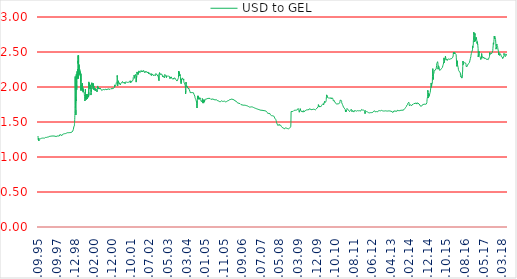
| Category | USD to GEL |
|---|---|
| 25.09.95 | 1.3 |
| 07.10.95 | 1.28 |
| 14.10.95 | 1.28 |
| 21.10.95 | 1.27 |
| 28.10.95 | 1.25 |
| 04.11.95 | 1.245 |
| 11.11.95 | 1.26 |
| 18.11.95 | 1.265 |
| 23.11.95 | 1.258 |
| 02.12.95 | 1.258 |
| 09.12.95 | 1.245 |
| 16.12.95 | 1.245 |
| 23.12.95 | 1.245 |
| 30.12.95 | 1.23 |
| 06.01.96 | 1.23 |
| 13.01.96 | 1.24 |
| 19.01.96 | 1.245 |
| 27.01.96 | 1.25 |
| 03.02.96 | 1.25 |
| 10.02.96 | 1.25 |
| 17.02.96 | 1.256 |
| 24.02.96 | 1.26 |
| 02.03.96 | 1.26 |
| 09.03.96 | 1.26 |
| 16.03.96 | 1.26 |
| 23.03.96 | 1.26 |
| 30.03.96 | 1.262 |
| 06.04.96 | 1.258 |
| 13.04.96 | 1.258 |
| 20.04.96 | 1.255 |
| 27.04.96 | 1.258 |
| 04.05.96 | 1.258 |
| 11.05.96 | 1.258 |
| 18.05.96 | 1.26 |
| 25.05.96 | 1.26 |
| 01.06.96 | 1.26 |
| 08.06.96 | 1.261 |
| 15.06.96 | 1.26 |
| 22.06.96 | 1.26 |
| 29.06.96 | 1.255 |
| 06.07.96 | 1.25 |
| 13.07.96 | 1.264 |
| 20.07.96 | 1.267 |
| 27.07.96 | 1.26 |
| 03.08.96 | 1.262 |
| 10.08.96 | 1.262 |
| 14.08.96 | 1.267 |
| 15.08.96 | 1.268 |
| 16.08.96 | 1.269 |
| 17.08.96 | 1.269 |
| 20.08.96 | 1.268 |
| 21.08.96 | 1.268 |
| 22.08.96 | 1.265 |
| 23.08.96 | 1.268 |
| 24.08.96 | 1.268 |
| 27.08.96 | 1.267 |
| 28.08.96 | 1.267 |
| 31.08.96 | 1.267 |
| 03.09.96 | 1.267 |
| 04.09.96 | 1.267 |
| 05.09.96 | 1.267 |
| 06.09.96 | 1.268 |
| 07.09.96 | 1.269 |
| 10.09.96 | 1.27 |
| 11.09.96 | 1.27 |
| 12.09.96 | 1.27 |
| 13.09.96 | 1.27 |
| 14.09.96 | 1.27 |
| 17.09.96 | 1.27 |
| 18.09.96 | 1.27 |
| 19.09.96 | 1.27 |
| 20.09.96 | 1.27 |
| 23.09.96 | 1.27 |
| 24.09.96 | 1.27 |
| 25.09.96 | 1.27 |
| 26.09.96 | 1.27 |
| 27.09.96 | 1.27 |
| 29.09.96 | 1.27 |
| 30.09.96 | 1.27 |
| 01.10.96 | 1.27 |
| 02.10.96 | 1.27 |
| 03.10.96 | 1.27 |
| 04.10.96 | 1.27 |
| 05.10.96 | 1.27 |
| 08.10.96 | 1.27 |
| 09.10.96 | 1.27 |
| 10.10.96 | 1.27 |
| 11.10.96 | 1.27 |
| 12.10.96 | 1.27 |
| 16.10.96 | 1.27 |
| 17.10.96 | 1.27 |
| 18.10.96 | 1.27 |
| 19.10.96 | 1.27 |
| 22.10.96 | 1.27 |
| 23.10.96 | 1.27 |
| 24.10.96 | 1.27 |
| 25.10.96 | 1.27 |
| 26.10.96 | 1.27 |
| 29.10.96 | 1.27 |
| 30.10.96 | 1.27 |
| 31.10.96 | 1.27 |
| 01.11.96 | 1.27 |
| 02.11.96 | 1.27 |
| 05.11.96 | 1.27 |
| 06.11.96 | 1.27 |
| 08.11.96 | 1.27 |
| 09.11.96 | 1.27 |
| 12.11.96 | 1.27 |
| 13.11.96 | 1.27 |
| 14.11.96 | 1.275 |
| 15.11.96 | 1.277 |
| 16.11.96 | 1.277 |
| 19.11.96 | 1.277 |
| 20.11.96 | 1.28 |
| 21.11.96 | 1.28 |
| 22.11.96 | 1.28 |
| 23.11.96 | 1.28 |
| 26.11.96 | 1.28 |
| 27.11.96 | 1.28 |
| 28.11.96 | 1.28 |
| 29.11.96 | 1.28 |
| 04.12.96 | 1.28 |
| 05.12.96 | 1.28 |
| 06.12.96 | 1.28 |
| 07.12.96 | 1.28 |
| 10.12.96 | 1.28 |
| 11.12.96 | 1.28 |
| 12.12.96 | 1.28 |
| 14.12.96 | 1.28 |
| 17.12.96 | 1.278 |
| 18.12.96 | 1.28 |
| 19.12.96 | 1.28 |
| 20.12.96 | 1.28 |
| 21.12.96 | 1.28 |
| 24.12.96 | 1.278 |
| 25.12.96 | 1.282 |
| 26.12.96 | 1.282 |
| 28.12.96 | 1.279 |
| 31.12.96 | 1.276 |
| 01.01.97 | 1.274 |
| 06.01.97 | 1.28 |
| 07.01.97 | 1.285 |
| 09.01.97 | 1.285 |
| 10.01.97 | 1.285 |
| 11.01.97 | 1.285 |
| 14.01.97 | 1.285 |
| 15.01.97 | 1.285 |
| 16.01.97 | 1.285 |
| 17.01.97 | 1.285 |
| 18.01.97 | 1.283 |
| 21.01.97 | 1.282 |
| 22.01.97 | 1.282 |
| 23.01.97 | 1.282 |
| 24.01.97 | 1.285 |
| 25.01.97 | 1.285 |
| 28.01.97 | 1.285 |
| 29.01.97 | 1.285 |
| 30.01.97 | 1.285 |
| 31.01.97 | 1.285 |
| 01.02.97 | 1.287 |
| 04.02.97 | 1.287 |
| 05.02.97 | 1.287 |
| 06.02.97 | 1.287 |
| 07.02.97 | 1.287 |
| 08.02.97 | 1.287 |
| 11.02.97 | 1.287 |
| 12.02.97 | 1.287 |
| 13.02.97 | 1.287 |
| 14.02.97 | 1.287 |
| 15.02.97 | 1.287 |
| 18.02.97 | 1.287 |
| 19.02.97 | 1.289 |
| 20.02.97 | 1.29 |
| 21.02.97 | 1.288 |
| 22.02.97 | 1.288 |
| 25.02.97 | 1.288 |
| 26.02.97 | 1.288 |
| 27.02.97 | 1.292 |
| 28.02.97 | 1.29 |
| 01.03.97 | 1.29 |
| 05.03.97 | 1.29 |
| 06.03.97 | 1.288 |
| 07.03.97 | 1.288 |
| 08.03.97 | 1.291 |
| 11.03.97 | 1.291 |
| 12.03.97 | 1.291 |
| 13.03.97 | 1.291 |
| 14.03.97 | 1.294 |
| 15.03.97 | 1.295 |
| 18.03.97 | 1.295 |
| 19.03.97 | 1.296 |
| 20.03.97 | 1.296 |
| 21.03.97 | 1.296 |
| 22.03.97 | 1.297 |
| 26.03.97 | 1.298 |
| 27.03.97 | 1.298 |
| 28.03.97 | 1.297 |
| 29.03.97 | 1.295 |
| 01.04.97 | 1.294 |
| 02.04.97 | 1.294 |
| 03.04.97 | 1.295 |
| 04.04.97 | 1.296 |
| 05.04.97 | 1.296 |
| 08.04.97 | 1.296 |
| 09.04.97 | 1.296 |
| 11.04.97 | 1.296 |
| 12.04.97 | 1.295 |
| 15.04.97 | 1.296 |
| 16.04.97 | 1.297 |
| 17.04.97 | 1.297 |
| 18.04.97 | 1.297 |
| 19.04.97 | 1.297 |
| 22.04.97 | 1.297 |
| 23.04.97 | 1.297 |
| 24.04.97 | 1.297 |
| 25.04.97 | 1.297 |
| 26.04.97 | 1.298 |
| 29.04.97 | 1.299 |
| 30.04.97 | 1.298 |
| 02.05.97 | 1.296 |
| 02.05.97 | 1.296 |
| 05.05.97 | 1.296 |
| 06.05.97 | 1.296 |
| 07.05.97 | 1.296 |
| 08.05.97 | 1.298 |
| 09.05.97 | 1.3 |
| 13.05.97 | 1.3 |
| 14.05.97 | 1.3 |
| 15.05.97 | 1.3 |
| 16.05.97 | 1.3 |
| 17.05.97 | 1.3 |
| 20.05.97 | 1.3 |
| 21.05.97 | 1.3 |
| 22.05.97 | 1.3 |
| 23.05.97 | 1.3 |
| 27.05.97 | 1.3 |
| 28.05.97 | 1.3 |
| 29.05.97 | 1.3 |
| 30.05.97 | 1.3 |
| 31.05.97 | 1.3 |
| 03.06.97 | 1.3 |
| 04.06.97 | 1.3 |
| 05.06.97 | 1.3 |
| 07.06.97 | 1.3 |
| 10.06.97 | 1.3 |
| 11.06.97 | 1.3 |
| 12.06.97 | 1.3 |
| 13.06.97 | 1.3 |
| 14.06.97 | 1.3 |
| 17.06.97 | 1.3 |
| 18.06.97 | 1.3 |
| 19.06.97 | 1.3 |
| 20.06.97 | 1.3 |
| 21.06.97 | 1.3 |
| 24.06.97 | 1.3 |
| 25.06.97 | 1.3 |
| 26.06.97 | 1.3 |
| 27.06.97 | 1.3 |
| 28.06.97 | 1.3 |
| 01.07.97 | 1.3 |
| 02.07.97 | 1.3 |
| 03.07.97 | 1.3 |
| 04.07.97 | 1.3 |
| 05.07.97 | 1.3 |
| 08.07.97 | 1.3 |
| 09.07.97 | 1.3 |
| 10.07.97 | 1.3 |
| 11.07.97 | 1.3 |
| 12.07.97 | 1.3 |
| 15.07.97 | 1.3 |
| 16.07.97 | 1.3 |
| 17.07.97 | 1.3 |
| 18.07.97 | 1.3 |
| 19.07.97 | 1.298 |
| 22.07.97 | 1.298 |
| 23.07.97 | 1.298 |
| 24.07.97 | 1.297 |
| 26.07.97 | 1.298 |
| 29.07.97 | 1.296 |
| 30.07.97 | 1.295 |
| 31.07.97 | 1.294 |
| 01.08.97 | 1.29 |
| 02.08.97 | 1.288 |
| 05.08.97 | 1.288 |
| 06.08.97 | 1.286 |
| 07.08.97 | 1.287 |
| 08.08.97 | 1.288 |
| 09.08.97 | 1.287 |
| 13.08.97 | 1.286 |
| 14.08.97 | 1.286 |
| 15.08.97 | 1.286 |
| 16.08.97 | 1.293 |
| 19.08.97 | 1.292 |
| 20.08.97 | 1.292 |
| 21.08.97 | 1.292 |
| 22.08.97 | 1.292 |
| 23.08.97 | 1.292 |
| 26.08.97 | 1.292 |
| 27.08.97 | 1.292 |
| 28.08.97 | 1.292 |
| 30.08.97 | 1.292 |
| 02.09.97 | 1.292 |
| 03.09.97 | 1.295 |
| 04.09.97 | 1.293 |
| 05.09.97 | 1.296 |
| 06.09.97 | 1.299 |
| 09.09.97 | 1.299 |
| 10.09.97 | 1.299 |
| 11.09.97 | 1.298 |
| 12.09.97 | 1.299 |
| 13.09.97 | 1.3 |
| 16.09.97 | 1.299 |
| 17.09.97 | 1.298 |
| 18.09.97 | 1.298 |
| 19.09.97 | 1.298 |
| 20.09.97 | 1.298 |
| 23.09.97 | 1.298 |
| 24.09.97 | 1.297 |
| 25.09.97 | 1.296 |
| 26.09.97 | 1.298 |
| 27.09.97 | 1.298 |
| 30.09.97 | 1.298 |
| 01.10.97 | 1.298 |
| 02.10.97 | 1.298 |
| 03.10.97 | 1.298 |
| 04.10.97 | 1.298 |
| 07.10.97 | 1.298 |
| 08.10.97 | 1.3 |
| 09.10.97 | 1.3 |
| 10.10.97 | 1.3 |
| 11.10.97 | 1.3 |
| 14.10.97 | 1.3 |
| 16.10.97 | 1.3 |
| 17.10.97 | 1.3 |
| 18.10.97 | 1.3 |
| 21.10.97 | 1.3 |
| 22.10.97 | 1.3 |
| 24.10.97 | 1.3 |
| 25.10.97 | 1.3 |
| 28.10.97 | 1.3 |
| 29.10.97 | 1.3 |
| 30.10.97 | 1.3 |
| 31.10.97 | 1.3 |
| 01.11.97 | 1.3 |
| 04.11.97 | 1.3 |
| 05.11.97 | 1.3 |
| 06.11.97 | 1.3 |
| 07.11.97 | 1.3 |
| 08.11.97 | 1.3 |
| 11.11.97 | 1.3 |
| 12.11.97 | 1.3 |
| 13.11.97 | 1.3 |
| 14.11.97 | 1.3 |
| 15.11.97 | 1.306 |
| 18.11.97 | 1.32 |
| 19.11.97 | 1.315 |
| 20.11.97 | 1.312 |
| 21.11.97 | 1.313 |
| 22.11.97 | 1.314 |
| 25.11.97 | 1.315 |
| 26.11.97 | 1.314 |
| 27.11.97 | 1.313 |
| 28.11.97 | 1.311 |
| 29.11.97 | 1.312 |
| 02.12.97 | 1.313 |
| 03.12.97 | 1.312 |
| 04.12.97 | 1.316 |
| 05.12.97 | 1.315 |
| 06.12.97 | 1.316 |
| 09.12.97 | 1.317 |
| 10.12.97 | 1.315 |
| 11.12.97 | 1.315 |
| 12.12.97 | 1.315 |
| 13.12.97 | 1.316 |
| 16.12.97 | 1.319 |
| 17.12.97 | 1.319 |
| 18.12.97 | 1.324 |
| 19.12.97 | 1.324 |
| 20.12.97 | 1.325 |
| 23.12.97 | 1.322 |
| 24.12.97 | 1.322 |
| 25.12.97 | 1.32 |
| 26.12.97 | 1.319 |
| 27.12.97 | 1.315 |
| 30.12.97 | 1.31 |
| 31.12.97 | 1.304 |
| 01.01.98 | 1.304 |
| 05.01.98 | 1.305 |
| 06.01.98 | 1.306 |
| 07.01.98 | 1.309 |
| 09.01.98 | 1.312 |
| 10.01.98 | 1.315 |
| 13.01.98 | 1.32 |
| 14.01.98 | 1.32 |
| 15.01.98 | 1.32 |
| 16.01.98 | 1.32 |
| 17.01.98 | 1.322 |
| 21.01.98 | 1.323 |
| 22.01.98 | 1.325 |
| 23.01.98 | 1.325 |
| 24.01.98 | 1.327 |
| 27.01.98 | 1.327 |
| 28.01.98 | 1.327 |
| 29.01.98 | 1.326 |
| 30.01.98 | 1.326 |
| 31.01.98 | 1.324 |
| 03.02.98 | 1.324 |
| 04.02.98 | 1.325 |
| 05.02.98 | 1.326 |
| 06.02.98 | 1.326 |
| 07.02.98 | 1.327 |
| 10.02.98 | 1.329 |
| 11.02.98 | 1.329 |
| 12.02.98 | 1.329 |
| 13.02.98 | 1.329 |
| 14.02.98 | 1.329 |
| 18.02.98 | 1.327 |
| 19.02.98 | 1.328 |
| 20.02.98 | 1.33 |
| 21.02.98 | 1.33 |
| 24.02.98 | 1.331 |
| 25.02.98 | 1.332 |
| 26.02.98 | 1.332 |
| 27.02.98 | 1.332 |
| 28.02.98 | 1.332 |
| 03.03.98 | 1.332 |
| 05.03.98 | 1.332 |
| 06.03.98 | 1.333 |
| 07.03.98 | 1.333 |
| 10.03.98 | 1.333 |
| 11.03.98 | 1.333 |
| 12.03.98 | 1.333 |
| 13.03.98 | 1.333 |
| 14.03.98 | 1.334 |
| 17.03.98 | 1.334 |
| 18.03.98 | 1.335 |
| 19.03.98 | 1.335 |
| 20.03.98 | 1.335 |
| 21.03.98 | 1.335 |
| 24.03.98 | 1.335 |
| 28.03.98 | 1.335 |
| 31.03.98 | 1.335 |
| 01.04.98 | 1.335 |
| 02.04.98 | 1.335 |
| 08.04.98 | 1.335 |
| 09.04.98 | 1.335 |
| 11.04.98 | 1.335 |
| 15.04.98 | 1.335 |
| 16.04.98 | 1.335 |
| 17.04.98 | 1.335 |
| 18.04.98 | 1.335 |
| 22.04.98 | 1.335 |
| 23.04.98 | 1.335 |
| 24.04.98 | 1.335 |
| 25.04.98 | 1.335 |
| 29.04.98 | 1.335 |
| 02.05.98 | 1.335 |
| 06.05.98 | 1.335 |
| 07.05.98 | 1.336 |
| 08.05.98 | 1.338 |
| 09.05.98 | 1.339 |
| 12.05.98 | 1.339 |
| 13.05.98 | 1.34 |
| 14.05.98 | 1.342 |
| 15.05.98 | 1.342 |
| 16.05.98 | 1.342 |
| 19.05.98 | 1.342 |
| 20.05.98 | 1.342 |
| 22.05.98 | 1.343 |
| 23.05.98 | 1.344 |
| 26.05.98 | 1.345 |
| 28.05.98 | 1.345 |
| 29.05.98 | 1.347 |
| 30.05.98 | 1.347 |
| 02.06.98 | 1.347 |
| 03.06.98 | 1.345 |
| 04.06.98 | 1.347 |
| 05.06.98 | 1.348 |
| 06.06.98 | 1.349 |
| 10.06.98 | 1.348 |
| 11.06.98 | 1.348 |
| 12.06.98 | 1.348 |
| 13.06.98 | 1.348 |
| 16.06.98 | 1.348 |
| 17.06.98 | 1.348 |
| 18.06.98 | 1.348 |
| 19.06.98 | 1.348 |
| 20.06.98 | 1.348 |
| 23.06.98 | 1.348 |
| 24.06.98 | 1.348 |
| 25.06.98 | 1.348 |
| 26.06.98 | 1.348 |
| 27.06.98 | 1.348 |
| 30.06.98 | 1.348 |
| 02.07.98 | 1.348 |
| 03.07.98 | 1.349 |
| 04.07.98 | 1.35 |
| 08.07.98 | 1.347 |
| 09.07.98 | 1.347 |
| 10.07.98 | 1.347 |
| 11.07.98 | 1.347 |
| 14.07.98 | 1.347 |
| 16.07.98 | 1.347 |
| 18.07.98 | 1.347 |
| 21.07.98 | 1.347 |
| 22.07.98 | 1.347 |
| 23.07.98 | 1.347 |
| 24.07.98 | 1.347 |
| 25.07.98 | 1.347 |
| 28.07.98 | 1.346 |
| 29.07.98 | 1.346 |
| 30.07.98 | 1.346 |
| 31.07.98 | 1.348 |
| 01.08.98 | 1.348 |
| 03.08.98 | 1.348 |
| 04.08.98 | 1.348 |
| 06.08.98 | 1.349 |
| 07.08.98 | 1.349 |
| 08.08.98 | 1.349 |
| 11.08.98 | 1.349 |
| 12.08.98 | 1.349 |
| 13.08.98 | 1.349 |
| 14.08.98 | 1.349 |
| 15.08.98 | 1.349 |
| 18.08.98 | 1.349 |
| 19.08.98 | 1.349 |
| 20.08.98 | 1.349 |
| 21.08.98 | 1.35 |
| 22.08.98 | 1.35 |
| 25.08.98 | 1.35 |
| 26.08.98 | 1.35 |
| 27.08.98 | 1.351 |
| 28.08.98 | 1.35 |
| 01.09.98 | 1.35 |
| 02.09.98 | 1.349 |
| 03.09.98 | 1.349 |
| 04.09.98 | 1.35 |
| 05.09.98 | 1.35 |
| 08.09.98 | 1.35 |
| 09.09.98 | 1.35 |
| 10.09.98 | 1.348 |
| 11.09.98 | 1.349 |
| 12.09.98 | 1.35 |
| 15.09.98 | 1.35 |
| 16.09.98 | 1.351 |
| 17.09.98 | 1.352 |
| 18.09.98 | 1.353 |
| 19.09.98 | 1.354 |
| 22.09.98 | 1.355 |
| 23.09.98 | 1.356 |
| 24.09.98 | 1.358 |
| 25.09.98 | 1.36 |
| 26.09.98 | 1.361 |
| 29.09.98 | 1.362 |
| 30.09.98 | 1.364 |
| 01.10.98 | 1.367 |
| 02.10.98 | 1.369 |
| 03.10.98 | 1.369 |
| 06.10.98 | 1.369 |
| 07.10.98 | 1.369 |
| 08.10.98 | 1.369 |
| 09.10.98 | 1.37 |
| 10.10.98 | 1.37 |
| 13.10.98 | 1.371 |
| 14.10.98 | 1.374 |
| 16.10.98 | 1.376 |
| 17.10.98 | 1.379 |
| 20.10.98 | 1.38 |
| 21.10.98 | 1.38 |
| 22.10.98 | 1.38 |
| 23.10.98 | 1.38 |
| 24.10.98 | 1.38 |
| 27.10.98 | 1.38 |
| 28.10.98 | 1.395 |
| 29.10.98 | 1.4 |
| 30.10.98 | 1.404 |
| 31.10.98 | 1.408 |
| 03.11.98 | 1.414 |
| 04.11.98 | 1.42 |
| 05.11.98 | 1.43 |
| 06.11.98 | 1.435 |
| 07.11.98 | 1.438 |
| 10.11.98 | 1.44 |
| 11.11.98 | 1.44 |
| 12.11.98 | 1.44 |
| 13.11.98 | 1.44 |
| 14.11.98 | 1.44 |
| 17.11.98 | 1.44 |
| 18.11.98 | 1.44 |
| 19.11.98 | 1.445 |
| 20.11.98 | 1.46 |
| 21.11.98 | 1.47 |
| 25.11.98 | 1.48 |
| 26.11.98 | 1.495 |
| 27.11.98 | 1.515 |
| 28.11.98 | 1.535 |
| 01.12.98 | 1.56 |
| 02.12.98 | 1.59 |
| 03.12.98 | 1.62 |
| 04.12.98 | 1.67 |
| 05.12.98 | 1.73 |
| 08.12.98 | 2.1 |
| 09.12.98 | 2.105 |
| 10.12.98 | 2.15 |
| 12.12.98 | 2.14 |
| 15.12.98 | 1.95 |
| 16.12.98 | 1.755 |
| 17.12.98 | 1.7 |
| 18.12.98 | 1.69 |
| 19.12.98 | 1.86 |
| 22.12.98 | 1.77 |
| 23.12.98 | 1.72 |
| 24.12.98 | 1.69 |
| 25.12.98 | 1.65 |
| 26.12.98 | 1.6 |
| 29.12.98 | 1.67 |
| 30.12.98 | 1.82 |
| 31.12.98 | 1.8 |
| 01.01.99 | 1.79 |
| 06.01.99 | 1.97 |
| 07.01.99 | 2.18 |
| 09.01.99 | 2.18 |
| 12.01.99 | 1.961 |
| 13.01.99 | 1.96 |
| 14.01.99 | 2.065 |
| 15.01.99 | 2.08 |
| 16.01.99 | 1.995 |
| 19.01.99 | 1.96 |
| 21.01.99 | 2.025 |
| 22.01.99 | 2.05 |
| 23.01.99 | 2.065 |
| 26.01.99 | 2.09 |
| 27.01.99 | 2.086 |
| 28.01.99 | 2.112 |
| 29.01.99 | 2.225 |
| 30.01.99 | 2.12 |
| 02.02.99 | 2.12 |
| 03.02.99 | 2.195 |
| 04.02.99 | 2.21 |
| 05.02.99 | 2.205 |
| 06.02.99 | 2.155 |
| 09.02.99 | 2.195 |
| 10.02.99 | 2.255 |
| 11.02.99 | 2.15 |
| 12.02.99 | 2.235 |
| 13.02.99 | 2.26 |
| 16.02.99 | 2.285 |
| 17.02.99 | 2.285 |
| 18.02.99 | 2.375 |
| 19.02.99 | 2.37 |
| 20.02.99 | 2.335 |
| 23.02.99 | 2.451 |
| 24.02.99 | 2.39 |
| 27.02.99 | 2.35 |
| 02.03.99 | 2.232 |
| 03.03.99 | 2.12 |
| 05.03.99 | 2.226 |
| 06.03.99 | 2.45 |
| 09.03.99 | 2.35 |
| 10.03.99 | 2.26 |
| 11.03.99 | 2.3 |
| 12.03.99 | 2.295 |
| 13.03.99 | 2.25 |
| 16.03.99 | 2.32 |
| 17.03.99 | 2.32 |
| 18.03.99 | 2.32 |
| 19.03.99 | 2.32 |
| 20.03.99 | 2.294 |
| 23.03.99 | 2.3 |
| 24.03.99 | 2.24 |
| 25.03.99 | 2.22 |
| 26.03.99 | 2.18 |
| 27.03.99 | 2.18 |
| 30.03.99 | 2.18 |
| 31.03.99 | 2.205 |
| 01.04.99 | 2.215 |
| 03.04.99 | 2.25 |
| 06.04.99 | 2.24 |
| 07.04.99 | 2.24 |
| 08.04.99 | 2.21 |
| 09.04.99 | 2.18 |
| 14.04.99 | 2.22 |
| 15.04.99 | 2.22 |
| 16.04.99 | 2.19 |
| 17.04.99 | 2.19 |
| 20.04.99 | 2.16 |
| 21.04.99 | 2.17 |
| 22.04.99 | 2.18 |
| 23.04.99 | 2.18 |
| 24.04.99 | 2.19 |
| 27.04.99 | 2.18 |
| 28.04.99 | 2.171 |
| 29.04.99 | 2.06 |
| 30.04.99 | 1.95 |
| 01.05.99 | 1.94 |
| 04.05.99 | 2.03 |
| 05.05.99 | 2.19 |
| 06.05.99 | 2.08 |
| 07.05.99 | 2.093 |
| 08.05.99 | 2.06 |
| 11.05.99 | 2.05 |
| 12.05.99 | 2.03 |
| 13.05.99 | 2.025 |
| 14.05.99 | 2.025 |
| 15.05.99 | 2.04 |
| 18.05.99 | 2.042 |
| 19.05.99 | 2.03 |
| 20.05.99 | 2.03 |
| 21.05.99 | 1.97 |
| 22.05.99 | 2.03 |
| 25.05.99 | 1.98 |
| 26.05.99 | 1.95 |
| 28.05.99 | 1.95 |
| 29.05.99 | 1.97 |
| 01.06.99 | 1.99 |
| 02.06.99 | 1.98 |
| 03.06.99 | 1.98 |
| 04.06.99 | 1.98 |
| 05.06.99 | 2.038 |
| 08.06.99 | 2.055 |
| 09.06.99 | 2.055 |
| 10.06.99 | 2.05 |
| 11.06.99 | 1.99 |
| 12.06.99 | 2.005 |
| 15.06.99 | 2.005 |
| 16.06.99 | 1.995 |
| 17.06.99 | 1.94 |
| 18.06.99 | 1.98 |
| 19.06.99 | 1.98 |
| 22.06.99 | 1.971 |
| 23.06.99 | 1.97 |
| 24.06.99 | 1.95 |
| 25.06.99 | 1.925 |
| 26.06.99 | 1.96 |
| 29.06.99 | 1.94 |
| 30.06.99 | 1.94 |
| 01.07.99 | 1.94 |
| 02.07.99 | 1.94 |
| 03.07.99 | 1.93 |
| 06.07.99 | 1.935 |
| 07.07.99 | 1.94 |
| 08.07.99 | 1.94 |
| 09.07.99 | 1.94 |
| 10.07.99 | 1.93 |
| 13.07.99 | 1.93 |
| 14.07.99 | 1.935 |
| 15.07.99 | 1.935 |
| 16.07.99 | 1.935 |
| 17.07.99 | 1.925 |
| 20.07.99 | 1.92 |
| 21.07.99 | 1.92 |
| 22.07.99 | 1.89 |
| 23.07.99 | 1.89 |
| 24.07.99 | 1.88 |
| 27.07.99 | 1.88 |
| 28.07.99 | 1.86 |
| 29.07.99 | 1.84 |
| 30.07.99 | 1.84 |
| 31.07.99 | 1.82 |
| 03.08.99 | 1.81 |
| 04.08.99 | 1.8 |
| 05.08.99 | 1.8 |
| 06.08.99 | 1.8 |
| 07.08.99 | 1.8 |
| 10.08.99 | 1.84 |
| 11.08.99 | 1.86 |
| 12.08.99 | 1.885 |
| 13.08.99 | 1.91 |
| 14.08.99 | 1.97 |
| 17.08.99 | 1.91 |
| 18.08.99 | 1.86 |
| 19.08.99 | 1.83 |
| 20.08.99 | 1.875 |
| 21.08.99 | 1.87 |
| 24.08.99 | 1.84 |
| 25.08.99 | 1.83 |
| 26.08.99 | 1.831 |
| 27.08.99 | 1.842 |
| 28.08.99 | 1.86 |
| 31.08.99 | 1.86 |
| 01.09.99 | 1.85 |
| 02.09.99 | 1.82 |
| 03.09.99 | 1.85 |
| 04.09.99 | 1.85 |
| 07.09.99 | 1.88 |
| 08.09.99 | 1.88 |
| 09.09.99 | 1.88 |
| 10.09.99 | 1.86 |
| 11.09.99 | 1.87 |
| 14.09.99 | 1.871 |
| 15.09.99 | 1.89 |
| 16.09.99 | 1.87 |
| 17.09.99 | 1.872 |
| 18.09.99 | 1.875 |
| 21.09.99 | 1.9 |
| 22.09.99 | 1.875 |
| 23.09.99 | 1.86 |
| 24.09.99 | 1.867 |
| 25.09.99 | 1.867 |
| 28.09.99 | 1.86 |
| 29.09.99 | 1.83 |
| 30.09.99 | 1.852 |
| 01.10.99 | 1.85 |
| 02.10.99 | 1.85 |
| 05.10.99 | 1.875 |
| 06.10.99 | 1.855 |
| 07.10.99 | 1.86 |
| 08.10.99 | 1.865 |
| 09.10.99 | 1.865 |
| 12.10.99 | 1.85 |
| 13.10.99 | 1.855 |
| 14.10.99 | 1.855 |
| 16.10.99 | 1.87 |
| 19.10.99 | 1.873 |
| 20.10.99 | 1.865 |
| 21.10.99 | 1.875 |
| 22.10.99 | 1.89 |
| 23.10.99 | 1.912 |
| 26.10.99 | 1.93 |
| 27.10.99 | 1.855 |
| 28.10.99 | 1.885 |
| 29.10.99 | 1.925 |
| 30.10.99 | 1.88 |
| 02.11.99 | 1.975 |
| 03.11.99 | 2.073 |
| 04.11.99 | 2.073 |
| 05.11.99 | 2 |
| 06.11.99 | 1.97 |
| 09.11.99 | 2 |
| 10.11.99 | 2 |
| 11.11.99 | 2.045 |
| 12.11.99 | 2.05 |
| 15.11.99 | 2 |
| 16.11.99 | 2.01 |
| 17.11.99 | 2.05 |
| 18.11.99 | 2.05 |
| 19.11.99 | 2.045 |
| 20.11.99 | 2.06 |
| 23.11.99 | 2.059 |
| 25.11.99 | 2.01 |
| 26.11.99 | 2.01 |
| 27.11.99 | 2 |
| 30.11.99 | 2 |
| 01.12.99 | 2 |
| 02.12.99 | 2 |
| 03.12.99 | 1.98 |
| 04.12.99 | 1.98 |
| 07.12.99 | 2.03 |
| 08.12.99 | 1.98 |
| 09.12.99 | 1.99 |
| 10.12.99 | 1.97 |
| 11.12.99 | 1.97 |
| 14.12.99 | 2.001 |
| 15.12.99 | 1.99 |
| 16.12.99 | 1.97 |
| 17.12.99 | 1.98 |
| 18.12.99 | 1.94 |
| 21.12.99 | 1.945 |
| 22.12.99 | 1.885 |
| 23.12.99 | 1.885 |
| 24.12.99 | 1.885 |
| 25.12.99 | 1.885 |
| 28.12.99 | 1.915 |
| 29.12.99 | 1.915 |
| 30.12.99 | 1.96 |
| 31.12.99 | 1.93 |
| 01.01.00 | 1.96 |
| 02.01.00 | 1.96 |
| 03.01.00 | 1.96 |
| 04.01.00 | 1.99 |
| 05.01.00 | 2.05 |
| 06.01.00 | 2.03 |
| 07.01.00 | 2.06 |
| 08.01.00 | 2.06 |
| 09.01.00 | 2.06 |
| 10.01.00 | 2.06 |
| 11.01.00 | 2.06 |
| 12.01.00 | 2.062 |
| 13.01.00 | 2.04 |
| 14.01.00 | 2.05 |
| 15.01.00 | 2.05 |
| 16.01.00 | 2.05 |
| 17.01.00 | 2.05 |
| 18.01.00 | 2.04 |
| 19.01.00 | 2.01 |
| 20.01.00 | 2.01 |
| 21.01.00 | 2.015 |
| 22.01.00 | 2.037 |
| 23.01.00 | 2.037 |
| 24.01.00 | 2.037 |
| 25.01.00 | 2.037 |
| 26.01.00 | 2.018 |
| 27.01.00 | 2 |
| 28.01.00 | 1.97 |
| 29.01.00 | 1.97 |
| 30.01.00 | 1.97 |
| 31.01.00 | 1.97 |
| 01.02.00 | 2.05 |
| 02.02.00 | 2.03 |
| 03.02.00 | 2.009 |
| 04.02.00 | 2 |
| 05.02.00 | 1.98 |
| 06.02.00 | 1.98 |
| 07.02.00 | 1.98 |
| 08.02.00 | 2.015 |
| 09.02.00 | 1.98 |
| 10.02.00 | 1.96 |
| 11.02.00 | 1.98 |
| 12.02.00 | 1.99 |
| 13.02.00 | 1.99 |
| 14.02.00 | 1.99 |
| 15.02.00 | 1.98 |
| 16.02.00 | 1.969 |
| 17.02.00 | 1.98 |
| 18.02.00 | 1.98 |
| 19.02.00 | 1.959 |
| 20.02.00 | 1.959 |
| 21.02.00 | 1.959 |
| 22.02.00 | 1.975 |
| 23.02.00 | 1.975 |
| 24.02.00 | 1.96 |
| 25.02.00 | 1.97 |
| 26.02.00 | 1.97 |
| 27.02.00 | 1.97 |
| 28.02.00 | 1.97 |
| 29.02.00 | 1.98 |
| 01.03.00 | 1.95 |
| 02.03.00 | 1.96 |
| 03.03.00 | 1.97 |
| 04.03.00 | 1.97 |
| 05.03.00 | 1.97 |
| 06.03.00 | 1.97 |
| 07.03.00 | 1.95 |
| 08.03.00 | 1.96 |
| 09.03.00 | 1.96 |
| 10.03.00 | 1.96 |
| 11.03.00 | 1.97 |
| 12.03.00 | 1.97 |
| 13.03.00 | 1.97 |
| 14.03.00 | 1.97 |
| 15.03.00 | 1.98 |
| 16.03.00 | 1.972 |
| 17.03.00 | 1.972 |
| 18.03.00 | 1.975 |
| 19.03.00 | 1.975 |
| 20.03.00 | 1.975 |
| 21.03.00 | 1.975 |
| 22.03.00 | 1.969 |
| 23.03.00 | 1.96 |
| 24.03.00 | 1.96 |
| 25.03.00 | 1.97 |
| 26.03.00 | 1.97 |
| 27.03.00 | 1.97 |
| 28.03.00 | 1.96 |
| 29.03.00 | 1.964 |
| 30.03.00 | 1.96 |
| 31.03.00 | 1.93 |
| 01.04.00 | 1.93 |
| 02.04.00 | 1.93 |
| 03.04.00 | 1.93 |
| 04.04.00 | 1.964 |
| 05.04.00 | 1.985 |
| 06.04.00 | 1.979 |
| 07.04.00 | 1.985 |
| 08.04.00 | 1.995 |
| 09.04.00 | 1.995 |
| 10.04.00 | 1.995 |
| 11.04.00 | 2.015 |
| 12.04.00 | 2.015 |
| 13.04.00 | 1.995 |
| 14.04.00 | 1.975 |
| 15.04.00 | 2 |
| 16.04.00 | 2 |
| 17.04.00 | 2 |
| 18.04.00 | 1.985 |
| 19.04.00 | 1.987 |
| 20.04.00 | 1.99 |
| 21.04.00 | 1.995 |
| 22.04.00 | 1.985 |
| 23.04.00 | 1.985 |
| 24.04.00 | 1.985 |
| 25.04.00 | 1.98 |
| 26.04.00 | 1.98 |
| 27.04.00 | 1.98 |
| 28.04.00 | 1.98 |
| 29.04.00 | 1.97 |
| 30.04.00 | 1.97 |
| 01.05.00 | 1.97 |
| 02.05.00 | 1.97 |
| 03.05.00 | 1.98 |
| 04.05.00 | 1.975 |
| 05.05.00 | 1.975 |
| 06.05.00 | 1.985 |
| 07.05.00 | 1.985 |
| 08.05.00 | 1.985 |
| 09.05.00 | 1.98 |
| 10.05.00 | 1.98 |
| 11.05.00 | 1.98 |
| 12.05.00 | 1.99 |
| 13.05.00 | 1.99 |
| 14.05.00 | 1.99 |
| 15.05.00 | 1.99 |
| 16.05.00 | 1.985 |
| 17.05.00 | 1.97 |
| 18.05.00 | 1.97 |
| 19.05.00 | 1.98 |
| 20.05.00 | 1.985 |
| 21.05.00 | 1.985 |
| 22.05.00 | 1.985 |
| 23.05.00 | 1.975 |
| 24.05.00 | 1.982 |
| 25.05.00 | 1.982 |
| 26.05.00 | 1.98 |
| 27.05.00 | 1.98 |
| 28.05.00 | 1.98 |
| 29.05.00 | 1.98 |
| 30.05.00 | 1.98 |
| 31.05.00 | 1.973 |
| 01.06.00 | 1.973 |
| 02.06.00 | 1.975 |
| 03.06.00 | 1.97 |
| 04.06.00 | 1.97 |
| 05.06.00 | 1.97 |
| 06.06.00 | 1.97 |
| 07.06.00 | 1.97 |
| 08.06.00 | 1.97 |
| 09.06.00 | 1.97 |
| 10.06.00 | 1.97 |
| 11.06.00 | 1.97 |
| 12.06.00 | 1.97 |
| 13.06.00 | 1.97 |
| 14.06.00 | 1.96 |
| 15.06.00 | 1.95 |
| 16.06.00 | 1.95 |
| 17.06.00 | 1.96 |
| 18.06.00 | 1.96 |
| 19.06.00 | 1.96 |
| 20.06.00 | 1.96 |
| 21.06.00 | 1.96 |
| 22.06.00 | 1.96 |
| 23.06.00 | 1.96 |
| 24.06.00 | 1.96 |
| 25.06.00 | 1.96 |
| 26.06.00 | 1.96 |
| 27.06.00 | 1.96 |
| 28.06.00 | 1.96 |
| 29.06.00 | 1.96 |
| 30.06.00 | 1.96 |
| 01.07.00 | 1.96 |
| 02.07.00 | 1.96 |
| 03.07.00 | 1.96 |
| 04.07.00 | 1.96 |
| 05.07.00 | 1.96 |
| 06.07.00 | 1.96 |
| 07.07.00 | 1.963 |
| 08.07.00 | 1.965 |
| 09.07.00 | 1.965 |
| 10.07.00 | 1.965 |
| 11.07.00 | 1.965 |
| 12.07.00 | 1.965 |
| 13.07.00 | 1.965 |
| 14.07.00 | 1.965 |
| 15.07.00 | 1.965 |
| 16.07.00 | 1.965 |
| 17.07.00 | 1.965 |
| 18.07.00 | 1.965 |
| 19.07.00 | 1.965 |
| 20.07.00 | 1.965 |
| 21.07.00 | 1.965 |
| 22.07.00 | 1.965 |
| 23.07.00 | 1.965 |
| 24.07.00 | 1.965 |
| 25.07.00 | 1.965 |
| 26.07.00 | 1.965 |
| 27.07.00 | 1.965 |
| 28.07.00 | 1.965 |
| 29.07.00 | 1.965 |
| 30.07.00 | 1.965 |
| 31.07.00 | 1.965 |
| 01.08.00 | 1.965 |
| 02.08.00 | 1.96 |
| 03.08.00 | 1.96 |
| 04.08.00 | 1.96 |
| 05.08.00 | 1.96 |
| 06.08.00 | 1.96 |
| 07.08.00 | 1.96 |
| 08.08.00 | 1.965 |
| 09.08.00 | 1.965 |
| 10.08.00 | 1.97 |
| 11.08.00 | 1.97 |
| 12.08.00 | 1.97 |
| 13.08.00 | 1.97 |
| 14.08.00 | 1.97 |
| 15.08.00 | 1.97 |
| 16.08.00 | 1.97 |
| 17.08.00 | 1.97 |
| 18.08.00 | 1.97 |
| 19.08.00 | 1.97 |
| 20.08.00 | 1.97 |
| 21.08.00 | 1.97 |
| 22.08.00 | 1.97 |
| 23.08.00 | 1.97 |
| 24.08.00 | 1.97 |
| 25.08.00 | 1.97 |
| 26.08.00 | 1.96 |
| 27.08.00 | 1.96 |
| 28.08.00 | 1.96 |
| 29.08.00 | 1.96 |
| 30.08.00 | 1.96 |
| 31.08.00 | 1.96 |
| 01.09.00 | 1.97 |
| 02.09.00 | 1.97 |
| 03.09.00 | 1.97 |
| 04.09.00 | 1.97 |
| 05.09.00 | 1.97 |
| 06.09.00 | 1.96 |
| 07.09.00 | 1.96 |
| 08.09.00 | 1.96 |
| 09.09.00 | 1.96 |
| 10.09.00 | 1.96 |
| 11.09.00 | 1.96 |
| 12.09.00 | 1.96 |
| 13.09.00 | 1.96 |
| 14.09.00 | 1.96 |
| 15.09.00 | 1.96 |
| 16.09.00 | 1.96 |
| 17.09.00 | 1.96 |
| 18.09.00 | 1.96 |
| 19.09.00 | 1.96 |
| 20.09.00 | 1.961 |
| 21.09.00 | 1.965 |
| 22.09.00 | 1.973 |
| 23.09.00 | 1.973 |
| 24.09.00 | 1.973 |
| 25.09.00 | 1.973 |
| 26.09.00 | 1.97 |
| 27.09.00 | 1.97 |
| 28.09.00 | 1.97 |
| 29.09.00 | 1.96 |
| 30.09.00 | 1.96 |
| 01.10.00 | 1.96 |
| 02.10.00 | 1.96 |
| 03.10.00 | 1.96 |
| 04.10.00 | 1.975 |
| 05.10.00 | 1.975 |
| 06.10.00 | 1.97 |
| 07.10.00 | 1.97 |
| 08.10.00 | 1.97 |
| 09.10.00 | 1.97 |
| 10.10.00 | 1.975 |
| 11.10.00 | 1.977 |
| 12.10.00 | 1.97 |
| 13.10.00 | 1.97 |
| 14.10.00 | 1.97 |
| 15.10.00 | 1.97 |
| 16.10.00 | 1.97 |
| 17.10.00 | 1.965 |
| 18.10.00 | 1.965 |
| 19.10.00 | 1.965 |
| 20.10.00 | 1.965 |
| 21.10.00 | 1.974 |
| 22.10.00 | 1.974 |
| 23.10.00 | 1.974 |
| 24.10.00 | 1.97 |
| 25.10.00 | 1.971 |
| 26.10.00 | 1.965 |
| 27.10.00 | 1.965 |
| 28.10.00 | 1.965 |
| 29.10.00 | 1.965 |
| 30.10.00 | 1.965 |
| 31.10.00 | 1.967 |
| 01.11.00 | 1.96 |
| 02.11.00 | 1.96 |
| 03.11.00 | 1.975 |
| 04.11.00 | 1.965 |
| 05.11.00 | 1.965 |
| 06.11.00 | 1.965 |
| 07.11.00 | 1.971 |
| 08.11.00 | 1.971 |
| 09.11.00 | 1.975 |
| 10.11.00 | 1.975 |
| 11.11.00 | 1.975 |
| 12.11.00 | 1.975 |
| 13.11.00 | 1.975 |
| 14.11.00 | 1.98 |
| 15.11.00 | 1.975 |
| 16.11.00 | 1.98 |
| 17.11.00 | 1.984 |
| 18.11.00 | 1.98 |
| 19.11.00 | 1.98 |
| 20.11.00 | 1.98 |
| 21.11.00 | 1.975 |
| 22.11.00 | 1.975 |
| 23.11.00 | 1.984 |
| 24.11.00 | 1.984 |
| 25.11.00 | 1.98 |
| 26.11.00 | 1.98 |
| 27.11.00 | 1.98 |
| 28.11.00 | 1.975 |
| 29.11.00 | 1.97 |
| 30.11.00 | 1.97 |
| 01.12.00 | 1.97 |
| 02.12.00 | 1.98 |
| 03.12.00 | 1.98 |
| 04.12.00 | 1.98 |
| 05.12.00 | 1.98 |
| 06.12.00 | 1.98 |
| 07.12.00 | 1.98 |
| 08.12.00 | 1.985 |
| 09.12.00 | 1.985 |
| 10.12.00 | 1.985 |
| 11.12.00 | 1.985 |
| 12.12.00 | 1.985 |
| 13.12.00 | 1.985 |
| 14.12.00 | 1.98 |
| 15.12.00 | 1.985 |
| 16.12.00 | 1.984 |
| 17.12.00 | 1.984 |
| 18.12.00 | 1.984 |
| 19.12.00 | 1.98 |
| 20.12.00 | 1.98 |
| 21.12.00 | 1.98 |
| 22.12.00 | 1.981 |
| 23.12.00 | 1.98 |
| 24.12.00 | 1.98 |
| 25.12.00 | 1.98 |
| 26.12.00 | 1.975 |
| 27.12.00 | 1.975 |
| 28.12.00 | 1.975 |
| 29.12.00 | 1.975 |
| 30.12.00 | 1.975 |
| 31.12.00 | 1.975 |
| 01.01.01 | 1.975 |
| 02.01.01 | 1.975 |
| 03.01.01 | 1.975 |
| 04.01.01 | 1.975 |
| 05.01.01 | 1.99 |
| 06.01.01 | 1.98 |
| 07.01.01 | 1.98 |
| 08.01.01 | 1.98 |
| 09.01.01 | 2 |
| 10.01.01 | 2.03 |
| 11.01.01 | 2.03 |
| 12.01.01 | 2.035 |
| 13.01.01 | 2.042 |
| 14.01.01 | 2.042 |
| 15.01.01 | 2.042 |
| 16.01.01 | 2.04 |
| 17.01.01 | 2.03 |
| 18.01.01 | 2.02 |
| 19.01.01 | 2.01 |
| 20.01.01 | 2.01 |
| 21.01.01 | 2.01 |
| 22.01.01 | 2.01 |
| 23.01.01 | 2 |
| 24.01.01 | 2.02 |
| 25.01.01 | 2.02 |
| 26.01.01 | 2.02 |
| 27.01.01 | 2.015 |
| 28.01.01 | 2.015 |
| 29.01.01 | 2.015 |
| 30.01.01 | 2.02 |
| 31.01.01 | 2.025 |
| 01.02.01 | 2.015 |
| 02.02.01 | 2.025 |
| 03.02.01 | 2.04 |
| 04.02.01 | 2.04 |
| 05.02.01 | 2.04 |
| 06.02.01 | 2.04 |
| 07.02.01 | 2.03 |
| 08.02.01 | 2.03 |
| 09.02.01 | 2.065 |
| 10.02.01 | 2.065 |
| 11.02.01 | 2.065 |
| 12.02.01 | 2.065 |
| 13.02.01 | 2.065 |
| 14.02.01 | 2.065 |
| 15.02.01 | 2.064 |
| 16.02.01 | 2.065 |
| 17.02.01 | 2.07 |
| 18.02.01 | 2.07 |
| 19.02.01 | 2.07 |
| 20.02.01 | 2.075 |
| 21.02.01 | 2.082 |
| 22.02.01 | 2.165 |
| 23.02.01 | 2.14 |
| 24.02.01 | 2.08 |
| 25.02.01 | 2.08 |
| 26.02.01 | 2.08 |
| 27.02.01 | 2.055 |
| 28.02.01 | 2.035 |
| 01.03.01 | 2.015 |
| 02.03.01 | 2.04 |
| 03.03.01 | 2.06 |
| 04.03.01 | 2.06 |
| 05.03.01 | 2.06 |
| 06.03.01 | 2.075 |
| 07.03.01 | 2.075 |
| 08.03.01 | 2.075 |
| 09.03.01 | 2.09 |
| 10.03.01 | 2.09 |
| 11.03.01 | 2.09 |
| 12.03.01 | 2.09 |
| 13.03.01 | 2.09 |
| 14.03.01 | 2.09 |
| 15.03.01 | 2.08 |
| 16.03.01 | 2.08 |
| 17.03.01 | 2.08 |
| 18.03.01 | 2.06 |
| 19.03.01 | 2.06 |
| 20.03.01 | 2.06 |
| 21.03.01 | 2.06 |
| 22.03.01 | 2.065 |
| 23.03.01 | 2.065 |
| 24.03.01 | 2.04 |
| 25.03.01 | 2.053 |
| 26.03.01 | 2.053 |
| 27.03.01 | 2.053 |
| 28.03.01 | 2.05 |
| 29.03.01 | 2.05 |
| 30.03.01 | 2.05 |
| 31.03.01 | 2.06 |
| 01.04.01 | 2.06 |
| 02.04.01 | 2.06 |
| 03.04.01 | 2.07 |
| 04.04.01 | 2.07 |
| 05.04.01 | 2.06 |
| 06.04.01 | 2.05 |
| 07.04.01 | 2.05 |
| 08.04.01 | 2.05 |
| 09.04.01 | 2.05 |
| 10.04.01 | 2.05 |
| 11.04.01 | 2.062 |
| 12.04.01 | 2.063 |
| 13.04.01 | 2.05 |
| 14.04.01 | 2.03 |
| 15.04.01 | 2.03 |
| 16.04.01 | 2.03 |
| 17.04.01 | 2.03 |
| 18.04.01 | 2.04 |
| 19.04.01 | 2.02 |
| 20.04.01 | 2.05 |
| 21.04.01 | 2.05 |
| 22.04.01 | 2.05 |
| 23.04.01 | 2.05 |
| 24.04.01 | 2.06 |
| 25.04.01 | 2.06 |
| 26.04.01 | 2.052 |
| 27.04.01 | 2.055 |
| 28.04.01 | 2.06 |
| 29.04.01 | 2.06 |
| 30.04.01 | 2.06 |
| 01.05.01 | 2.05 |
| 02.05.01 | 2.061 |
| 03.05.01 | 2.061 |
| 04.05.01 | 2.055 |
| 05.05.01 | 2.064 |
| 06.05.01 | 2.064 |
| 07.05.01 | 2.064 |
| 08.05.01 | 2.055 |
| 09.05.01 | 2.055 |
| 10.05.01 | 2.055 |
| 11.05.01 | 2.056 |
| 12.05.01 | 2.06 |
| 13.05.01 | 2.06 |
| 14.05.01 | 2.06 |
| 15.05.01 | 2.06 |
| 16.05.01 | 2.067 |
| 17.05.01 | 2.071 |
| 18.05.01 | 2.078 |
| 19.05.01 | 2.078 |
| 20.05.01 | 2.078 |
| 21.05.01 | 2.078 |
| 22.05.01 | 2.08 |
| 23.05.01 | 2.08 |
| 24.05.01 | 2.08 |
| 25.05.01 | 2.074 |
| 26.05.01 | 2.07 |
| 27.05.01 | 2.07 |
| 28.05.01 | 2.07 |
| 29.05.01 | 2.07 |
| 30.05.01 | 2.055 |
| 31.05.01 | 2.049 |
| 01.06.01 | 2.047 |
| 02.06.01 | 2.047 |
| 03.06.01 | 2.047 |
| 04.06.01 | 2.047 |
| 05.06.01 | 2.047 |
| 06.06.01 | 2.051 |
| 07.06.01 | 2.06 |
| 08.06.01 | 2.064 |
| 09.06.01 | 2.064 |
| 10.06.01 | 2.064 |
| 11.06.01 | 2.064 |
| 12.06.01 | 2.064 |
| 13.06.01 | 2.057 |
| 14.06.01 | 2.058 |
| 15.06.01 | 2.07 |
| 16.06.01 | 2.065 |
| 17.06.01 | 2.065 |
| 18.06.01 | 2.065 |
| 19.06.01 | 2.06 |
| 20.06.01 | 2.069 |
| 21.06.01 | 2.069 |
| 22.06.01 | 2.069 |
| 23.06.01 | 2.065 |
| 24.06.01 | 2.065 |
| 25.06.01 | 2.065 |
| 26.06.01 | 2.06 |
| 27.06.01 | 2.06 |
| 28.06.01 | 2.063 |
| 29.06.01 | 2.061 |
| 30.06.01 | 2.045 |
| 01.07.01 | 2.045 |
| 02.07.01 | 2.045 |
| 03.07.01 | 2.07 |
| 04.07.01 | 2.061 |
| 05.07.01 | 2.062 |
| 06.07.01 | 2.06 |
| 07.07.01 | 2.06 |
| 08.07.01 | 2.06 |
| 09.07.01 | 2.06 |
| 10.07.01 | 2.07 |
| 11.07.01 | 2.07 |
| 12.07.01 | 2.075 |
| 13.07.01 | 2.075 |
| 14.07.01 | 2.07 |
| 15.07.01 | 2.07 |
| 16.07.01 | 2.07 |
| 17.07.01 | 2.06 |
| 18.07.01 | 2.07 |
| 19.07.01 | 2.07 |
| 20.07.01 | 2.07 |
| 21.07.01 | 2.07 |
| 22.07.01 | 2.07 |
| 23.07.01 | 2.07 |
| 24.07.01 | 2.07 |
| 25.07.01 | 2.07 |
| 26.07.01 | 2.07 |
| 27.07.01 | 2.07 |
| 28.07.01 | 2.062 |
| 29.07.01 | 2.062 |
| 30.07.01 | 2.062 |
| 31.07.01 | 2.06 |
| 01.08.01 | 2.06 |
| 02.08.01 | 2.07 |
| 03.08.01 | 2.065 |
| 04.08.01 | 2.066 |
| 05.08.01 | 2.066 |
| 06.08.01 | 2.066 |
| 07.08.01 | 2.056 |
| 08.08.01 | 2.06 |
| 09.08.01 | 2.06 |
| 10.08.01 | 2.064 |
| 11.08.01 | 2.065 |
| 12.08.01 | 2.065 |
| 13.08.01 | 2.065 |
| 14.08.01 | 2.065 |
| 15.08.01 | 2.065 |
| 16.08.01 | 2.065 |
| 17.08.01 | 2.065 |
| 18.08.01 | 2.065 |
| 19.08.01 | 2.065 |
| 20.08.01 | 2.065 |
| 21.08.01 | 2.065 |
| 22.08.01 | 2.065 |
| 23.08.01 | 2.068 |
| 24.08.01 | 2.07 |
| 25.08.01 | 2.065 |
| 26.08.01 | 2.065 |
| 27.08.01 | 2.065 |
| 28.08.01 | 2.065 |
| 29.08.01 | 2.065 |
| 30.08.01 | 2.065 |
| 31.08.01 | 2.065 |
| 01.09.01 | 2.065 |
| 02.09.01 | 2.065 |
| 03.09.01 | 2.065 |
| 04.09.01 | 2.065 |
| 05.09.01 | 2.075 |
| 06.09.01 | 2.075 |
| 07.09.01 | 2.074 |
| 08.09.01 | 2.07 |
| 09.09.01 | 2.07 |
| 10.09.01 | 2.07 |
| 11.09.01 | 2.08 |
| 12.09.01 | 2.075 |
| 13.09.01 | 2.07 |
| 14.09.01 | 2.08 |
| 15.09.01 | 2.08 |
| 16.09.01 | 2.08 |
| 17.09.01 | 2.08 |
| 18.09.01 | 2.08 |
| 19.09.01 | 2.081 |
| 20.09.01 | 2.09 |
| 21.09.01 | 2.08 |
| 22.09.01 | 2.08 |
| 23.09.01 | 2.08 |
| 24.09.01 | 2.08 |
| 25.09.01 | 2.08 |
| 26.09.01 | 2.076 |
| 27.09.01 | 2.066 |
| 28.09.01 | 2.065 |
| 29.09.01 | 2.061 |
| 30.09.01 | 2.061 |
| 01.10.01 | 2.061 |
| 02.10.01 | 2.078 |
| 03.10.01 | 2.072 |
| 04.10.01 | 2.065 |
| 05.10.01 | 2.07 |
| 06.10.01 | 2.071 |
| 07.10.01 | 2.071 |
| 08.10.01 | 2.071 |
| 09.10.01 | 2.071 |
| 10.10.01 | 2.085 |
| 11.10.01 | 2.085 |
| 12.10.01 | 2.085 |
| 13.10.01 | 2.085 |
| 14.10.01 | 2.085 |
| 15.10.01 | 2.085 |
| 16.10.01 | 2.08 |
| 17.10.01 | 2.08 |
| 18.10.01 | 2.08 |
| 19.10.01 | 2.082 |
| 20.10.01 | 2.085 |
| 21.10.01 | 2.085 |
| 22.10.01 | 2.085 |
| 23.10.01 | 2.087 |
| 24.10.01 | 2.087 |
| 25.10.01 | 2.09 |
| 26.10.01 | 2.09 |
| 27.10.01 | 2.085 |
| 28.10.01 | 2.085 |
| 29.10.01 | 2.085 |
| 30.10.01 | 2.085 |
| 31.10.01 | 2.085 |
| 01.11.01 | 2.085 |
| 02.11.01 | 2.085 |
| 03.11.01 | 2.095 |
| 04.11.01 | 2.095 |
| 05.11.01 | 2.095 |
| 06.11.01 | 2.092 |
| 07.11.01 | 2.1 |
| 08.11.01 | 2.108 |
| 09.11.01 | 2.135 |
| 10.11.01 | 2.145 |
| 11.11.01 | 2.145 |
| 12.11.01 | 2.145 |
| 13.11.01 | 2.135 |
| 14.11.01 | 2.136 |
| 15.11.01 | 2.131 |
| 16.11.01 | 2.14 |
| 17.11.01 | 2.131 |
| 18.11.01 | 2.131 |
| 19.11.01 | 2.131 |
| 20.11.01 | 2.151 |
| 21.11.01 | 2.151 |
| 22.11.01 | 2.167 |
| 23.11.01 | 2.165 |
| 24.11.01 | 2.165 |
| 25.11.01 | 2.165 |
| 26.11.01 | 2.165 |
| 27.11.01 | 2.15 |
| 28.11.01 | 2.125 |
| 29.11.01 | 2.125 |
| 30.11.01 | 2.125 |
| 01.12.01 | 2.14 |
| 02.12.01 | 2.14 |
| 03.12.01 | 2.14 |
| 04.12.01 | 2.14 |
| 05.12.01 | 2.165 |
| 06.12.01 | 2.162 |
| 07.12.01 | 2.17 |
| 08.12.01 | 2.17 |
| 09.12.01 | 2.17 |
| 10.12.01 | 2.17 |
| 11.12.01 | 2.17 |
| 12.12.01 | 2.17 |
| 13.12.01 | 2.175 |
| 14.12.01 | 2.18 |
| 15.12.01 | 2.18 |
| 16.12.01 | 2.18 |
| 17.12.01 | 2.18 |
| 18.12.01 | 2.18 |
| 19.12.01 | 2.167 |
| 20.12.01 | 2.155 |
| 21.12.01 | 2.13 |
| 22.12.01 | 2.11 |
| 23.12.01 | 2.11 |
| 24.12.01 | 2.11 |
| 25.12.01 | 2.085 |
| 26.12.01 | 2.07 |
| 27.12.01 | 2.07 |
| 28.12.01 | 2.07 |
| 29.12.01 | 2.06 |
| 30.12.01 | 2.06 |
| 31.12.01 | 2.06 |
| 01.01.02 | 2.06 |
| 02.01.02 | 2.06 |
| 03.01.02 | 2.06 |
| 04.01.02 | 2.06 |
| 05.01.02 | 2.165 |
| 06.01.02 | 2.165 |
| 07.01.02 | 2.165 |
| 08.01.02 | 2.165 |
| 09.01.02 | 2.215 |
| 10.01.02 | 2.225 |
| 11.01.02 | 2.205 |
| 12.01.02 | 2.195 |
| 13.01.02 | 2.195 |
| 14.01.02 | 2.195 |
| 15.01.02 | 2.19 |
| 16.01.02 | 2.18 |
| 17.01.02 | 2.179 |
| 18.01.02 | 2.176 |
| 19.01.02 | 2.18 |
| 20.01.02 | 2.18 |
| 21.01.02 | 2.18 |
| 22.01.02 | 2.18 |
| 23.01.02 | 2.18 |
| 24.01.02 | 2.19 |
| 25.01.02 | 2.2 |
| 26.01.02 | 2.2 |
| 27.01.02 | 2.2 |
| 28.01.02 | 2.2 |
| 29.01.02 | 2.19 |
| 30.01.02 | 2.18 |
| 31.01.02 | 2.197 |
| 01.02.02 | 2.197 |
| 02.02.02 | 2.197 |
| 03.02.02 | 2.197 |
| 04.02.02 | 2.197 |
| 05.02.02 | 2.2 |
| 06.02.02 | 2.2 |
| 07.02.02 | 2.21 |
| 08.02.02 | 2.23 |
| 09.02.02 | 2.23 |
| 10.02.02 | 2.23 |
| 11.02.02 | 2.23 |
| 12.02.02 | 2.215 |
| 13.02.02 | 2.215 |
| 14.02.02 | 2.215 |
| 15.02.02 | 2.22 |
| 16.02.02 | 2.22 |
| 17.02.02 | 2.22 |
| 18.02.02 | 2.22 |
| 19.02.02 | 2.22 |
| 20.02.02 | 2.22 |
| 21.02.02 | 2.22 |
| 22.02.02 | 2.224 |
| 23.02.02 | 2.224 |
| 24.02.02 | 2.224 |
| 25.02.02 | 2.224 |
| 26.02.02 | 2.224 |
| 27.02.02 | 2.205 |
| 28.02.02 | 2.21 |
| 01.03.02 | 2.206 |
| 02.03.02 | 2.225 |
| 03.03.02 | 2.225 |
| 04.03.02 | 2.225 |
| 05.03.02 | 2.23 |
| 06.03.02 | 2.229 |
| 07.03.02 | 2.229 |
| 08.03.02 | 2.235 |
| 09.03.02 | 2.235 |
| 10.03.02 | 2.235 |
| 11.03.02 | 2.235 |
| 12.03.02 | 2.235 |
| 13.03.02 | 2.235 |
| 14.03.02 | 2.235 |
| 15.03.02 | 2.235 |
| 16.03.02 | 2.235 |
| 17.03.02 | 2.235 |
| 18.03.02 | 2.235 |
| 19.03.02 | 2.235 |
| 20.03.02 | 2.235 |
| 21.03.02 | 2.235 |
| 22.03.02 | 2.235 |
| 23.03.02 | 2.235 |
| 24.03.02 | 2.235 |
| 25.03.02 | 2.235 |
| 26.03.02 | 2.233 |
| 27.03.02 | 2.215 |
| 28.03.02 | 2.215 |
| 29.03.02 | 2.215 |
| 30.03.02 | 2.215 |
| 31.03.02 | 2.215 |
| 01.04.02 | 2.215 |
| 02.04.02 | 2.23 |
| 03.04.02 | 2.22 |
| 04.04.02 | 2.22 |
| 05.04.02 | 2.225 |
| 06.04.02 | 2.225 |
| 07.04.02 | 2.225 |
| 08.04.02 | 2.225 |
| 09.04.02 | 2.215 |
| 10.04.02 | 2.215 |
| 11.04.02 | 2.215 |
| 12.04.02 | 2.23 |
| 13.04.02 | 2.23 |
| 14.04.02 | 2.23 |
| 15.04.02 | 2.23 |
| 16.04.02 | 2.235 |
| 17.04.02 | 2.235 |
| 18.04.02 | 2.24 |
| 19.04.02 | 2.24 |
| 20.04.02 | 2.24 |
| 21.04.02 | 2.24 |
| 22.04.02 | 2.24 |
| 23.04.02 | 2.24 |
| 24.04.02 | 2.24 |
| 25.04.02 | 2.24 |
| 26.04.02 | 2.235 |
| 27.04.02 | 2.235 |
| 28.04.02 | 2.235 |
| 29.04.02 | 2.235 |
| 30.04.02 | 2.235 |
| 01.05.02 | 2.215 |
| 02.05.02 | 2.215 |
| 03.05.02 | 2.215 |
| 04.05.02 | 2.205 |
| 05.05.02 | 2.205 |
| 06.05.02 | 2.205 |
| 07.05.02 | 2.205 |
| 08.05.02 | 2.205 |
| 09.05.02 | 2.22 |
| 10.05.02 | 2.22 |
| 11.05.02 | 2.22 |
| 12.05.02 | 2.22 |
| 13.05.02 | 2.22 |
| 14.05.02 | 2.22 |
| 15.05.02 | 2.22 |
| 16.05.02 | 2.205 |
| 17.05.02 | 2.205 |
| 18.05.02 | 2.207 |
| 19.05.02 | 2.207 |
| 20.05.02 | 2.207 |
| 21.05.02 | 2.215 |
| 22.05.02 | 2.225 |
| 23.05.02 | 2.22 |
| 24.05.02 | 2.215 |
| 25.05.02 | 2.215 |
| 26.05.02 | 2.215 |
| 27.05.02 | 2.215 |
| 28.05.02 | 2.215 |
| 29.05.02 | 2.21 |
| 30.05.02 | 2.21 |
| 31.05.02 | 2.215 |
| 01.06.02 | 2.216 |
| 02.06.02 | 2.216 |
| 03.06.02 | 2.216 |
| 04.06.02 | 2.22 |
| 05.06.02 | 2.22 |
| 06.06.02 | 2.22 |
| 07.06.02 | 2.22 |
| 08.06.02 | 2.22 |
| 09.06.02 | 2.22 |
| 10.06.02 | 2.22 |
| 11.06.02 | 2.22 |
| 12.06.02 | 2.22 |
| 13.06.02 | 2.22 |
| 14.06.02 | 2.22 |
| 15.06.02 | 2.22 |
| 16.06.02 | 2.22 |
| 17.06.02 | 2.22 |
| 18.06.02 | 2.22 |
| 19.06.02 | 2.22 |
| 20.06.02 | 2.22 |
| 21.06.02 | 2.215 |
| 22.06.02 | 2.218 |
| 23.06.02 | 2.218 |
| 24.06.02 | 2.218 |
| 25.06.02 | 2.218 |
| 26.06.02 | 2.218 |
| 27.06.02 | 2.215 |
| 28.06.02 | 2.2 |
| 29.06.02 | 2.19 |
| 30.06.02 | 2.19 |
| 01.07.02 | 2.19 |
| 02.07.02 | 2.205 |
| 03.07.02 | 2.2 |
| 04.07.02 | 2.2 |
| 05.07.02 | 2.2 |
| 06.07.02 | 2.215 |
| 07.07.02 | 2.215 |
| 08.07.02 | 2.215 |
| 09.07.02 | 2.215 |
| 10.07.02 | 2.215 |
| 11.07.02 | 2.215 |
| 12.07.02 | 2.215 |
| 13.07.02 | 2.215 |
| 14.07.02 | 2.215 |
| 15.07.02 | 2.215 |
| 16.07.02 | 2.21 |
| 17.07.02 | 2.19 |
| 18.07.02 | 2.195 |
| 19.07.02 | 2.205 |
| 20.07.02 | 2.2 |
| 21.07.02 | 2.2 |
| 22.07.02 | 2.2 |
| 23.07.02 | 2.195 |
| 24.07.02 | 2.195 |
| 25.07.02 | 2.195 |
| 26.07.02 | 2.2 |
| 27.07.02 | 2.2 |
| 28.07.02 | 2.2 |
| 29.07.02 | 2.2 |
| 30.07.02 | 2.195 |
| 31.07.02 | 2.185 |
| 01.08.02 | 2.185 |
| 02.08.02 | 2.19 |
| 03.08.02 | 2.19 |
| 04.08.02 | 2.19 |
| 05.08.02 | 2.19 |
| 06.08.02 | 2.19 |
| 07.08.02 | 2.18 |
| 08.08.02 | 2.18 |
| 09.08.02 | 2.18 |
| 10.08.02 | 2.18 |
| 11.08.02 | 2.18 |
| 12.08.02 | 2.18 |
| 13.08.02 | 2.18 |
| 14.08.02 | 2.175 |
| 15.08.02 | 2.175 |
| 16.08.02 | 2.176 |
| 17.08.02 | 2.176 |
| 18.08.02 | 2.176 |
| 19.08.02 | 2.176 |
| 20.08.02 | 2.177 |
| 21.08.02 | 2.175 |
| 22.08.02 | 2.18 |
| 23.08.02 | 2.185 |
| 24.08.02 | 2.195 |
| 25.08.02 | 2.195 |
| 26.08.02 | 2.195 |
| 27.08.02 | 2.195 |
| 28.08.02 | 2.19 |
| 29.08.02 | 2.19 |
| 30.08.02 | 2.18 |
| 31.08.02 | 2.165 |
| 01.09.02 | 2.165 |
| 02.09.02 | 2.165 |
| 03.09.02 | 2.175 |
| 04.09.02 | 2.175 |
| 05.09.02 | 2.175 |
| 06.09.02 | 2.18 |
| 07.09.02 | 2.18 |
| 08.09.02 | 2.18 |
| 09.09.02 | 2.18 |
| 10.09.02 | 2.18 |
| 11.09.02 | 2.185 |
| 12.09.02 | 2.19 |
| 13.09.02 | 2.183 |
| 14.09.02 | 2.185 |
| 15.09.02 | 2.185 |
| 16.09.02 | 2.185 |
| 17.09.02 | 2.185 |
| 18.09.02 | 2.18 |
| 19.09.02 | 2.175 |
| 20.09.02 | 2.18 |
| 21.09.02 | 2.18 |
| 22.09.02 | 2.18 |
| 23.09.02 | 2.18 |
| 24.09.02 | 2.18 |
| 25.09.02 | 2.18 |
| 26.09.02 | 2.18 |
| 27.09.02 | 2.177 |
| 28.09.02 | 2.175 |
| 29.09.02 | 2.175 |
| 30.09.02 | 2.175 |
| 01.10.02 | 2.17 |
| 02.10.02 | 2.16 |
| 03.10.02 | 2.16 |
| 04.10.02 | 2.16 |
| 05.10.02 | 2.155 |
| 06.10.02 | 2.155 |
| 07.10.02 | 2.155 |
| 08.10.02 | 2.15 |
| 09.10.02 | 2.15 |
| 10.10.02 | 2.155 |
| 11.10.02 | 2.16 |
| 12.10.02 | 2.167 |
| 13.10.02 | 2.167 |
| 14.10.02 | 2.167 |
| 15.10.02 | 2.167 |
| 16.10.02 | 2.167 |
| 17.10.02 | 2.167 |
| 18.10.02 | 2.175 |
| 19.10.02 | 2.175 |
| 20.10.02 | 2.175 |
| 21.10.02 | 2.175 |
| 22.10.02 | 2.175 |
| 23.10.02 | 2.175 |
| 24.10.02 | 2.175 |
| 25.10.02 | 2.173 |
| 26.10.02 | 2.165 |
| 27.10.02 | 2.165 |
| 28.10.02 | 2.165 |
| 29.10.02 | 2.165 |
| 30.10.02 | 2.16 |
| 31.10.02 | 2.165 |
| 01.11.02 | 2.167 |
| 02.11.02 | 2.165 |
| 03.11.02 | 2.165 |
| 04.11.02 | 2.165 |
| 05.11.02 | 2.171 |
| 06.11.02 | 2.175 |
| 07.11.02 | 2.19 |
| 08.11.02 | 2.195 |
| 09.11.02 | 2.195 |
| 10.11.02 | 2.195 |
| 11.11.02 | 2.195 |
| 12.11.02 | 2.18 |
| 13.11.02 | 2.185 |
| 14.11.02 | 2.19 |
| 15.11.02 | 2.19 |
| 16.11.02 | 2.19 |
| 17.11.02 | 2.19 |
| 18.11.02 | 2.19 |
| 19.11.02 | 2.18 |
| 20.11.02 | 2.185 |
| 21.11.02 | 2.185 |
| 22.11.02 | 2.185 |
| 23.11.02 | 2.185 |
| 24.11.02 | 2.185 |
| 25.11.02 | 2.185 |
| 26.11.02 | 2.175 |
| 27.11.02 | 2.175 |
| 28.11.02 | 2.17 |
| 29.11.02 | 2.173 |
| 30.11.02 | 2.165 |
| 01.12.02 | 2.165 |
| 02.12.02 | 2.165 |
| 03.12.02 | 2.16 |
| 04.12.02 | 2.17 |
| 05.12.02 | 2.165 |
| 06.12.02 | 2.165 |
| 07.12.02 | 2.165 |
| 08.12.02 | 2.165 |
| 09.12.02 | 2.165 |
| 10.12.02 | 2.16 |
| 11.12.02 | 2.17 |
| 12.12.02 | 2.165 |
| 13.12.02 | 2.16 |
| 14.12.02 | 2.16 |
| 15.12.02 | 2.16 |
| 16.12.02 | 2.16 |
| 17.12.02 | 2.155 |
| 18.12.02 | 2.15 |
| 19.12.02 | 2.151 |
| 20.12.02 | 2.151 |
| 21.12.02 | 2.14 |
| 22.12.02 | 2.14 |
| 23.12.02 | 2.14 |
| 24.12.02 | 2.125 |
| 25.12.02 | 2.11 |
| 26.12.02 | 2.1 |
| 27.12.02 | 2.1 |
| 28.12.02 | 2.112 |
| 29.12.02 | 2.112 |
| 30.12.02 | 2.112 |
| 31.12.02 | 2.09 |
| 01.01.03 | 2.18 |
| 02.01.03 | 2.18 |
| 03.01.03 | 2.18 |
| 04.01.03 | 2.18 |
| 05.01.03 | 2.18 |
| 06.01.03 | 2.18 |
| 07.01.03 | 2.185 |
| 08.01.03 | 2.185 |
| 09.01.03 | 2.205 |
| 10.01.03 | 2.21 |
| 11.01.03 | 2.209 |
| 12.01.03 | 2.209 |
| 13.01.03 | 2.209 |
| 14.01.03 | 2.2 |
| 15.01.03 | 2.18 |
| 16.01.03 | 2.18 |
| 17.01.03 | 2.185 |
| 18.01.03 | 2.19 |
| 19.01.03 | 2.19 |
| 20.01.03 | 2.19 |
| 21.01.03 | 2.19 |
| 22.01.03 | 2.185 |
| 23.01.03 | 2.186 |
| 24.01.03 | 2.187 |
| 25.01.03 | 2.187 |
| 26.01.03 | 2.187 |
| 27.01.03 | 2.187 |
| 28.01.03 | 2.187 |
| 29.01.03 | 2.176 |
| 30.01.03 | 2.18 |
| 31.01.03 | 2.185 |
| 01.02.03 | 2.185 |
| 02.02.03 | 2.185 |
| 03.02.03 | 2.185 |
| 04.02.03 | 2.187 |
| 05.02.03 | 2.185 |
| 06.02.03 | 2.187 |
| 07.02.03 | 2.19 |
| 08.02.03 | 2.195 |
| 09.02.03 | 2.195 |
| 10.02.03 | 2.195 |
| 11.02.03 | 2.19 |
| 12.02.03 | 2.185 |
| 13.02.03 | 2.185 |
| 14.02.03 | 2.19 |
| 15.02.03 | 2.187 |
| 16.02.03 | 2.187 |
| 17.02.03 | 2.187 |
| 18.02.03 | 2.181 |
| 19.02.03 | 2.18 |
| 20.02.03 | 2.18 |
| 21.02.03 | 2.185 |
| 22.02.03 | 2.19 |
| 23.02.03 | 2.19 |
| 24.02.03 | 2.19 |
| 25.02.03 | 2.183 |
| 26.02.03 | 2.183 |
| 27.02.03 | 2.17 |
| 28.02.03 | 2.175 |
| 01.03.03 | 2.145 |
| 02.03.03 | 2.145 |
| 03.03.03 | 2.145 |
| 04.03.03 | 2.145 |
| 05.03.03 | 2.144 |
| 06.03.03 | 2.15 |
| 07.03.03 | 2.16 |
| 08.03.03 | 2.169 |
| 09.03.03 | 2.169 |
| 10.03.03 | 2.169 |
| 11.03.03 | 2.165 |
| 12.03.03 | 2.165 |
| 13.03.03 | 2.17 |
| 14.03.03 | 2.165 |
| 15.03.03 | 2.16 |
| 16.03.03 | 2.16 |
| 17.03.03 | 2.16 |
| 18.03.03 | 2.15 |
| 19.03.03 | 2.145 |
| 20.03.03 | 2.14 |
| 21.03.03 | 2.14 |
| 22.03.03 | 2.14 |
| 23.03.03 | 2.14 |
| 24.03.03 | 2.14 |
| 25.03.03 | 2.14 |
| 26.03.03 | 2.135 |
| 27.03.03 | 2.135 |
| 28.03.03 | 2.13 |
| 29.03.03 | 2.125 |
| 30.03.03 | 2.125 |
| 31.03.03 | 2.125 |
| 01.04.03 | 2.12 |
| 02.04.03 | 2.135 |
| 03.04.03 | 2.155 |
| 04.04.03 | 2.18 |
| 05.04.03 | 2.18 |
| 06.04.03 | 2.18 |
| 07.04.03 | 2.18 |
| 08.04.03 | 2.17 |
| 09.04.03 | 2.17 |
| 10.04.03 | 2.17 |
| 11.04.03 | 2.169 |
| 12.04.03 | 2.166 |
| 13.04.03 | 2.166 |
| 14.04.03 | 2.166 |
| 15.04.03 | 2.165 |
| 16.04.03 | 2.165 |
| 17.04.03 | 2.171 |
| 18.04.03 | 2.166 |
| 19.04.03 | 2.166 |
| 20.04.03 | 2.166 |
| 21.04.03 | 2.166 |
| 22.04.03 | 2.166 |
| 23.04.03 | 2.155 |
| 24.04.03 | 2.15 |
| 25.04.03 | 2.145 |
| 26.04.03 | 2.145 |
| 27.04.03 | 2.145 |
| 28.04.03 | 2.145 |
| 29.04.03 | 2.145 |
| 30.04.03 | 2.145 |
| 01.05.03 | 2.135 |
| 02.05.03 | 2.16 |
| 03.05.03 | 2.165 |
| 04.05.03 | 2.165 |
| 05.05.03 | 2.165 |
| 06.05.03 | 2.165 |
| 07.05.03 | 2.16 |
| 08.05.03 | 2.155 |
| 09.05.03 | 2.155 |
| 10.05.03 | 2.155 |
| 11.05.03 | 2.155 |
| 12.05.03 | 2.155 |
| 13.05.03 | 2.155 |
| 14.05.03 | 2.16 |
| 15.05.03 | 2.155 |
| 16.05.03 | 2.155 |
| 17.05.03 | 2.155 |
| 18.05.03 | 2.155 |
| 19.05.03 | 2.155 |
| 20.05.03 | 2.155 |
| 21.05.03 | 2.155 |
| 22.05.03 | 2.152 |
| 23.05.03 | 2.152 |
| 24.05.03 | 2.148 |
| 25.05.03 | 2.148 |
| 26.05.03 | 2.148 |
| 27.05.03 | 2.148 |
| 28.05.03 | 2.145 |
| 29.05.03 | 2.145 |
| 30.05.03 | 2.15 |
| 31.05.03 | 2.148 |
| 01.06.03 | 2.148 |
| 02.06.03 | 2.148 |
| 03.06.03 | 2.152 |
| 04.06.03 | 2.152 |
| 05.06.03 | 2.155 |
| 06.06.03 | 2.155 |
| 07.06.03 | 2.155 |
| 08.06.03 | 2.155 |
| 09.06.03 | 2.155 |
| 10.06.03 | 2.155 |
| 11.06.03 | 2.155 |
| 12.06.03 | 2.155 |
| 13.06.03 | 2.155 |
| 14.06.03 | 2.155 |
| 15.06.03 | 2.155 |
| 16.06.03 | 2.155 |
| 17.06.03 | 2.15 |
| 18.06.03 | 2.148 |
| 19.06.03 | 2.148 |
| 20.06.03 | 2.15 |
| 21.06.03 | 2.15 |
| 22.06.03 | 2.15 |
| 23.06.03 | 2.15 |
| 24.06.03 | 2.15 |
| 25.06.03 | 2.15 |
| 26.06.03 | 2.14 |
| 27.06.03 | 2.12 |
| 28.06.03 | 2.11 |
| 29.06.03 | 2.11 |
| 30.06.03 | 2.11 |
| 01.07.03 | 2.11 |
| 02.07.03 | 2.122 |
| 03.07.03 | 2.142 |
| 04.07.03 | 2.138 |
| 05.07.03 | 2.138 |
| 06.07.03 | 2.138 |
| 07.07.03 | 2.138 |
| 08.07.03 | 2.132 |
| 09.07.03 | 2.128 |
| 10.07.03 | 2.13 |
| 11.07.03 | 2.137 |
| 12.07.03 | 2.14 |
| 13.07.03 | 2.14 |
| 14.07.03 | 2.14 |
| 15.07.03 | 2.14 |
| 16.07.03 | 2.14 |
| 17.07.03 | 2.14 |
| 18.07.03 | 2.145 |
| 19.07.03 | 2.145 |
| 20.07.03 | 2.145 |
| 21.07.03 | 2.145 |
| 22.07.03 | 2.14 |
| 23.07.03 | 2.14 |
| 24.07.03 | 2.14 |
| 25.07.03 | 2.14 |
| 26.07.03 | 2.125 |
| 27.07.03 | 2.125 |
| 28.07.03 | 2.125 |
| 29.07.03 | 2.12 |
| 30.07.03 | 2.12 |
| 31.07.03 | 2.121 |
| 01.08.03 | 2.13 |
| 02.08.03 | 2.138 |
| 03.08.03 | 2.138 |
| 04.08.03 | 2.138 |
| 05.08.03 | 2.138 |
| 06.08.03 | 2.135 |
| 07.08.03 | 2.125 |
| 08.08.03 | 2.125 |
| 09.08.03 | 2.12 |
| 10.08.03 | 2.12 |
| 11.08.03 | 2.12 |
| 12.08.03 | 2.11 |
| 13.08.03 | 2.11 |
| 14.08.03 | 2.102 |
| 15.08.03 | 2.11 |
| 16.08.03 | 2.11 |
| 17.08.03 | 2.11 |
| 18.08.03 | 2.11 |
| 19.08.03 | 2.115 |
| 20.08.03 | 2.128 |
| 21.08.03 | 2.135 |
| 22.08.03 | 2.135 |
| 23.08.03 | 2.132 |
| 24.08.03 | 2.132 |
| 25.08.03 | 2.132 |
| 26.08.03 | 2.122 |
| 27.08.03 | 2.12 |
| 28.08.03 | 2.118 |
| 29.08.03 | 2.118 |
| 30.08.03 | 2.112 |
| 31.08.03 | 2.112 |
| 01.09.03 | 2.112 |
| 02.09.03 | 2.115 |
| 03.09.03 | 2.13 |
| 04.09.03 | 2.134 |
| 05.09.03 | 2.134 |
| 06.09.03 | 2.13 |
| 07.09.03 | 2.13 |
| 08.09.03 | 2.13 |
| 09.09.03 | 2.128 |
| 10.09.03 | 2.135 |
| 11.09.03 | 2.135 |
| 12.09.03 | 2.142 |
| 13.09.03 | 2.143 |
| 14.09.03 | 2.143 |
| 15.09.03 | 2.143 |
| 16.09.03 | 2.138 |
| 17.09.03 | 2.138 |
| 18.09.03 | 2.138 |
| 19.09.03 | 2.13 |
| 20.09.03 | 2.125 |
| 21.09.03 | 2.125 |
| 22.09.03 | 2.125 |
| 23.09.03 | 2.12 |
| 24.09.03 | 2.11 |
| 25.09.03 | 2.114 |
| 26.09.03 | 2.114 |
| 27.09.03 | 2.114 |
| 28.09.03 | 2.114 |
| 29.09.03 | 2.114 |
| 30.09.03 | 2.113 |
| 01.10.03 | 2.113 |
| 02.10.03 | 2.113 |
| 03.10.03 | 2.113 |
| 04.10.03 | 2.113 |
| 05.10.03 | 2.113 |
| 06.10.03 | 2.113 |
| 07.10.03 | 2.11 |
| 08.10.03 | 2.11 |
| 09.10.03 | 2.102 |
| 10.10.03 | 2.1 |
| 11.10.03 | 2.1 |
| 12.10.03 | 2.1 |
| 13.10.03 | 2.1 |
| 14.10.03 | 2.092 |
| 15.10.03 | 2.092 |
| 16.10.03 | 2.092 |
| 17.10.03 | 2.09 |
| 18.10.03 | 2.085 |
| 19.10.03 | 2.085 |
| 20.10.03 | 2.085 |
| 21.10.03 | 2.086 |
| 22.10.03 | 2.086 |
| 23.10.03 | 2.089 |
| 24.10.03 | 2.089 |
| 25.10.03 | 2.092 |
| 26.10.03 | 2.092 |
| 27.10.03 | 2.092 |
| 28.10.03 | 2.095 |
| 29.10.03 | 2.102 |
| 30.10.03 | 2.102 |
| 31.10.03 | 2.107 |
| 01.11.03 | 2.104 |
| 02.11.03 | 2.104 |
| 03.11.03 | 2.104 |
| 04.11.03 | 2.104 |
| 05.11.03 | 2.112 |
| 06.11.03 | 2.112 |
| 07.11.03 | 2.12 |
| 08.11.03 | 2.12 |
| 09.11.03 | 2.12 |
| 10.11.03 | 2.12 |
| 11.11.03 | 2.125 |
| 12.11.03 | 2.135 |
| 13.11.03 | 2.175 |
| 14.11.03 | 2.228 |
| 15.11.03 | 2.21 |
| 16.11.03 | 2.21 |
| 17.11.03 | 2.21 |
| 18.11.03 | 2.19 |
| 19.11.03 | 2.19 |
| 20.11.03 | 2.205 |
| 21.11.03 | 2.205 |
| 22.11.03 | 2.22 |
| 23.11.03 | 2.22 |
| 24.11.03 | 2.22 |
| 25.11.03 | 2.21 |
| 26.11.03 | 2.17 |
| 27.11.03 | 2.158 |
| 28.11.03 | 2.165 |
| 29.11.03 | 2.19 |
| 30.11.03 | 2.19 |
| 01.12.03 | 2.19 |
| 02.12.03 | 2.16 |
| 03.12.03 | 2.17 |
| 04.12.03 | 2.18 |
| 05.12.03 | 2.18 |
| 06.12.03 | 2.177 |
| 07.12.03 | 2.177 |
| 08.12.03 | 2.177 |
| 09.12.03 | 2.16 |
| 10.12.03 | 2.16 |
| 11.12.03 | 2.16 |
| 12.12.03 | 2.158 |
| 13.12.03 | 2.145 |
| 14.12.03 | 2.145 |
| 15.12.03 | 2.145 |
| 16.12.03 | 2.09 |
| 17.12.03 | 2.09 |
| 18.12.03 | 2.09 |
| 19.12.03 | 2.09 |
| 20.12.03 | 2.09 |
| 21.12.03 | 2.09 |
| 22.12.03 | 2.09 |
| 23.12.03 | 2.082 |
| 24.12.03 | 2.082 |
| 25.12.03 | 2.047 |
| 26.12.03 | 2.045 |
| 27.12.03 | 2.05 |
| 28.12.03 | 2.05 |
| 29.12.03 | 2.05 |
| 30.12.03 | 2.105 |
| 31.12.03 | 2.075 |
| 01.01.04 | 2.11 |
| 02.01.04 | 2.11 |
| 03.01.04 | 2.11 |
| 04.01.04 | 2.11 |
| 05.01.04 | 2.11 |
| 06.01.04 | 2.11 |
| 07.01.04 | 2.11 |
| 08.01.04 | 2.1 |
| 09.01.04 | 2.1 |
| 10.01.04 | 2.12 |
| 11.01.04 | 2.12 |
| 12.01.04 | 2.12 |
| 13.01.04 | 2.12 |
| 14.01.04 | 2.13 |
| 15.01.04 | 2.13 |
| 16.01.04 | 2.14 |
| 17.01.04 | 2.14 |
| 18.01.04 | 2.135 |
| 19.01.04 | 2.135 |
| 20.01.04 | 2.135 |
| 21.01.04 | 2.135 |
| 22.01.04 | 2.13 |
| 23.01.04 | 2.13 |
| 24.01.04 | 2.125 |
| 25.01.04 | 2.13 |
| 26.01.04 | 2.13 |
| 27.01.04 | 2.13 |
| 28.01.04 | 2.13 |
| 29.01.04 | 2.1 |
| 30.01.04 | 2.105 |
| 31.01.04 | 2.105 |
| 01.02.04 | 2.11 |
| 02.02.04 | 2.11 |
| 03.02.04 | 2.11 |
| 04.02.04 | 2.115 |
| 05.02.04 | 2.1 |
| 06.02.04 | 2.098 |
| 07.02.04 | 2.078 |
| 08.02.04 | 2.078 |
| 09.02.04 | 2.078 |
| 10.02.04 | 2.078 |
| 11.02.04 | 2.07 |
| 12.02.04 | 2.06 |
| 13.02.04 | 2.062 |
| 14.02.04 | 2.06 |
| 15.02.04 | 2.06 |
| 16.02.04 | 2.06 |
| 17.02.04 | 2.06 |
| 18.02.04 | 2.06 |
| 19.02.04 | 2.06 |
| 20.02.04 | 2.045 |
| 21.02.04 | 2.045 |
| 22.02.04 | 2.045 |
| 23.02.04 | 2.045 |
| 24.02.04 | 2.045 |
| 25.02.04 | 2.046 |
| 26.02.04 | 2.045 |
| 27.02.04 | 2.045 |
| 28.02.04 | 2.035 |
| 29.02.04 | 2.027 |
| 01.03.04 | 2.027 |
| 02.03.04 | 2.027 |
| 03.03.04 | 2.02 |
| 04.03.04 | 1.98 |
| 05.03.04 | 1.95 |
| 06.03.04 | 1.9 |
| 07.03.04 | 1.9 |
| 08.03.04 | 1.9 |
| 09.03.04 | 1.9 |
| 10.03.04 | 1.9 |
| 11.03.04 | 1.95 |
| 12.03.04 | 2.03 |
| 13.03.04 | 2.07 |
| 14.03.04 | 2.07 |
| 15.03.04 | 2.07 |
| 16.03.04 | 2.04 |
| 17.03.04 | 2.04 |
| 18.03.04 | 2.03 |
| 19.03.04 | 2 |
| 20.03.04 | 2 |
| 21.03.04 | 2 |
| 22.03.04 | 2 |
| 23.03.04 | 2 |
| 24.03.04 | 2 |
| 25.03.04 | 2 |
| 26.03.04 | 2 |
| 27.03.04 | 2 |
| 28.03.04 | 2 |
| 29.03.04 | 2 |
| 30.03.04 | 2.005 |
| 31.03.04 | 2.005 |
| 01.04.04 | 2.015 |
| 02.04.04 | 2.018 |
| 03.04.04 | 2 |
| 04.04.04 | 2 |
| 05.04.04 | 2 |
| 06.04.04 | 2 |
| 07.04.04 | 2 |
| 08.04.04 | 2 |
| 09.04.04 | 2 |
| 10.04.04 | 2 |
| 11.04.04 | 2 |
| 12.04.04 | 2 |
| 13.04.04 | 2 |
| 14.04.04 | 1.98 |
| 15.04.04 | 1.985 |
| 16.04.04 | 1.985 |
| 17.04.04 | 1.985 |
| 18.04.04 | 1.985 |
| 19.04.04 | 1.985 |
| 20.04.04 | 1.975 |
| 21.04.04 | 1.975 |
| 22.04.04 | 1.975 |
| 23.04.04 | 1.985 |
| 24.04.04 | 1.985 |
| 25.04.04 | 1.985 |
| 26.04.04 | 1.985 |
| 27.04.04 | 1.975 |
| 28.04.04 | 1.975 |
| 29.04.04 | 1.975 |
| 30.04.04 | 1.99 |
| 01.05.04 | 1.98 |
| 02.05.04 | 1.98 |
| 03.05.04 | 1.98 |
| 04.05.04 | 1.97 |
| 05.05.04 | 1.96 |
| 06.05.04 | 1.96 |
| 07.05.04 | 1.96 |
| 08.05.04 | 1.96 |
| 09.05.04 | 1.96 |
| 10.05.04 | 1.96 |
| 11.05.04 | 1.95 |
| 12.05.04 | 1.95 |
| 13.05.04 | 1.95 |
| 14.05.04 | 1.95 |
| 15.05.04 | 1.94 |
| 16.05.04 | 1.94 |
| 17.05.04 | 1.94 |
| 18.05.04 | 1.93 |
| 19.05.04 | 1.92 |
| 20.05.04 | 1.92 |
| 21.05.04 | 1.92 |
| 22.05.04 | 1.92 |
| 23.05.04 | 1.92 |
| 24.05.04 | 1.92 |
| 25.05.04 | 1.92 |
| 26.05.04 | 1.92 |
| 27.05.04 | 1.92 |
| 28.05.04 | 1.92 |
| 29.05.04 | 1.92 |
| 30.05.04 | 1.92 |
| 31.05.04 | 1.92 |
| 01.06.04 | 1.92 |
| 02.06.04 | 1.92 |
| 03.06.04 | 1.92 |
| 04.06.04 | 1.92 |
| 05.06.04 | 1.92 |
| 06.06.04 | 1.92 |
| 07.06.04 | 1.92 |
| 08.06.04 | 1.92 |
| 09.06.04 | 1.92 |
| 10.06.04 | 1.92 |
| 11.06.04 | 1.92 |
| 12.06.04 | 1.92 |
| 13.06.04 | 1.92 |
| 14.06.04 | 1.92 |
| 15.06.04 | 1.92 |
| 16.06.04 | 1.92 |
| 17.06.04 | 1.92 |
| 18.06.04 | 1.92 |
| 19.06.04 | 1.92 |
| 20.06.04 | 1.92 |
| 21.06.04 | 1.92 |
| 22.06.04 | 1.92 |
| 23.06.04 | 1.92 |
| 24.06.04 | 1.92 |
| 25.06.04 | 1.92 |
| 26.06.04 | 1.92 |
| 27.06.04 | 1.92 |
| 28.06.04 | 1.92 |
| 29.06.04 | 1.92 |
| 30.06.04 | 1.92 |
| 01.07.04 | 1.92 |
| 02.07.04 | 1.92 |
| 03.07.04 | 1.92 |
| 04.07.04 | 1.92 |
| 05.07.04 | 1.92 |
| 06.07.04 | 1.92 |
| 07.07.04 | 1.92 |
| 08.07.04 | 1.92 |
| 09.07.04 | 1.92 |
| 10.07.04 | 1.925 |
| 11.07.04 | 1.925 |
| 12.07.04 | 1.925 |
| 13.07.04 | 1.92 |
| 14.07.04 | 1.91 |
| 15.07.04 | 1.91 |
| 16.07.04 | 1.91 |
| 17.07.04 | 1.91 |
| 18.07.04 | 1.91 |
| 19.07.04 | 1.91 |
| 20.07.04 | 1.91 |
| 21.07.04 | 1.895 |
| 22.07.04 | 1.895 |
| 23.07.04 | 1.895 |
| 24.07.04 | 1.895 |
| 25.07.04 | 1.895 |
| 26.07.04 | 1.895 |
| 27.07.04 | 1.895 |
| 28.07.04 | 1.895 |
| 29.07.04 | 1.891 |
| 30.07.04 | 1.891 |
| 31.07.04 | 1.89 |
| 01.08.04 | 1.89 |
| 02.08.04 | 1.89 |
| 03.08.04 | 1.87 |
| 04.08.04 | 1.87 |
| 05.08.04 | 1.87 |
| 06.08.04 | 1.85 |
| 07.08.04 | 1.85 |
| 08.08.04 | 1.85 |
| 09.08.04 | 1.85 |
| 10.08.04 | 1.85 |
| 11.08.04 | 1.85 |
| 12.08.04 | 1.835 |
| 13.08.04 | 1.835 |
| 14.08.04 | 1.832 |
| 15.08.04 | 1.832 |
| 16.08.04 | 1.832 |
| 17.08.04 | 1.83 |
| 18.08.04 | 1.828 |
| 19.08.04 | 1.82 |
| 20.08.04 | 1.82 |
| 21.08.04 | 1.815 |
| 22.08.04 | 1.815 |
| 23.08.04 | 1.815 |
| 24.08.04 | 1.805 |
| 25.08.04 | 1.805 |
| 26.08.04 | 1.8 |
| 27.08.04 | 1.8 |
| 28.08.04 | 1.8 |
| 29.08.04 | 1.8 |
| 30.08.04 | 1.8 |
| 31.08.04 | 1.785 |
| 01.09.04 | 1.775 |
| 02.09.04 | 1.765 |
| 03.09.04 | 1.735 |
| 04.09.04 | 1.72 |
| 05.09.04 | 1.72 |
| 06.09.04 | 1.72 |
| 07.09.04 | 1.71 |
| 08.09.04 | 1.7 |
| 09.09.04 | 1.705 |
| 10.09.04 | 1.705 |
| 11.09.04 | 1.81 |
| 12.09.04 | 1.81 |
| 13.09.04 | 1.81 |
| 14.09.04 | 1.81 |
| 15.09.04 | 1.85 |
| 16.09.04 | 1.87 |
| 17.09.04 | 1.865 |
| 18.09.04 | 1.845 |
| 19.09.04 | 1.845 |
| 20.09.04 | 1.845 |
| 21.09.04 | 1.83 |
| 22.09.04 | 1.858 |
| 23.09.04 | 1.875 |
| 24.09.04 | 1.872 |
| 25.09.04 | 1.84 |
| 26.09.04 | 1.84 |
| 27.09.04 | 1.84 |
| 28.09.04 | 1.865 |
| 29.09.04 | 1.845 |
| 30.09.04 | 1.84 |
| 01.10.04 | 1.825 |
| 02.10.04 | 1.82 |
| 03.10.04 | 1.82 |
| 04.10.04 | 1.82 |
| 05.10.04 | 1.82 |
| 06.10.04 | 1.82 |
| 07.10.04 | 1.845 |
| 08.10.04 | 1.835 |
| 09.10.04 | 1.835 |
| 10.10.04 | 1.835 |
| 11.10.04 | 1.835 |
| 12.10.04 | 1.83 |
| 13.10.04 | 1.83 |
| 14.10.04 | 1.835 |
| 15.10.04 | 1.835 |
| 16.10.04 | 1.835 |
| 17.10.04 | 1.835 |
| 18.10.04 | 1.835 |
| 19.10.04 | 1.825 |
| 20.10.04 | 1.832 |
| 21.10.04 | 1.845 |
| 22.10.04 | 1.83 |
| 23.10.04 | 1.845 |
| 24.10.04 | 1.845 |
| 25.10.04 | 1.845 |
| 26.10.04 | 1.832 |
| 27.10.04 | 1.82 |
| 28.10.04 | 1.83 |
| 29.10.04 | 1.83 |
| 30.10.04 | 1.828 |
| 31.10.04 | 1.828 |
| 01.11.04 | 1.828 |
| 02.11.04 | 1.818 |
| 03.11.04 | 1.827 |
| 04.11.04 | 1.825 |
| 05.11.04 | 1.822 |
| 06.11.04 | 1.81 |
| 07.11.04 | 1.81 |
| 08.11.04 | 1.81 |
| 09.11.04 | 1.805 |
| 10.11.04 | 1.81 |
| 11.11.04 | 1.8 |
| 12.11.04 | 1.8 |
| 13.11.04 | 1.8 |
| 14.11.04 | 1.8 |
| 15.11.04 | 1.8 |
| 16.11.04 | 1.8 |
| 17.11.04 | 1.8 |
| 18.11.04 | 1.79 |
| 19.11.04 | 1.785 |
| 20.11.04 | 1.78 |
| 21.11.04 | 1.78 |
| 22.11.04 | 1.78 |
| 23.11.04 | 1.78 |
| 24.11.04 | 1.78 |
| 25.11.04 | 1.78 |
| 26.11.04 | 1.78 |
| 27.11.04 | 1.78 |
| 28.11.04 | 1.78 |
| 29.11.04 | 1.78 |
| 30.11.04 | 1.78 |
| 01.12.04 | 1.785 |
| 02.12.04 | 1.82 |
| 03.12.04 | 1.835 |
| 04.12.04 | 1.835 |
| 05.12.04 | 1.835 |
| 06.12.04 | 1.835 |
| 07.12.04 | 1.82 |
| 08.12.04 | 1.8 |
| 09.12.04 | 1.795 |
| 10.12.04 | 1.77 |
| 11.12.04 | 1.77 |
| 12.12.04 | 1.77 |
| 13.12.04 | 1.77 |
| 14.12.04 | 1.815 |
| 15.12.04 | 1.8 |
| 16.12.04 | 1.8 |
| 17.12.04 | 1.79 |
| 18.12.04 | 1.791 |
| 19.12.04 | 1.791 |
| 20.12.04 | 1.791 |
| 21.12.04 | 1.791 |
| 22.12.04 | 1.791 |
| 23.12.04 | 1.805 |
| 24.12.04 | 1.805 |
| 25.12.04 | 1.77 |
| 26.12.04 | 1.77 |
| 27.12.04 | 1.77 |
| 28.12.04 | 1.77 |
| 29.12.04 | 1.805 |
| 30.12.04 | 1.82 |
| 31.12.04 | 1.825 |
| 01.01.05 | 1.826 |
| 02.01.05 | 1.826 |
| 03.01.05 | 1.826 |
| 04.01.05 | 1.826 |
| 05.01.05 | 1.826 |
| 06.01.05 | 1.826 |
| 07.01.05 | 1.79 |
| 08.01.05 | 1.79 |
| 09.01.05 | 1.79 |
| 10.01.05 | 1.79 |
| 11.01.05 | 1.815 |
| 12.01.05 | 1.816 |
| 13.01.05 | 1.81 |
| 14.01.05 | 1.815 |
| 15.01.05 | 1.82 |
| 16.01.05 | 1.82 |
| 17.01.05 | 1.82 |
| 18.01.05 | 1.815 |
| 19.01.05 | 1.82 |
| 20.01.05 | 1.82 |
| 21.01.05 | 1.82 |
| 22.01.05 | 1.825 |
| 23.01.05 | 1.825 |
| 24.01.05 | 1.825 |
| 25.01.05 | 1.827 |
| 26.01.05 | 1.82 |
| 27.01.05 | 1.82 |
| 28.01.05 | 1.828 |
| 29.01.05 | 1.82 |
| 30.01.05 | 1.82 |
| 31.01.05 | 1.82 |
| 01.02.05 | 1.815 |
| 02.02.05 | 1.817 |
| 03.02.05 | 1.825 |
| 04.02.05 | 1.82 |
| 05.02.05 | 1.815 |
| 06.02.05 | 1.815 |
| 07.02.05 | 1.815 |
| 08.02.05 | 1.823 |
| 09.02.05 | 1.825 |
| 10.02.05 | 1.825 |
| 11.02.05 | 1.83 |
| 12.02.05 | 1.83 |
| 13.02.05 | 1.83 |
| 14.02.05 | 1.83 |
| 15.02.05 | 1.835 |
| 16.02.05 | 1.84 |
| 17.02.05 | 1.84 |
| 18.02.05 | 1.83 |
| 19.02.05 | 1.83 |
| 20.02.05 | 1.83 |
| 21.02.05 | 1.83 |
| 22.02.05 | 1.835 |
| 23.02.05 | 1.836 |
| 24.02.05 | 1.836 |
| 25.02.05 | 1.836 |
| 26.02.05 | 1.829 |
| 27.02.05 | 1.829 |
| 28.02.05 | 1.829 |
| 01.03.05 | 1.835 |
| 02.03.05 | 1.838 |
| 03.03.05 | 1.838 |
| 04.03.05 | 1.838 |
| 05.03.05 | 1.838 |
| 06.03.05 | 1.838 |
| 07.03.05 | 1.838 |
| 08.03.05 | 1.832 |
| 09.03.05 | 1.832 |
| 10.03.05 | 1.825 |
| 11.03.05 | 1.84 |
| 12.03.05 | 1.84 |
| 13.03.05 | 1.84 |
| 14.03.05 | 1.84 |
| 15.03.05 | 1.83 |
| 16.03.05 | 1.84 |
| 17.03.05 | 1.84 |
| 18.03.05 | 1.835 |
| 19.03.05 | 1.838 |
| 20.03.05 | 1.838 |
| 21.03.05 | 1.838 |
| 22.03.05 | 1.838 |
| 23.03.05 | 1.838 |
| 24.03.05 | 1.84 |
| 25.03.05 | 1.84 |
| 26.03.05 | 1.835 |
| 27.03.05 | 1.835 |
| 28.03.05 | 1.835 |
| 29.03.05 | 1.835 |
| 30.03.05 | 1.84 |
| 31.03.05 | 1.834 |
| 01.04.05 | 1.84 |
| 02.04.05 | 1.84 |
| 03.04.05 | 1.84 |
| 04.04.05 | 1.84 |
| 05.04.05 | 1.84 |
| 06.04.05 | 1.838 |
| 07.04.05 | 1.832 |
| 08.04.05 | 1.832 |
| 09.04.05 | 1.835 |
| 10.04.05 | 1.835 |
| 11.04.05 | 1.835 |
| 12.04.05 | 1.83 |
| 13.04.05 | 1.835 |
| 14.04.05 | 1.83 |
| 15.04.05 | 1.835 |
| 16.04.05 | 1.83 |
| 17.04.05 | 1.83 |
| 18.04.05 | 1.83 |
| 19.04.05 | 1.828 |
| 20.04.05 | 1.825 |
| 21.04.05 | 1.822 |
| 22.04.05 | 1.825 |
| 23.04.05 | 1.828 |
| 24.04.05 | 1.828 |
| 25.04.05 | 1.828 |
| 26.04.05 | 1.825 |
| 27.04.05 | 1.82 |
| 28.04.05 | 1.82 |
| 29.04.05 | 1.825 |
| 30.04.05 | 1.825 |
| 01.05.05 | 1.825 |
| 02.05.05 | 1.825 |
| 03.05.05 | 1.825 |
| 04.05.05 | 1.828 |
| 05.05.05 | 1.82 |
| 06.05.05 | 1.828 |
| 07.05.05 | 1.828 |
| 08.05.05 | 1.828 |
| 09.05.05 | 1.828 |
| 10.05.05 | 1.828 |
| 11.05.05 | 1.822 |
| 12.05.05 | 1.822 |
| 13.05.05 | 1.825 |
| 14.05.05 | 1.825 |
| 15.05.05 | 1.825 |
| 16.05.05 | 1.825 |
| 17.05.05 | 1.82 |
| 18.05.05 | 1.82 |
| 19.05.05 | 1.821 |
| 20.05.05 | 1.825 |
| 21.05.05 | 1.825 |
| 22.05.05 | 1.825 |
| 23.05.05 | 1.825 |
| 24.05.05 | 1.825 |
| 25.05.05 | 1.828 |
| 26.05.05 | 1.827 |
| 27.05.05 | 1.827 |
| 28.05.05 | 1.83 |
| 29.05.05 | 1.83 |
| 30.05.05 | 1.83 |
| 31.05.05 | 1.827 |
| 01.06.05 | 1.83 |
| 02.06.05 | 1.83 |
| 03.06.05 | 1.827 |
| 04.06.05 | 1.822 |
| 05.06.05 | 1.822 |
| 06.06.05 | 1.822 |
| 07.06.05 | 1.82 |
| 08.06.05 | 1.825 |
| 09.06.05 | 1.82 |
| 10.06.05 | 1.82 |
| 11.06.05 | 1.82 |
| 12.06.05 | 1.82 |
| 13.06.05 | 1.82 |
| 14.06.05 | 1.815 |
| 15.06.05 | 1.818 |
| 16.06.05 | 1.817 |
| 17.06.05 | 1.817 |
| 18.06.05 | 1.817 |
| 19.06.05 | 1.817 |
| 20.06.05 | 1.817 |
| 21.06.05 | 1.813 |
| 22.06.05 | 1.815 |
| 23.06.05 | 1.812 |
| 24.06.05 | 1.813 |
| 25.06.05 | 1.815 |
| 26.06.05 | 1.815 |
| 27.06.05 | 1.815 |
| 28.06.05 | 1.815 |
| 29.06.05 | 1.812 |
| 30.06.05 | 1.812 |
| 01.07.05 | 1.812 |
| 02.07.05 | 1.816 |
| 03.07.05 | 1.816 |
| 04.07.05 | 1.816 |
| 05.07.05 | 1.82 |
| 06.07.05 | 1.822 |
| 07.07.05 | 1.818 |
| 08.07.05 | 1.813 |
| 09.07.05 | 1.82 |
| 10.07.05 | 1.82 |
| 11.07.05 | 1.82 |
| 12.07.05 | 1.825 |
| 13.07.05 | 1.822 |
| 14.07.05 | 1.82 |
| 15.07.05 | 1.82 |
| 16.07.05 | 1.82 |
| 17.07.05 | 1.82 |
| 18.07.05 | 1.82 |
| 19.07.05 | 1.82 |
| 20.07.05 | 1.814 |
| 21.07.05 | 1.814 |
| 22.07.05 | 1.814 |
| 23.07.05 | 1.812 |
| 24.07.05 | 1.812 |
| 25.07.05 | 1.812 |
| 26.07.05 | 1.81 |
| 27.07.05 | 1.808 |
| 28.07.05 | 1.808 |
| 29.07.05 | 1.81 |
| 30.07.05 | 1.808 |
| 31.07.05 | 1.808 |
| 01.08.05 | 1.808 |
| 02.08.05 | 1.812 |
| 03.08.05 | 1.818 |
| 04.08.05 | 1.812 |
| 05.08.05 | 1.808 |
| 06.08.05 | 1.802 |
| 07.08.05 | 1.802 |
| 08.08.05 | 1.802 |
| 09.08.05 | 1.803 |
| 10.08.05 | 1.803 |
| 11.08.05 | 1.805 |
| 12.08.05 | 1.805 |
| 13.08.05 | 1.805 |
| 14.08.05 | 1.805 |
| 15.08.05 | 1.805 |
| 16.08.05 | 1.802 |
| 17.08.05 | 1.802 |
| 18.08.05 | 1.802 |
| 19.08.05 | 1.805 |
| 20.08.05 | 1.8 |
| 21.08.05 | 1.8 |
| 22.08.05 | 1.8 |
| 23.08.05 | 1.8 |
| 24.08.05 | 1.8 |
| 25.08.05 | 1.8 |
| 26.08.05 | 1.8 |
| 27.08.05 | 1.792 |
| 28.08.05 | 1.792 |
| 29.08.05 | 1.792 |
| 30.08.05 | 1.79 |
| 31.08.05 | 1.79 |
| 01.09.05 | 1.792 |
| 02.09.05 | 1.792 |
| 03.09.05 | 1.792 |
| 04.09.05 | 1.792 |
| 05.09.05 | 1.792 |
| 06.09.05 | 1.795 |
| 07.09.05 | 1.798 |
| 08.09.05 | 1.8 |
| 09.09.05 | 1.805 |
| 10.09.05 | 1.804 |
| 11.09.05 | 1.804 |
| 12.09.05 | 1.804 |
| 13.09.05 | 1.804 |
| 14.09.05 | 1.8 |
| 15.09.05 | 1.792 |
| 16.09.05 | 1.79 |
| 17.09.05 | 1.788 |
| 18.09.05 | 1.788 |
| 19.09.05 | 1.788 |
| 20.09.05 | 1.785 |
| 21.09.05 | 1.79 |
| 22.09.05 | 1.795 |
| 23.09.05 | 1.8 |
| 24.09.05 | 1.8 |
| 25.09.05 | 1.8 |
| 26.09.05 | 1.8 |
| 27.09.05 | 1.798 |
| 28.09.05 | 1.798 |
| 29.09.05 | 1.798 |
| 30.09.05 | 1.792 |
| 01.10.05 | 1.79 |
| 02.10.05 | 1.79 |
| 03.10.05 | 1.79 |
| 04.10.05 | 1.795 |
| 05.10.05 | 1.795 |
| 06.10.05 | 1.796 |
| 07.10.05 | 1.798 |
| 08.10.05 | 1.802 |
| 09.10.05 | 1.802 |
| 10.10.05 | 1.802 |
| 11.10.05 | 1.8 |
| 12.10.05 | 1.8 |
| 13.10.05 | 1.805 |
| 14.10.05 | 1.806 |
| 15.10.05 | 1.806 |
| 16.10.05 | 1.806 |
| 17.10.05 | 1.806 |
| 18.10.05 | 1.798 |
| 19.10.05 | 1.795 |
| 20.10.05 | 1.797 |
| 21.10.05 | 1.798 |
| 22.10.05 | 1.792 |
| 23.10.05 | 1.792 |
| 24.10.05 | 1.792 |
| 25.10.05 | 1.795 |
| 26.10.05 | 1.795 |
| 27.10.05 | 1.795 |
| 28.10.05 | 1.798 |
| 29.10.05 | 1.798 |
| 30.10.05 | 1.798 |
| 31.10.05 | 1.798 |
| 01.11.05 | 1.802 |
| 02.11.05 | 1.803 |
| 03.11.05 | 1.8 |
| 04.11.05 | 1.8 |
| 05.11.05 | 1.795 |
| 06.11.05 | 1.795 |
| 07.11.05 | 1.795 |
| 08.11.05 | 1.798 |
| 09.11.05 | 1.795 |
| 10.11.05 | 1.792 |
| 11.11.05 | 1.795 |
| 12.11.05 | 1.795 |
| 13.11.05 | 1.795 |
| 14.11.05 | 1.795 |
| 15.11.05 | 1.798 |
| 16.11.05 | 1.798 |
| 17.11.05 | 1.798 |
| 18.11.05 | 1.797 |
| 19.11.05 | 1.795 |
| 20.11.05 | 1.795 |
| 21.11.05 | 1.795 |
| 22.11.05 | 1.795 |
| 23.11.05 | 1.8 |
| 24.11.05 | 1.8 |
| 25.11.05 | 1.8 |
| 26.11.05 | 1.797 |
| 27.11.05 | 1.797 |
| 28.11.05 | 1.797 |
| 29.11.05 | 1.79 |
| 30.11.05 | 1.79 |
| 01.12.05 | 1.792 |
| 02.12.05 | 1.792 |
| 03.12.05 | 1.792 |
| 04.12.05 | 1.792 |
| 05.12.05 | 1.792 |
| 06.12.05 | 1.795 |
| 07.12.05 | 1.795 |
| 08.12.05 | 1.792 |
| 09.12.05 | 1.79 |
| 10.12.05 | 1.785 |
| 11.12.05 | 1.785 |
| 12.12.05 | 1.785 |
| 13.12.05 | 1.786 |
| 14.12.05 | 1.79 |
| 15.12.05 | 1.788 |
| 16.12.05 | 1.78 |
| 17.12.05 | 1.78 |
| 18.12.05 | 1.78 |
| 19.12.05 | 1.78 |
| 20.12.05 | 1.782 |
| 21.12.05 | 1.782 |
| 22.12.05 | 1.782 |
| 23.12.05 | 1.78 |
| 24.12.05 | 1.78 |
| 25.12.05 | 1.78 |
| 26.12.05 | 1.78 |
| 27.12.05 | 1.78 |
| 28.12.05 | 1.785 |
| 29.12.05 | 1.792 |
| 30.12.05 | 1.792 |
| 31.12.05 | 1.792 |
| 01.01.06 | 1.792 |
| 02.01.06 | 1.792 |
| 03.01.06 | 1.792 |
| 04.01.06 | 1.792 |
| 05.01.06 | 1.798 |
| 06.01.06 | 1.792 |
| 07.01.06 | 1.792 |
| 08.01.06 | 1.792 |
| 09.01.06 | 1.792 |
| 10.01.06 | 1.798 |
| 11.01.06 | 1.802 |
| 12.01.06 | 1.802 |
| 13.01.06 | 1.798 |
| 14.01.06 | 1.802 |
| 15.01.06 | 1.802 |
| 16.01.06 | 1.802 |
| 17.01.06 | 1.8 |
| 18.01.06 | 1.803 |
| 19.01.06 | 1.808 |
| 20.01.06 | 1.808 |
| 21.01.06 | 1.808 |
| 22.01.06 | 1.808 |
| 23.01.06 | 1.808 |
| 24.01.06 | 1.805 |
| 25.01.06 | 1.805 |
| 26.01.06 | 1.806 |
| 27.01.06 | 1.81 |
| 28.01.06 | 1.81 |
| 29.01.06 | 1.81 |
| 30.01.06 | 1.81 |
| 31.01.06 | 1.812 |
| 01.02.06 | 1.812 |
| 02.02.06 | 1.808 |
| 03.02.06 | 1.808 |
| 04.02.06 | 1.808 |
| 05.02.06 | 1.808 |
| 06.02.06 | 1.808 |
| 07.02.06 | 1.806 |
| 08.02.06 | 1.81 |
| 09.02.06 | 1.811 |
| 10.02.06 | 1.811 |
| 11.02.06 | 1.81 |
| 12.02.06 | 1.81 |
| 13.02.06 | 1.81 |
| 14.02.06 | 1.812 |
| 15.02.06 | 1.812 |
| 16.02.06 | 1.812 |
| 17.02.06 | 1.816 |
| 18.02.06 | 1.82 |
| 19.02.06 | 1.82 |
| 20.02.06 | 1.82 |
| 21.02.06 | 1.82 |
| 22.02.06 | 1.822 |
| 23.02.06 | 1.82 |
| 24.02.06 | 1.82 |
| 25.02.06 | 1.822 |
| 26.02.06 | 1.822 |
| 27.02.06 | 1.822 |
| 28.02.06 | 1.826 |
| 01.03.06 | 1.83 |
| 02.03.06 | 1.83 |
| 03.03.06 | 1.83 |
| 04.03.06 | 1.83 |
| 05.03.06 | 1.83 |
| 06.03.06 | 1.83 |
| 07.03.06 | 1.83 |
| 08.03.06 | 1.83 |
| 09.03.06 | 1.83 |
| 10.03.06 | 1.822 |
| 11.03.06 | 1.826 |
| 12.03.06 | 1.826 |
| 13.03.06 | 1.826 |
| 14.03.06 | 1.825 |
| 15.03.06 | 1.828 |
| 16.03.06 | 1.828 |
| 17.03.06 | 1.828 |
| 18.03.06 | 1.828 |
| 19.03.06 | 1.828 |
| 20.03.06 | 1.828 |
| 21.03.06 | 1.828 |
| 22.03.06 | 1.828 |
| 23.03.06 | 1.828 |
| 24.03.06 | 1.827 |
| 25.03.06 | 1.828 |
| 26.03.06 | 1.828 |
| 27.03.06 | 1.828 |
| 28.03.06 | 1.828 |
| 29.03.06 | 1.826 |
| 30.03.06 | 1.828 |
| 31.03.06 | 1.827 |
| 01.04.06 | 1.826 |
| 02.04.06 | 1.826 |
| 03.04.06 | 1.826 |
| 04.04.06 | 1.827 |
| 05.04.06 | 1.826 |
| 06.04.06 | 1.825 |
| 07.04.06 | 1.825 |
| 08.04.06 | 1.823 |
| 09.04.06 | 1.823 |
| 10.04.06 | 1.823 |
| 11.04.06 | 1.822 |
| 12.04.06 | 1.821 |
| 13.04.06 | 1.821 |
| 14.04.06 | 1.821 |
| 15.04.06 | 1.82 |
| 16.04.06 | 1.82 |
| 17.04.06 | 1.82 |
| 18.04.06 | 1.819 |
| 19.04.06 | 1.819 |
| 20.04.06 | 1.819 |
| 21.04.06 | 1.817 |
| 22.04.06 | 1.817 |
| 23.04.06 | 1.817 |
| 24.04.06 | 1.817 |
| 25.04.06 | 1.817 |
| 26.04.06 | 1.816 |
| 27.04.06 | 1.816 |
| 28.04.06 | 1.816 |
| 29.04.06 | 1.817 |
| 30.04.06 | 1.817 |
| 01.05.06 | 1.817 |
| 02.05.06 | 1.816 |
| 03.05.06 | 1.815 |
| 04.05.06 | 1.815 |
| 05.05.06 | 1.815 |
| 06.05.06 | 1.815 |
| 07.05.06 | 1.815 |
| 08.05.06 | 1.815 |
| 09.05.06 | 1.814 |
| 10.05.06 | 1.814 |
| 11.05.06 | 1.812 |
| 12.05.06 | 1.808 |
| 13.05.06 | 1.808 |
| 14.05.06 | 1.808 |
| 15.05.06 | 1.808 |
| 16.05.06 | 1.806 |
| 17.05.06 | 1.802 |
| 18.05.06 | 1.8 |
| 19.05.06 | 1.8 |
| 20.05.06 | 1.801 |
| 21.05.06 | 1.801 |
| 22.05.06 | 1.801 |
| 23.05.06 | 1.801 |
| 24.05.06 | 1.8 |
| 25.05.06 | 1.8 |
| 26.05.06 | 1.798 |
| 27.05.06 | 1.798 |
| 28.05.06 | 1.798 |
| 29.05.06 | 1.798 |
| 30.05.06 | 1.798 |
| 31.05.06 | 1.8 |
| 01.06.06 | 1.798 |
| 02.06.06 | 1.798 |
| 03.06.06 | 1.798 |
| 04.06.06 | 1.798 |
| 05.06.06 | 1.798 |
| 06.06.06 | 1.796 |
| 07.06.06 | 1.792 |
| 08.06.06 | 1.79 |
| 09.06.06 | 1.788 |
| 10.06.06 | 1.785 |
| 11.06.06 | 1.785 |
| 12.06.06 | 1.785 |
| 13.06.06 | 1.786 |
| 14.06.06 | 1.784 |
| 15.06.06 | 1.782 |
| 16.06.06 | 1.778 |
| 17.06.06 | 1.776 |
| 18.06.06 | 1.776 |
| 19.06.06 | 1.776 |
| 20.06.06 | 1.776 |
| 21.06.06 | 1.777 |
| 22.06.06 | 1.777 |
| 23.06.06 | 1.775 |
| 24.06.06 | 1.775 |
| 25.06.06 | 1.775 |
| 26.06.06 | 1.775 |
| 27.06.06 | 1.775 |
| 28.06.06 | 1.773 |
| 29.06.06 | 1.773 |
| 30.06.06 | 1.773 |
| 01.07.06 | 1.772 |
| 02.07.06 | 1.772 |
| 03.07.06 | 1.772 |
| 04.07.06 | 1.772 |
| 05.07.06 | 1.772 |
| 06.07.06 | 1.772 |
| 07.07.06 | 1.772 |
| 08.07.06 | 1.772 |
| 09.07.06 | 1.772 |
| 10.07.06 | 1.772 |
| 11.07.06 | 1.771 |
| 12.07.06 | 1.77 |
| 13.07.06 | 1.77 |
| 14.07.06 | 1.768 |
| 15.07.06 | 1.766 |
| 16.07.06 | 1.766 |
| 17.07.06 | 1.766 |
| 18.07.06 | 1.765 |
| 19.07.06 | 1.767 |
| 20.07.06 | 1.77 |
| 21.07.06 | 1.771 |
| 22.07.06 | 1.77 |
| 23.07.06 | 1.77 |
| 24.07.06 | 1.77 |
| 25.07.06 | 1.768 |
| 26.07.06 | 1.765 |
| 27.07.06 | 1.765 |
| 28.07.06 | 1.765 |
| 29.07.06 | 1.765 |
| 30.07.06 | 1.765 |
| 31.07.06 | 1.765 |
| 01.08.06 | 1.765 |
| 02.08.06 | 1.765 |
| 03.08.06 | 1.765 |
| 04.08.06 | 1.765 |
| 05.08.06 | 1.763 |
| 06.08.06 | 1.763 |
| 07.08.06 | 1.763 |
| 08.08.06 | 1.761 |
| 09.08.06 | 1.76 |
| 10.08.06 | 1.76 |
| 11.08.06 | 1.76 |
| 12.08.06 | 1.76 |
| 13.08.06 | 1.76 |
| 14.08.06 | 1.76 |
| 15.08.06 | 1.758 |
| 16.08.06 | 1.758 |
| 17.08.06 | 1.754 |
| 18.08.06 | 1.754 |
| 19.08.06 | 1.752 |
| 20.08.06 | 1.752 |
| 21.08.06 | 1.752 |
| 22.08.06 | 1.748 |
| 23.08.06 | 1.743 |
| 24.08.06 | 1.741 |
| 25.08.06 | 1.741 |
| 26.08.06 | 1.741 |
| 27.08.06 | 1.741 |
| 28.08.06 | 1.741 |
| 29.08.06 | 1.741 |
| 30.08.06 | 1.742 |
| 31.08.06 | 1.744 |
| 01.09.06 | 1.744 |
| 02.09.06 | 1.746 |
| 03.09.06 | 1.746 |
| 04.09.06 | 1.746 |
| 05.09.06 | 1.746 |
| 06.09.06 | 1.747 |
| 07.09.06 | 1.747 |
| 08.09.06 | 1.745 |
| 09.09.06 | 1.744 |
| 10.09.06 | 1.744 |
| 11.09.06 | 1.744 |
| 12.09.06 | 1.745 |
| 13.09.06 | 1.745 |
| 14.09.06 | 1.745 |
| 15.09.06 | 1.745 |
| 16.09.06 | 1.745 |
| 17.09.06 | 1.745 |
| 18.09.06 | 1.745 |
| 19.09.06 | 1.742 |
| 20.09.06 | 1.74 |
| 21.09.06 | 1.74 |
| 22.09.06 | 1.74 |
| 23.09.06 | 1.74 |
| 24.09.06 | 1.74 |
| 25.09.06 | 1.74 |
| 26.09.06 | 1.738 |
| 27.09.06 | 1.738 |
| 28.09.06 | 1.738 |
| 29.09.06 | 1.736 |
| 30.09.06 | 1.736 |
| 01.10.06 | 1.736 |
| 02.10.06 | 1.736 |
| 03.10.06 | 1.736 |
| 04.10.06 | 1.736 |
| 05.10.06 | 1.738 |
| 06.10.06 | 1.738 |
| 07.10.06 | 1.739 |
| 08.10.06 | 1.739 |
| 09.10.06 | 1.739 |
| 10.10.06 | 1.738 |
| 11.10.06 | 1.74 |
| 12.10.06 | 1.74 |
| 13.10.06 | 1.742 |
| 14.10.06 | 1.744 |
| 15.10.06 | 1.744 |
| 16.10.06 | 1.744 |
| 17.10.06 | 1.746 |
| 18.10.06 | 1.746 |
| 19.10.06 | 1.746 |
| 20.10.06 | 1.745 |
| 21.10.06 | 1.744 |
| 22.10.06 | 1.744 |
| 23.10.06 | 1.744 |
| 24.10.06 | 1.74 |
| 25.10.06 | 1.74 |
| 26.10.06 | 1.74 |
| 27.10.06 | 1.739 |
| 28.10.06 | 1.739 |
| 29.10.06 | 1.739 |
| 30.10.06 | 1.739 |
| 31.10.06 | 1.739 |
| 01.11.06 | 1.738 |
| 02.11.06 | 1.738 |
| 03.11.06 | 1.736 |
| 04.11.06 | 1.736 |
| 05.11.06 | 1.736 |
| 06.11.06 | 1.736 |
| 07.11.06 | 1.736 |
| 08.11.06 | 1.735 |
| 09.11.06 | 1.736 |
| 10.11.06 | 1.735 |
| 11.11.06 | 1.732 |
| 12.11.06 | 1.732 |
| 13.11.06 | 1.732 |
| 14.11.06 | 1.732 |
| 15.11.06 | 1.735 |
| 16.11.06 | 1.735 |
| 17.11.06 | 1.736 |
| 18.11.06 | 1.734 |
| 19.11.06 | 1.734 |
| 20.11.06 | 1.734 |
| 21.11.06 | 1.735 |
| 22.11.06 | 1.734 |
| 23.11.06 | 1.734 |
| 24.11.06 | 1.734 |
| 25.11.06 | 1.735 |
| 26.11.06 | 1.735 |
| 27.11.06 | 1.735 |
| 28.11.06 | 1.734 |
| 29.11.06 | 1.732 |
| 30.11.06 | 1.732 |
| 01.12.06 | 1.732 |
| 02.12.06 | 1.73 |
| 03.12.06 | 1.73 |
| 04.12.06 | 1.73 |
| 05.12.06 | 1.73 |
| 06.12.06 | 1.73 |
| 07.12.06 | 1.728 |
| 08.12.06 | 1.728 |
| 09.12.06 | 1.728 |
| 10.12.06 | 1.728 |
| 11.12.06 | 1.728 |
| 12.12.06 | 1.727 |
| 13.12.06 | 1.726 |
| 14.12.06 | 1.726 |
| 15.12.06 | 1.725 |
| 16.12.06 | 1.724 |
| 17.12.06 | 1.724 |
| 18.12.06 | 1.724 |
| 19.12.06 | 1.722 |
| 20.12.06 | 1.722 |
| 21.12.06 | 1.722 |
| 22.12.06 | 1.722 |
| 23.12.06 | 1.722 |
| 24.12.06 | 1.722 |
| 25.12.06 | 1.722 |
| 26.12.06 | 1.72 |
| 27.12.06 | 1.715 |
| 28.12.06 | 1.715 |
| 29.12.06 | 1.715 |
| 30.12.06 | 1.714 |
| 31.12.06 | 1.714 |
| 01.01.07 | 1.714 |
| 02.01.07 | 1.714 |
| 03.01.07 | 1.714 |
| 04.01.07 | 1.714 |
| 05.01.07 | 1.714 |
| 06.01.07 | 1.714 |
| 07.01.07 | 1.714 |
| 08.01.07 | 1.714 |
| 09.01.07 | 1.714 |
| 10.01.07 | 1.714 |
| 11.01.07 | 1.714 |
| 12.01.07 | 1.714 |
| 13.01.07 | 1.714 |
| 14.01.07 | 1.714 |
| 15.01.07 | 1.714 |
| 16.01.07 | 1.714 |
| 17.01.07 | 1.714 |
| 18.01.07 | 1.714 |
| 19.01.07 | 1.714 |
| 20.01.07 | 1.714 |
| 21.01.07 | 1.714 |
| 22.01.07 | 1.714 |
| 23.01.07 | 1.714 |
| 24.01.07 | 1.714 |
| 25.01.07 | 1.714 |
| 26.01.07 | 1.714 |
| 27.01.07 | 1.718 |
| 28.01.07 | 1.718 |
| 29.01.07 | 1.718 |
| 30.01.07 | 1.718 |
| 31.01.07 | 1.72 |
| 01.02.07 | 1.72 |
| 02.02.07 | 1.72 |
| 03.02.07 | 1.719 |
| 04.02.07 | 1.719 |
| 05.02.07 | 1.719 |
| 06.02.07 | 1.72 |
| 07.02.07 | 1.718 |
| 08.02.07 | 1.716 |
| 09.02.07 | 1.716 |
| 10.02.07 | 1.714 |
| 11.02.07 | 1.714 |
| 12.02.07 | 1.714 |
| 13.02.07 | 1.714 |
| 14.02.07 | 1.713 |
| 15.02.07 | 1.71 |
| 16.02.07 | 1.71 |
| 17.02.07 | 1.71 |
| 18.02.07 | 1.71 |
| 19.02.07 | 1.71 |
| 20.02.07 | 1.71 |
| 21.02.07 | 1.71 |
| 22.02.07 | 1.71 |
| 23.02.07 | 1.71 |
| 24.02.07 | 1.714 |
| 25.02.07 | 1.714 |
| 26.02.07 | 1.714 |
| 27.02.07 | 1.714 |
| 28.02.07 | 1.713 |
| 01.03.07 | 1.712 |
| 02.03.07 | 1.712 |
| 03.03.07 | 1.71 |
| 04.03.07 | 1.71 |
| 05.03.07 | 1.71 |
| 06.03.07 | 1.71 |
| 07.03.07 | 1.71 |
| 08.03.07 | 1.709 |
| 09.03.07 | 1.708 |
| 10.03.07 | 1.708 |
| 11.03.07 | 1.708 |
| 12.03.07 | 1.708 |
| 13.03.07 | 1.708 |
| 14.03.07 | 1.707 |
| 15.03.07 | 1.706 |
| 16.03.07 | 1.706 |
| 17.03.07 | 1.706 |
| 18.03.07 | 1.706 |
| 19.03.07 | 1.706 |
| 20.03.07 | 1.704 |
| 21.03.07 | 1.704 |
| 22.03.07 | 1.703 |
| 23.03.07 | 1.703 |
| 24.03.07 | 1.702 |
| 25.03.07 | 1.702 |
| 26.03.07 | 1.702 |
| 27.03.07 | 1.701 |
| 28.03.07 | 1.7 |
| 29.03.07 | 1.7 |
| 30.03.07 | 1.7 |
| 31.03.07 | 1.7 |
| 01.04.07 | 1.7 |
| 02.04.07 | 1.7 |
| 03.04.07 | 1.699 |
| 04.04.07 | 1.699 |
| 05.04.07 | 1.699 |
| 06.04.07 | 1.699 |
| 07.04.07 | 1.699 |
| 08.04.07 | 1.699 |
| 09.04.07 | 1.699 |
| 10.04.07 | 1.699 |
| 11.04.07 | 1.698 |
| 12.04.07 | 1.697 |
| 13.04.07 | 1.697 |
| 14.04.07 | 1.697 |
| 15.04.07 | 1.697 |
| 16.04.07 | 1.697 |
| 17.04.07 | 1.694 |
| 18.04.07 | 1.692 |
| 19.04.07 | 1.692 |
| 20.04.07 | 1.691 |
| 21.04.07 | 1.69 |
| 22.04.07 | 1.69 |
| 23.04.07 | 1.69 |
| 24.04.07 | 1.69 |
| 25.04.07 | 1.691 |
| 26.04.07 | 1.691 |
| 27.04.07 | 1.691 |
| 28.04.07 | 1.69 |
| 29.04.07 | 1.69 |
| 30.04.07 | 1.69 |
| 01.05.07 | 1.69 |
| 02.05.07 | 1.689 |
| 03.05.07 | 1.688 |
| 04.05.07 | 1.688 |
| 05.05.07 | 1.687 |
| 06.05.07 | 1.687 |
| 07.05.07 | 1.687 |
| 08.05.07 | 1.687 |
| 09.05.07 | 1.687 |
| 10.05.07 | 1.687 |
| 11.05.07 | 1.686 |
| 12.05.07 | 1.686 |
| 13.05.07 | 1.686 |
| 14.05.07 | 1.686 |
| 15.05.07 | 1.685 |
| 16.05.07 | 1.684 |
| 17.05.07 | 1.684 |
| 18.05.07 | 1.684 |
| 19.05.07 | 1.683 |
| 20.05.07 | 1.683 |
| 21.05.07 | 1.683 |
| 22.05.07 | 1.682 |
| 23.05.07 | 1.682 |
| 24.05.07 | 1.681 |
| 25.05.07 | 1.681 |
| 26.05.07 | 1.68 |
| 27.05.07 | 1.68 |
| 28.05.07 | 1.68 |
| 29.05.07 | 1.679 |
| 30.05.07 | 1.678 |
| 31.05.07 | 1.678 |
| 01.06.07 | 1.678 |
| 02.06.07 | 1.678 |
| 03.06.07 | 1.678 |
| 04.06.07 | 1.678 |
| 05.06.07 | 1.678 |
| 06.06.07 | 1.678 |
| 07.06.07 | 1.678 |
| 08.06.07 | 1.677 |
| 09.06.07 | 1.677 |
| 10.06.07 | 1.677 |
| 11.06.07 | 1.677 |
| 12.06.07 | 1.676 |
| 13.06.07 | 1.676 |
| 14.06.07 | 1.675 |
| 15.06.07 | 1.675 |
| 16.06.07 | 1.674 |
| 17.06.07 | 1.674 |
| 18.06.07 | 1.674 |
| 19.06.07 | 1.674 |
| 20.06.07 | 1.674 |
| 21.06.07 | 1.674 |
| 22.06.07 | 1.673 |
| 23.06.07 | 1.672 |
| 24.06.07 | 1.672 |
| 25.06.07 | 1.672 |
| 26.06.07 | 1.672 |
| 27.06.07 | 1.671 |
| 28.06.07 | 1.67 |
| 29.06.07 | 1.67 |
| 30.06.07 | 1.67 |
| 01.07.07 | 1.67 |
| 02.07.07 | 1.67 |
| 03.07.07 | 1.67 |
| 04.07.07 | 1.669 |
| 05.07.07 | 1.668 |
| 06.07.07 | 1.668 |
| 07.07.07 | 1.668 |
| 08.07.07 | 1.668 |
| 09.07.07 | 1.668 |
| 10.07.07 | 1.668 |
| 11.07.07 | 1.668 |
| 12.07.07 | 1.668 |
| 13.07.07 | 1.668 |
| 14.07.07 | 1.668 |
| 15.07.07 | 1.668 |
| 16.07.07 | 1.668 |
| 17.07.07 | 1.666 |
| 18.07.07 | 1.666 |
| 19.07.07 | 1.666 |
| 20.07.07 | 1.666 |
| 21.07.07 | 1.666 |
| 22.07.07 | 1.666 |
| 23.07.07 | 1.666 |
| 24.07.07 | 1.666 |
| 25.07.07 | 1.666 |
| 26.07.07 | 1.668 |
| 27.07.07 | 1.668 |
| 28.07.07 | 1.668 |
| 29.07.07 | 1.668 |
| 30.07.07 | 1.668 |
| 31.07.07 | 1.668 |
| 01.08.07 | 1.668 |
| 02.08.07 | 1.668 |
| 03.08.07 | 1.668 |
| 04.08.07 | 1.666 |
| 05.08.07 | 1.666 |
| 06.08.07 | 1.666 |
| 07.08.07 | 1.666 |
| 08.08.07 | 1.665 |
| 09.08.07 | 1.665 |
| 10.08.07 | 1.665 |
| 11.08.07 | 1.664 |
| 12.08.07 | 1.664 |
| 13.08.07 | 1.664 |
| 14.08.07 | 1.664 |
| 15.08.07 | 1.664 |
| 16.08.07 | 1.664 |
| 17.08.07 | 1.664 |
| 18.08.07 | 1.664 |
| 19.08.07 | 1.664 |
| 20.08.07 | 1.664 |
| 21.08.07 | 1.664 |
| 22.08.07 | 1.664 |
| 23.08.07 | 1.663 |
| 24.08.07 | 1.663 |
| 25.08.07 | 1.663 |
| 26.08.07 | 1.663 |
| 27.08.07 | 1.663 |
| 28.08.07 | 1.663 |
| 29.08.07 | 1.663 |
| 30.08.07 | 1.662 |
| 31.08.07 | 1.662 |
| 01.09.07 | 1.662 |
| 02.09.07 | 1.662 |
| 03.09.07 | 1.662 |
| 04.09.07 | 1.662 |
| 05.09.07 | 1.662 |
| 06.09.07 | 1.662 |
| 07.09.07 | 1.662 |
| 08.09.07 | 1.662 |
| 09.09.07 | 1.662 |
| 10.09.07 | 1.662 |
| 11.09.07 | 1.66 |
| 12.09.07 | 1.66 |
| 13.09.07 | 1.66 |
| 14.09.07 | 1.66 |
| 15.09.07 | 1.66 |
| 16.09.07 | 1.66 |
| 17.09.07 | 1.66 |
| 18.09.07 | 1.66 |
| 19.09.07 | 1.659 |
| 20.09.07 | 1.659 |
| 21.09.07 | 1.662 |
| 22.09.07 | 1.662 |
| 23.09.07 | 1.662 |
| 24.09.07 | 1.662 |
| 25.09.07 | 1.661 |
| 26.09.07 | 1.66 |
| 27.09.07 | 1.66 |
| 28.09.07 | 1.659 |
| 29.09.07 | 1.658 |
| 30.09.07 | 1.658 |
| 01.10.07 | 1.658 |
| 02.10.07 | 1.656 |
| 03.10.07 | 1.656 |
| 04.10.07 | 1.654 |
| 05.10.07 | 1.652 |
| 06.10.07 | 1.652 |
| 07.10.07 | 1.652 |
| 08.10.07 | 1.652 |
| 09.10.07 | 1.65 |
| 10.10.07 | 1.65 |
| 11.10.07 | 1.65 |
| 12.10.07 | 1.648 |
| 13.10.07 | 1.646 |
| 14.10.07 | 1.646 |
| 15.10.07 | 1.646 |
| 16.10.07 | 1.644 |
| 17.10.07 | 1.642 |
| 18.10.07 | 1.641 |
| 19.10.07 | 1.641 |
| 20.10.07 | 1.638 |
| 21.10.07 | 1.638 |
| 22.10.07 | 1.638 |
| 23.10.07 | 1.636 |
| 24.10.07 | 1.634 |
| 25.10.07 | 1.63 |
| 26.10.07 | 1.628 |
| 27.10.07 | 1.625 |
| 28.10.07 | 1.625 |
| 29.10.07 | 1.625 |
| 30.10.07 | 1.622 |
| 31.10.07 | 1.622 |
| 01.11.07 | 1.622 |
| 02.11.07 | 1.622 |
| 03.11.07 | 1.622 |
| 04.11.07 | 1.622 |
| 05.11.07 | 1.622 |
| 06.11.07 | 1.622 |
| 07.11.07 | 1.622 |
| 08.11.07 | 1.622 |
| 09.11.07 | 1.622 |
| 10.11.07 | 1.622 |
| 11.11.07 | 1.622 |
| 12.11.07 | 1.622 |
| 13.11.07 | 1.622 |
| 14.11.07 | 1.622 |
| 15.11.07 | 1.622 |
| 16.11.07 | 1.623 |
| 17.11.07 | 1.624 |
| 18.11.07 | 1.624 |
| 19.11.07 | 1.624 |
| 20.11.07 | 1.624 |
| 21.11.07 | 1.624 |
| 22.11.07 | 1.624 |
| 23.11.07 | 1.622 |
| 24.11.07 | 1.622 |
| 25.11.07 | 1.622 |
| 26.11.07 | 1.622 |
| 27.11.07 | 1.622 |
| 28.11.07 | 1.622 |
| 29.11.07 | 1.622 |
| 30.11.07 | 1.621 |
| 01.12.07 | 1.621 |
| 02.12.07 | 1.621 |
| 03.12.07 | 1.621 |
| 04.12.07 | 1.618 |
| 05.12.07 | 1.616 |
| 06.12.07 | 1.613 |
| 07.12.07 | 1.611 |
| 08.12.07 | 1.608 |
| 09.12.07 | 1.608 |
| 10.12.07 | 1.608 |
| 11.12.07 | 1.604 |
| 12.12.07 | 1.6 |
| 13.12.07 | 1.598 |
| 14.12.07 | 1.596 |
| 15.12.07 | 1.596 |
| 16.12.07 | 1.596 |
| 17.12.07 | 1.596 |
| 18.12.07 | 1.594 |
| 19.12.07 | 1.594 |
| 20.12.07 | 1.596 |
| 21.12.07 | 1.596 |
| 22.12.07 | 1.596 |
| 23.12.07 | 1.596 |
| 24.12.07 | 1.596 |
| 25.12.07 | 1.594 |
| 26.12.07 | 1.592 |
| 27.12.07 | 1.592 |
| 28.12.07 | 1.592 |
| 29.12.07 | 1.592 |
| 30.12.07 | 1.592 |
| 31.12.07 | 1.592 |
| 01.01.08 | 1.592 |
| 02.01.08 | 1.592 |
| 03.01.08 | 1.592 |
| 04.01.08 | 1.592 |
| 05.01.08 | 1.592 |
| 06.01.08 | 1.592 |
| 07.01.08 | 1.592 |
| 08.01.08 | 1.592 |
| 09.01.08 | 1.593 |
| 10.01.08 | 1.594 |
| 11.01.08 | 1.594 |
| 12.01.08 | 1.59 |
| 13.01.08 | 1.59 |
| 14.01.08 | 1.59 |
| 15.01.08 | 1.59 |
| 16.01.08 | 1.592 |
| 17.01.08 | 1.594 |
| 18.01.08 | 1.594 |
| 19.01.08 | 1.594 |
| 20.01.08 | 1.594 |
| 21.01.08 | 1.594 |
| 22.01.08 | 1.594 |
| 23.01.08 | 1.594 |
| 24.01.08 | 1.595 |
| 25.01.08 | 1.595 |
| 26.01.08 | 1.591 |
| 27.01.08 | 1.591 |
| 28.01.08 | 1.591 |
| 29.01.08 | 1.59 |
| 30.01.08 | 1.591 |
| 31.01.08 | 1.587 |
| 01.02.08 | 1.587 |
| 02.02.08 | 1.582 |
| 03.02.08 | 1.582 |
| 04.02.08 | 1.582 |
| 05.02.08 | 1.585 |
| 06.02.08 | 1.586 |
| 07.02.08 | 1.586 |
| 08.02.08 | 1.586 |
| 09.02.08 | 1.582 |
| 10.02.08 | 1.582 |
| 11.02.08 | 1.582 |
| 12.02.08 | 1.577 |
| 13.02.08 | 1.574 |
| 14.02.08 | 1.57 |
| 15.02.08 | 1.565 |
| 16.02.08 | 1.56 |
| 17.02.08 | 1.56 |
| 18.02.08 | 1.56 |
| 19.02.08 | 1.555 |
| 20.02.08 | 1.551 |
| 21.02.08 | 1.541 |
| 22.02.08 | 1.544 |
| 23.02.08 | 1.547 |
| 24.02.08 | 1.547 |
| 25.02.08 | 1.547 |
| 26.02.08 | 1.549 |
| 27.02.08 | 1.55 |
| 28.02.08 | 1.552 |
| 29.02.08 | 1.554 |
| 01.03.08 | 1.547 |
| 02.03.08 | 1.547 |
| 03.03.08 | 1.547 |
| 04.03.08 | 1.547 |
| 05.03.08 | 1.542 |
| 06.03.08 | 1.538 |
| 07.03.08 | 1.534 |
| 08.03.08 | 1.53 |
| 09.03.08 | 1.53 |
| 10.03.08 | 1.53 |
| 11.03.08 | 1.528 |
| 12.03.08 | 1.526 |
| 13.03.08 | 1.522 |
| 14.03.08 | 1.519 |
| 15.03.08 | 1.513 |
| 16.03.08 | 1.513 |
| 17.03.08 | 1.513 |
| 18.03.08 | 1.505 |
| 19.03.08 | 1.499 |
| 20.03.08 | 1.494 |
| 21.03.08 | 1.489 |
| 22.03.08 | 1.483 |
| 23.03.08 | 1.483 |
| 24.03.08 | 1.483 |
| 25.03.08 | 1.477 |
| 26.03.08 | 1.477 |
| 27.03.08 | 1.48 |
| 28.03.08 | 1.481 |
| 29.03.08 | 1.476 |
| 30.03.08 | 1.476 |
| 31.03.08 | 1.476 |
| 01.04.08 | 1.468 |
| 02.04.08 | 1.464 |
| 03.04.08 | 1.456 |
| 04.04.08 | 1.455 |
| 05.04.08 | 1.454 |
| 06.04.08 | 1.454 |
| 07.04.08 | 1.454 |
| 08.04.08 | 1.452 |
| 09.04.08 | 1.452 |
| 10.04.08 | 1.452 |
| 11.04.08 | 1.451 |
| 12.04.08 | 1.45 |
| 13.04.08 | 1.45 |
| 14.04.08 | 1.45 |
| 15.04.08 | 1.45 |
| 16.04.08 | 1.45 |
| 17.04.08 | 1.45 |
| 18.04.08 | 1.45 |
| 19.04.08 | 1.452 |
| 20.04.08 | 1.452 |
| 21.04.08 | 1.452 |
| 22.04.08 | 1.454 |
| 23.04.08 | 1.454 |
| 24.04.08 | 1.458 |
| 25.04.08 | 1.46 |
| 26.04.08 | 1.46 |
| 27.04.08 | 1.46 |
| 28.04.08 | 1.46 |
| 29.04.08 | 1.46 |
| 30.04.08 | 1.462 |
| 01.05.08 | 1.466 |
| 02.05.08 | 1.468 |
| 03.05.08 | 1.468 |
| 04.05.08 | 1.468 |
| 05.05.08 | 1.468 |
| 06.05.08 | 1.463 |
| 07.05.08 | 1.46 |
| 08.05.08 | 1.457 |
| 09.05.08 | 1.452 |
| 10.05.08 | 1.452 |
| 11.05.08 | 1.452 |
| 12.05.08 | 1.452 |
| 13.05.08 | 1.452 |
| 14.05.08 | 1.452 |
| 15.05.08 | 1.455 |
| 16.05.08 | 1.457 |
| 17.05.08 | 1.453 |
| 18.05.08 | 1.453 |
| 19.05.08 | 1.453 |
| 20.05.08 | 1.451 |
| 21.05.08 | 1.449 |
| 22.05.08 | 1.449 |
| 23.05.08 | 1.449 |
| 24.05.08 | 1.454 |
| 25.05.08 | 1.454 |
| 26.05.08 | 1.454 |
| 27.05.08 | 1.454 |
| 28.05.08 | 1.449 |
| 29.05.08 | 1.449 |
| 30.05.08 | 1.444 |
| 31.05.08 | 1.444 |
| 01.06.08 | 1.444 |
| 02.06.08 | 1.444 |
| 03.06.08 | 1.444 |
| 04.06.08 | 1.44 |
| 05.06.08 | 1.438 |
| 06.06.08 | 1.437 |
| 07.06.08 | 1.437 |
| 08.06.08 | 1.437 |
| 09.06.08 | 1.437 |
| 10.06.08 | 1.432 |
| 11.06.08 | 1.429 |
| 12.06.08 | 1.429 |
| 13.06.08 | 1.429 |
| 14.06.08 | 1.429 |
| 15.06.08 | 1.429 |
| 16.06.08 | 1.429 |
| 17.06.08 | 1.428 |
| 18.06.08 | 1.427 |
| 19.06.08 | 1.422 |
| 20.06.08 | 1.421 |
| 21.06.08 | 1.42 |
| 22.06.08 | 1.42 |
| 23.06.08 | 1.42 |
| 24.06.08 | 1.417 |
| 25.06.08 | 1.416 |
| 26.06.08 | 1.415 |
| 27.06.08 | 1.418 |
| 28.06.08 | 1.418 |
| 29.06.08 | 1.418 |
| 30.06.08 | 1.418 |
| 01.07.08 | 1.418 |
| 02.07.08 | 1.418 |
| 03.07.08 | 1.418 |
| 04.07.08 | 1.418 |
| 05.07.08 | 1.415 |
| 06.07.08 | 1.415 |
| 07.07.08 | 1.415 |
| 08.07.08 | 1.413 |
| 09.07.08 | 1.413 |
| 10.07.08 | 1.415 |
| 11.07.08 | 1.415 |
| 12.07.08 | 1.418 |
| 13.07.08 | 1.418 |
| 14.07.08 | 1.418 |
| 15.07.08 | 1.414 |
| 16.07.08 | 1.416 |
| 17.07.08 | 1.412 |
| 18.07.08 | 1.409 |
| 19.07.08 | 1.406 |
| 20.07.08 | 1.406 |
| 21.07.08 | 1.406 |
| 22.07.08 | 1.403 |
| 23.07.08 | 1.401 |
| 24.07.08 | 1.4 |
| 25.07.08 | 1.397 |
| 26.07.08 | 1.396 |
| 27.07.08 | 1.396 |
| 28.07.08 | 1.396 |
| 29.07.08 | 1.399 |
| 30.07.08 | 1.405 |
| 31.07.08 | 1.408 |
| 01.08.08 | 1.409 |
| 02.08.08 | 1.409 |
| 03.08.08 | 1.409 |
| 04.08.08 | 1.409 |
| 05.08.08 | 1.409 |
| 06.08.08 | 1.411 |
| 07.08.08 | 1.413 |
| 08.08.08 | 1.416 |
| 09.08.08 | 1.416 |
| 10.08.08 | 1.413 |
| 11.08.08 | 1.413 |
| 12.08.08 | 1.413 |
| 13.08.08 | 1.413 |
| 14.08.08 | 1.413 |
| 15.08.08 | 1.413 |
| 16.08.08 | 1.413 |
| 17.08.08 | 1.413 |
| 18.08.08 | 1.413 |
| 19.08.08 | 1.413 |
| 20.08.08 | 1.413 |
| 21.08.08 | 1.413 |
| 22.08.08 | 1.413 |
| 23.08.08 | 1.413 |
| 24.08.08 | 1.413 |
| 25.08.08 | 1.413 |
| 26.08.08 | 1.413 |
| 27.08.08 | 1.413 |
| 28.08.08 | 1.413 |
| 29.08.08 | 1.413 |
| 30.08.08 | 1.41 |
| 31.08.08 | 1.41 |
| 01.09.08 | 1.41 |
| 02.09.08 | 1.41 |
| 03.09.08 | 1.41 |
| 04.09.08 | 1.41 |
| 05.09.08 | 1.41 |
| 06.09.08 | 1.41 |
| 07.09.08 | 1.41 |
| 08.09.08 | 1.41 |
| 09.09.08 | 1.408 |
| 10.09.08 | 1.407 |
| 11.09.08 | 1.407 |
| 12.09.08 | 1.407 |
| 13.09.08 | 1.405 |
| 14.09.08 | 1.405 |
| 15.09.08 | 1.405 |
| 16.09.08 | 1.403 |
| 17.09.08 | 1.402 |
| 18.09.08 | 1.402 |
| 19.09.08 | 1.401 |
| 20.09.08 | 1.401 |
| 21.09.08 | 1.401 |
| 22.09.08 | 1.401 |
| 23.09.08 | 1.401 |
| 24.09.08 | 1.401 |
| 25.09.08 | 1.401 |
| 26.09.08 | 1.402 |
| 27.09.08 | 1.402 |
| 28.09.08 | 1.402 |
| 29.09.08 | 1.402 |
| 30.09.08 | 1.405 |
| 01.10.08 | 1.406 |
| 02.10.08 | 1.406 |
| 03.10.08 | 1.407 |
| 04.10.08 | 1.409 |
| 05.10.08 | 1.409 |
| 06.10.08 | 1.409 |
| 07.10.08 | 1.411 |
| 08.10.08 | 1.412 |
| 09.10.08 | 1.413 |
| 10.10.08 | 1.413 |
| 11.10.08 | 1.413 |
| 12.10.08 | 1.413 |
| 13.10.08 | 1.413 |
| 14.10.08 | 1.413 |
| 15.10.08 | 1.413 |
| 16.10.08 | 1.413 |
| 17.10.08 | 1.412 |
| 18.10.08 | 1.412 |
| 19.10.08 | 1.412 |
| 20.10.08 | 1.412 |
| 21.10.08 | 1.412 |
| 22.10.08 | 1.413 |
| 23.10.08 | 1.414 |
| 24.10.08 | 1.415 |
| 25.10.08 | 1.416 |
| 26.10.08 | 1.416 |
| 27.10.08 | 1.416 |
| 28.10.08 | 1.416 |
| 29.10.08 | 1.417 |
| 30.10.08 | 1.419 |
| 31.10.08 | 1.421 |
| 01.11.08 | 1.424 |
| 02.11.08 | 1.424 |
| 03.11.08 | 1.424 |
| 04.11.08 | 1.428 |
| 05.11.08 | 1.433 |
| 06.11.08 | 1.439 |
| 07.11.08 | 1.44 |
| 08.11.08 | 1.49 |
| 09.11.08 | 1.49 |
| 10.11.08 | 1.49 |
| 11.11.08 | 1.65 |
| 12.11.08 | 1.65 |
| 13.11.08 | 1.65 |
| 14.11.08 | 1.65 |
| 15.11.08 | 1.65 |
| 16.11.08 | 1.65 |
| 17.11.08 | 1.65 |
| 18.11.08 | 1.65 |
| 19.11.08 | 1.65 |
| 20.11.08 | 1.65 |
| 21.11.08 | 1.65 |
| 22.11.08 | 1.65 |
| 23.11.08 | 1.65 |
| 24.11.08 | 1.65 |
| 25.11.08 | 1.65 |
| 26.11.08 | 1.65 |
| 27.11.08 | 1.65 |
| 28.11.08 | 1.65 |
| 29.11.08 | 1.65 |
| 30.11.08 | 1.65 |
| 01.12.08 | 1.65 |
| 02.12.08 | 1.65 |
| 03.12.08 | 1.65 |
| 04.12.08 | 1.65 |
| 05.12.08 | 1.65 |
| 06.12.08 | 1.65 |
| 07.12.08 | 1.65 |
| 08.12.08 | 1.65 |
| 09.12.08 | 1.65 |
| 10.12.08 | 1.65 |
| 11.12.08 | 1.651 |
| 12.12.08 | 1.652 |
| 13.12.08 | 1.652 |
| 14.12.08 | 1.652 |
| 15.12.08 | 1.652 |
| 16.12.08 | 1.652 |
| 17.12.08 | 1.652 |
| 18.12.08 | 1.654 |
| 19.12.08 | 1.656 |
| 20.12.08 | 1.658 |
| 21.12.08 | 1.658 |
| 22.12.08 | 1.658 |
| 23.12.08 | 1.661 |
| 24.12.08 | 1.662 |
| 25.12.08 | 1.662 |
| 26.12.08 | 1.662 |
| 27.12.08 | 1.662 |
| 28.12.08 | 1.662 |
| 29.12.08 | 1.662 |
| 30.12.08 | 1.665 |
| 31.12.08 | 1.667 |
| 01.01.09 | 1.668 |
| 02.01.09 | 1.668 |
| 03.01.09 | 1.668 |
| 04.01.09 | 1.668 |
| 05.01.09 | 1.668 |
| 06.01.09 | 1.668 |
| 07.01.09 | 1.668 |
| 08.01.09 | 1.668 |
| 09.01.09 | 1.668 |
| 10.01.09 | 1.668 |
| 11.01.09 | 1.668 |
| 12.01.09 | 1.668 |
| 13.01.09 | 1.668 |
| 14.01.09 | 1.668 |
| 15.01.09 | 1.668 |
| 16.01.09 | 1.668 |
| 17.01.09 | 1.668 |
| 18.01.09 | 1.668 |
| 19.01.09 | 1.668 |
| 20.01.09 | 1.668 |
| 21.01.09 | 1.668 |
| 22.01.09 | 1.668 |
| 23.01.09 | 1.668 |
| 24.01.09 | 1.668 |
| 25.01.09 | 1.668 |
| 26.01.09 | 1.668 |
| 27.01.09 | 1.668 |
| 28.01.09 | 1.667 |
| 29.01.09 | 1.665 |
| 30.01.09 | 1.665 |
| 31.01.09 | 1.667 |
| 01.02.09 | 1.667 |
| 02.02.09 | 1.667 |
| 03.02.09 | 1.669 |
| 04.02.09 | 1.67 |
| 05.02.09 | 1.671 |
| 06.02.09 | 1.672 |
| 07.02.09 | 1.672 |
| 08.02.09 | 1.672 |
| 09.02.09 | 1.672 |
| 10.02.09 | 1.673 |
| 11.02.09 | 1.673 |
| 12.02.09 | 1.673 |
| 13.02.09 | 1.675 |
| 14.02.09 | 1.675 |
| 15.02.09 | 1.675 |
| 16.02.09 | 1.675 |
| 17.02.09 | 1.675 |
| 18.02.09 | 1.675 |
| 19.02.09 | 1.675 |
| 20.02.09 | 1.675 |
| 21.02.09 | 1.675 |
| 22.02.09 | 1.675 |
| 23.02.09 | 1.675 |
| 24.02.09 | 1.676 |
| 25.02.09 | 1.677 |
| 26.02.09 | 1.677 |
| 27.02.09 | 1.681 |
| 28.02.09 | 1.684 |
| 01.03.09 | 1.684 |
| 02.03.09 | 1.684 |
| 03.03.09 | 1.687 |
| 04.03.09 | 1.687 |
| 05.03.09 | 1.693 |
| 06.03.09 | 1.695 |
| 07.03.09 | 1.695 |
| 08.03.09 | 1.695 |
| 09.03.09 | 1.695 |
| 10.03.09 | 1.695 |
| 11.03.09 | 1.695 |
| 12.03.09 | 1.694 |
| 13.03.09 | 1.688 |
| 14.03.09 | 1.678 |
| 15.03.09 | 1.678 |
| 16.03.09 | 1.678 |
| 17.03.09 | 1.67 |
| 18.03.09 | 1.67 |
| 19.03.09 | 1.66 |
| 20.03.09 | 1.66 |
| 21.03.09 | 1.65 |
| 22.03.09 | 1.65 |
| 23.03.09 | 1.65 |
| 24.03.09 | 1.64 |
| 25.03.09 | 1.64 |
| 26.03.09 | 1.65 |
| 27.03.09 | 1.65 |
| 28.03.09 | 1.66 |
| 29.03.09 | 1.66 |
| 30.03.09 | 1.66 |
| 31.03.09 | 1.67 |
| 01.04.09 | 1.67 |
| 02.04.09 | 1.67 |
| 03.04.09 | 1.67 |
| 04.04.09 | 1.66 |
| 05.04.09 | 1.66 |
| 06.04.09 | 1.66 |
| 07.04.09 | 1.675 |
| 08.04.09 | 1.675 |
| 09.04.09 | 1.69 |
| 10.04.09 | 1.69 |
| 11.04.09 | 1.69 |
| 12.04.09 | 1.69 |
| 13.04.09 | 1.69 |
| 14.04.09 | 1.67 |
| 15.04.09 | 1.67 |
| 16.04.09 | 1.66 |
| 17.04.09 | 1.66 |
| 18.04.09 | 1.66 |
| 19.04.09 | 1.66 |
| 20.04.09 | 1.66 |
| 21.04.09 | 1.66 |
| 22.04.09 | 1.66 |
| 23.04.09 | 1.65 |
| 24.04.09 | 1.65 |
| 25.04.09 | 1.65 |
| 26.04.09 | 1.65 |
| 27.04.09 | 1.65 |
| 28.04.09 | 1.65 |
| 29.04.09 | 1.65 |
| 30.04.09 | 1.65 |
| 01.05.09 | 1.65 |
| 02.05.09 | 1.65 |
| 03.05.09 | 1.65 |
| 04.05.09 | 1.65 |
| 05.05.09 | 1.655 |
| 06.05.09 | 1.655 |
| 07.05.09 | 1.655 |
| 08.05.09 | 1.655 |
| 09.05.09 | 1.655 |
| 10.05.09 | 1.655 |
| 11.05.09 | 1.655 |
| 12.05.09 | 1.655 |
| 13.05.09 | 1.655 |
| 14.05.09 | 1.655 |
| 15.05.09 | 1.655 |
| 16.05.09 | 1.65 |
| 17.05.09 | 1.65 |
| 18.05.09 | 1.65 |
| 19.05.09 | 1.65 |
| 20.05.09 | 1.65 |
| 21.05.09 | 1.645 |
| 22.05.09 | 1.645 |
| 23.05.09 | 1.64 |
| 24.05.09 | 1.64 |
| 25.05.09 | 1.64 |
| 26.05.09 | 1.64 |
| 27.05.09 | 1.64 |
| 28.05.09 | 1.64 |
| 29.05.09 | 1.641 |
| 30.05.09 | 1.645 |
| 31.05.09 | 1.645 |
| 01.06.09 | 1.645 |
| 02.06.09 | 1.654 |
| 03.06.09 | 1.663 |
| 04.06.09 | 1.67 |
| 05.06.09 | 1.665 |
| 06.06.09 | 1.661 |
| 07.06.09 | 1.661 |
| 08.06.09 | 1.661 |
| 09.06.09 | 1.653 |
| 10.06.09 | 1.647 |
| 11.06.09 | 1.646 |
| 12.06.09 | 1.647 |
| 13.06.09 | 1.648 |
| 14.06.09 | 1.648 |
| 15.06.09 | 1.648 |
| 16.06.09 | 1.648 |
| 17.06.09 | 1.648 |
| 18.06.09 | 1.65 |
| 19.06.09 | 1.65 |
| 20.06.09 | 1.652 |
| 21.06.09 | 1.652 |
| 22.06.09 | 1.652 |
| 23.06.09 | 1.652 |
| 24.06.09 | 1.652 |
| 25.06.09 | 1.652 |
| 26.06.09 | 1.658 |
| 27.06.09 | 1.66 |
| 28.06.09 | 1.66 |
| 29.06.09 | 1.66 |
| 30.06.09 | 1.658 |
| 01.07.09 | 1.653 |
| 02.07.09 | 1.654 |
| 03.07.09 | 1.654 |
| 04.07.09 | 1.661 |
| 05.07.09 | 1.661 |
| 06.07.09 | 1.661 |
| 07.07.09 | 1.661 |
| 08.07.09 | 1.662 |
| 09.07.09 | 1.662 |
| 10.07.09 | 1.67 |
| 11.07.09 | 1.671 |
| 12.07.09 | 1.671 |
| 13.07.09 | 1.671 |
| 14.07.09 | 1.671 |
| 15.07.09 | 1.667 |
| 16.07.09 | 1.667 |
| 17.07.09 | 1.667 |
| 18.07.09 | 1.667 |
| 19.07.09 | 1.667 |
| 20.07.09 | 1.667 |
| 21.07.09 | 1.667 |
| 22.07.09 | 1.666 |
| 23.07.09 | 1.667 |
| 24.07.09 | 1.672 |
| 25.07.09 | 1.672 |
| 26.07.09 | 1.672 |
| 27.07.09 | 1.672 |
| 28.07.09 | 1.673 |
| 29.07.09 | 1.673 |
| 30.07.09 | 1.673 |
| 31.07.09 | 1.675 |
| 01.08.09 | 1.675 |
| 02.08.09 | 1.675 |
| 03.08.09 | 1.675 |
| 04.08.09 | 1.676 |
| 05.08.09 | 1.679 |
| 06.08.09 | 1.679 |
| 07.08.09 | 1.679 |
| 08.08.09 | 1.686 |
| 09.08.09 | 1.686 |
| 10.08.09 | 1.686 |
| 11.08.09 | 1.676 |
| 12.08.09 | 1.672 |
| 13.08.09 | 1.672 |
| 14.08.09 | 1.672 |
| 15.08.09 | 1.671 |
| 16.08.09 | 1.671 |
| 17.08.09 | 1.671 |
| 18.08.09 | 1.665 |
| 19.08.09 | 1.66 |
| 20.08.09 | 1.671 |
| 21.08.09 | 1.682 |
| 22.08.09 | 1.678 |
| 23.08.09 | 1.678 |
| 24.08.09 | 1.678 |
| 25.08.09 | 1.678 |
| 26.08.09 | 1.682 |
| 27.08.09 | 1.684 |
| 28.08.09 | 1.686 |
| 29.08.09 | 1.686 |
| 30.08.09 | 1.686 |
| 31.08.09 | 1.686 |
| 01.09.09 | 1.685 |
| 02.09.09 | 1.683 |
| 03.09.09 | 1.684 |
| 04.09.09 | 1.686 |
| 05.09.09 | 1.686 |
| 06.09.09 | 1.686 |
| 07.09.09 | 1.686 |
| 08.09.09 | 1.686 |
| 09.09.09 | 1.688 |
| 10.09.09 | 1.689 |
| 11.09.09 | 1.688 |
| 12.09.09 | 1.687 |
| 13.09.09 | 1.687 |
| 14.09.09 | 1.687 |
| 15.09.09 | 1.685 |
| 16.09.09 | 1.678 |
| 17.09.09 | 1.679 |
| 18.09.09 | 1.679 |
| 19.09.09 | 1.683 |
| 20.09.09 | 1.683 |
| 21.09.09 | 1.683 |
| 22.09.09 | 1.683 |
| 23.09.09 | 1.683 |
| 24.09.09 | 1.683 |
| 25.09.09 | 1.676 |
| 26.09.09 | 1.676 |
| 27.09.09 | 1.676 |
| 28.09.09 | 1.676 |
| 29.09.09 | 1.675 |
| 30.09.09 | 1.677 |
| 01.10.09 | 1.676 |
| 02.10.09 | 1.676 |
| 03.10.09 | 1.676 |
| 04.10.09 | 1.676 |
| 05.10.09 | 1.676 |
| 06.10.09 | 1.676 |
| 07.10.09 | 1.674 |
| 08.10.09 | 1.675 |
| 09.10.09 | 1.676 |
| 10.10.09 | 1.678 |
| 11.10.09 | 1.678 |
| 12.10.09 | 1.678 |
| 13.10.09 | 1.678 |
| 14.10.09 | 1.677 |
| 15.10.09 | 1.677 |
| 16.10.09 | 1.677 |
| 17.10.09 | 1.678 |
| 18.10.09 | 1.678 |
| 19.10.09 | 1.678 |
| 20.10.09 | 1.678 |
| 21.10.09 | 1.678 |
| 22.10.09 | 1.675 |
| 23.10.09 | 1.675 |
| 24.10.09 | 1.675 |
| 25.10.09 | 1.675 |
| 26.10.09 | 1.675 |
| 27.10.09 | 1.677 |
| 28.10.09 | 1.677 |
| 29.10.09 | 1.677 |
| 30.10.09 | 1.679 |
| 31.10.09 | 1.679 |
| 01.11.09 | 1.679 |
| 02.11.09 | 1.679 |
| 03.11.09 | 1.679 |
| 04.11.09 | 1.683 |
| 05.11.09 | 1.683 |
| 06.11.09 | 1.683 |
| 07.11.09 | 1.683 |
| 08.11.09 | 1.683 |
| 09.11.09 | 1.683 |
| 10.11.09 | 1.683 |
| 11.11.09 | 1.683 |
| 12.11.09 | 1.683 |
| 13.11.09 | 1.684 |
| 14.11.09 | 1.683 |
| 15.11.09 | 1.683 |
| 16.11.09 | 1.683 |
| 17.11.09 | 1.683 |
| 18.11.09 | 1.683 |
| 19.11.09 | 1.682 |
| 20.11.09 | 1.682 |
| 21.11.09 | 1.682 |
| 22.11.09 | 1.682 |
| 23.11.09 | 1.682 |
| 24.11.09 | 1.682 |
| 25.11.09 | 1.681 |
| 26.11.09 | 1.676 |
| 27.11.09 | 1.675 |
| 28.11.09 | 1.674 |
| 29.11.09 | 1.674 |
| 30.11.09 | 1.674 |
| 01.12.09 | 1.674 |
| 02.12.09 | 1.673 |
| 03.12.09 | 1.673 |
| 04.12.09 | 1.672 |
| 05.12.09 | 1.672 |
| 06.12.09 | 1.672 |
| 07.12.09 | 1.672 |
| 08.12.09 | 1.672 |
| 09.12.09 | 1.673 |
| 10.12.09 | 1.673 |
| 11.12.09 | 1.674 |
| 12.12.09 | 1.676 |
| 13.12.09 | 1.676 |
| 14.12.09 | 1.676 |
| 15.12.09 | 1.676 |
| 16.12.09 | 1.676 |
| 17.12.09 | 1.679 |
| 18.12.09 | 1.684 |
| 19.12.09 | 1.685 |
| 20.12.09 | 1.685 |
| 21.12.09 | 1.685 |
| 22.12.09 | 1.685 |
| 23.12.09 | 1.685 |
| 24.12.09 | 1.686 |
| 25.12.09 | 1.686 |
| 26.12.09 | 1.686 |
| 27.12.09 | 1.686 |
| 28.12.09 | 1.686 |
| 29.12.09 | 1.685 |
| 30.12.09 | 1.685 |
| 31.12.09 | 1.686 |
| 01.01.10 | 1.693 |
| 02.01.10 | 1.693 |
| 03.01.10 | 1.693 |
| 04.01.10 | 1.693 |
| 05.01.10 | 1.699 |
| 06.01.10 | 1.701 |
| 07.01.10 | 1.7 |
| 08.01.10 | 1.7 |
| 09.01.10 | 1.7 |
| 10.01.10 | 1.7 |
| 11.01.10 | 1.7 |
| 12.01.10 | 1.701 |
| 13.01.10 | 1.702 |
| 14.01.10 | 1.704 |
| 15.01.10 | 1.705 |
| 16.01.10 | 1.707 |
| 17.01.10 | 1.707 |
| 18.01.10 | 1.707 |
| 19.01.10 | 1.707 |
| 20.01.10 | 1.707 |
| 21.01.10 | 1.708 |
| 22.01.10 | 1.71 |
| 23.01.10 | 1.715 |
| 24.01.10 | 1.715 |
| 25.01.10 | 1.715 |
| 26.01.10 | 1.721 |
| 27.01.10 | 1.727 |
| 28.01.10 | 1.748 |
| 29.01.10 | 1.745 |
| 30.01.10 | 1.742 |
| 31.01.10 | 1.742 |
| 01.02.10 | 1.742 |
| 02.02.10 | 1.741 |
| 03.02.10 | 1.73 |
| 04.02.10 | 1.73 |
| 05.02.10 | 1.723 |
| 06.02.10 | 1.719 |
| 07.02.10 | 1.719 |
| 08.02.10 | 1.719 |
| 09.02.10 | 1.713 |
| 10.02.10 | 1.712 |
| 11.02.10 | 1.712 |
| 12.02.10 | 1.709 |
| 13.02.10 | 1.708 |
| 14.02.10 | 1.708 |
| 15.02.10 | 1.708 |
| 16.02.10 | 1.708 |
| 17.02.10 | 1.712 |
| 18.02.10 | 1.729 |
| 19.02.10 | 1.73 |
| 20.02.10 | 1.74 |
| 21.02.10 | 1.74 |
| 22.02.10 | 1.74 |
| 23.02.10 | 1.74 |
| 24.02.10 | 1.738 |
| 25.02.10 | 1.738 |
| 26.02.10 | 1.737 |
| 27.02.10 | 1.736 |
| 28.02.10 | 1.736 |
| 01.03.10 | 1.736 |
| 02.03.10 | 1.734 |
| 03.03.10 | 1.714 |
| 04.03.10 | 1.714 |
| 05.03.10 | 1.715 |
| 06.03.10 | 1.718 |
| 07.03.10 | 1.718 |
| 08.03.10 | 1.718 |
| 09.03.10 | 1.718 |
| 10.03.10 | 1.718 |
| 11.03.10 | 1.718 |
| 12.03.10 | 1.718 |
| 13.03.10 | 1.722 |
| 14.03.10 | 1.722 |
| 15.03.10 | 1.722 |
| 16.03.10 | 1.723 |
| 17.03.10 | 1.725 |
| 18.03.10 | 1.733 |
| 19.03.10 | 1.736 |
| 20.03.10 | 1.735 |
| 21.03.10 | 1.735 |
| 22.03.10 | 1.735 |
| 23.03.10 | 1.735 |
| 24.03.10 | 1.731 |
| 25.03.10 | 1.736 |
| 26.03.10 | 1.737 |
| 27.03.10 | 1.744 |
| 28.03.10 | 1.744 |
| 29.03.10 | 1.744 |
| 30.03.10 | 1.746 |
| 31.03.10 | 1.749 |
| 01.04.10 | 1.75 |
| 02.04.10 | 1.744 |
| 03.04.10 | 1.744 |
| 04.04.10 | 1.744 |
| 05.04.10 | 1.744 |
| 06.04.10 | 1.744 |
| 07.04.10 | 1.745 |
| 08.04.10 | 1.745 |
| 09.04.10 | 1.75 |
| 10.04.10 | 1.75 |
| 11.04.10 | 1.75 |
| 12.04.10 | 1.75 |
| 13.04.10 | 1.758 |
| 14.04.10 | 1.759 |
| 15.04.10 | 1.759 |
| 16.04.10 | 1.764 |
| 17.04.10 | 1.752 |
| 18.04.10 | 1.752 |
| 19.04.10 | 1.752 |
| 20.04.10 | 1.752 |
| 21.04.10 | 1.743 |
| 22.04.10 | 1.746 |
| 23.04.10 | 1.752 |
| 24.04.10 | 1.752 |
| 25.04.10 | 1.752 |
| 26.04.10 | 1.752 |
| 27.04.10 | 1.752 |
| 28.04.10 | 1.76 |
| 29.04.10 | 1.761 |
| 30.04.10 | 1.774 |
| 01.05.10 | 1.768 |
| 02.05.10 | 1.768 |
| 03.05.10 | 1.768 |
| 04.05.10 | 1.769 |
| 05.05.10 | 1.769 |
| 06.05.10 | 1.77 |
| 07.05.10 | 1.794 |
| 08.05.10 | 1.786 |
| 09.05.10 | 1.786 |
| 10.05.10 | 1.786 |
| 11.05.10 | 1.778 |
| 12.05.10 | 1.778 |
| 13.05.10 | 1.778 |
| 14.05.10 | 1.784 |
| 15.05.10 | 1.781 |
| 16.05.10 | 1.781 |
| 17.05.10 | 1.781 |
| 18.05.10 | 1.781 |
| 19.05.10 | 1.782 |
| 20.05.10 | 1.783 |
| 21.05.10 | 1.783 |
| 22.05.10 | 1.78 |
| 23.05.10 | 1.78 |
| 24.05.10 | 1.78 |
| 25.05.10 | 1.781 |
| 26.05.10 | 1.781 |
| 27.05.10 | 1.781 |
| 28.05.10 | 1.788 |
| 29.05.10 | 1.785 |
| 30.05.10 | 1.785 |
| 31.05.10 | 1.785 |
| 01.06.10 | 1.785 |
| 02.06.10 | 1.792 |
| 03.06.10 | 1.807 |
| 04.06.10 | 1.823 |
| 05.06.10 | 1.843 |
| 06.06.10 | 1.843 |
| 07.06.10 | 1.843 |
| 08.06.10 | 1.865 |
| 09.06.10 | 1.866 |
| 10.06.10 | 1.888 |
| 11.06.10 | 1.887 |
| 12.06.10 | 1.887 |
| 13.06.10 | 1.887 |
| 14.06.10 | 1.887 |
| 15.06.10 | 1.887 |
| 16.06.10 | 1.887 |
| 17.06.10 | 1.887 |
| 18.06.10 | 1.887 |
| 19.06.10 | 1.886 |
| 20.06.10 | 1.886 |
| 21.06.10 | 1.886 |
| 22.06.10 | 1.885 |
| 23.06.10 | 1.852 |
| 24.06.10 | 1.841 |
| 25.06.10 | 1.84 |
| 26.06.10 | 1.84 |
| 27.06.10 | 1.84 |
| 28.06.10 | 1.84 |
| 29.06.10 | 1.845 |
| 30.06.10 | 1.844 |
| 01.07.10 | 1.846 |
| 02.07.10 | 1.844 |
| 03.07.10 | 1.844 |
| 04.07.10 | 1.844 |
| 05.07.10 | 1.844 |
| 06.07.10 | 1.844 |
| 07.07.10 | 1.844 |
| 08.07.10 | 1.844 |
| 09.07.10 | 1.844 |
| 10.07.10 | 1.844 |
| 11.07.10 | 1.844 |
| 12.07.10 | 1.844 |
| 13.07.10 | 1.834 |
| 14.07.10 | 1.835 |
| 15.07.10 | 1.836 |
| 16.07.10 | 1.846 |
| 17.07.10 | 1.846 |
| 18.07.10 | 1.846 |
| 19.07.10 | 1.846 |
| 20.07.10 | 1.839 |
| 21.07.10 | 1.842 |
| 22.07.10 | 1.842 |
| 23.07.10 | 1.846 |
| 24.07.10 | 1.845 |
| 25.07.10 | 1.845 |
| 26.07.10 | 1.845 |
| 27.07.10 | 1.842 |
| 28.07.10 | 1.842 |
| 29.07.10 | 1.841 |
| 30.07.10 | 1.841 |
| 31.07.10 | 1.839 |
| 01.08.10 | 1.839 |
| 02.08.10 | 1.839 |
| 03.08.10 | 1.839 |
| 04.08.10 | 1.838 |
| 05.08.10 | 1.838 |
| 06.08.10 | 1.84 |
| 07.08.10 | 1.841 |
| 08.08.10 | 1.841 |
| 09.08.10 | 1.841 |
| 10.08.10 | 1.841 |
| 11.08.10 | 1.84 |
| 12.08.10 | 1.841 |
| 13.08.10 | 1.846 |
| 14.08.10 | 1.849 |
| 15.08.10 | 1.849 |
| 16.08.10 | 1.849 |
| 17.08.10 | 1.85 |
| 18.08.10 | 1.847 |
| 19.08.10 | 1.844 |
| 20.08.10 | 1.843 |
| 21.08.10 | 1.836 |
| 22.08.10 | 1.836 |
| 23.08.10 | 1.836 |
| 24.08.10 | 1.828 |
| 25.08.10 | 1.828 |
| 26.08.10 | 1.828 |
| 27.08.10 | 1.827 |
| 28.08.10 | 1.844 |
| 29.08.10 | 1.844 |
| 30.08.10 | 1.844 |
| 31.08.10 | 1.833 |
| 01.09.10 | 1.831 |
| 02.09.10 | 1.839 |
| 03.09.10 | 1.84 |
| 04.09.10 | 1.842 |
| 05.09.10 | 1.842 |
| 06.09.10 | 1.842 |
| 07.09.10 | 1.841 |
| 08.09.10 | 1.845 |
| 09.09.10 | 1.851 |
| 10.09.10 | 1.854 |
| 11.09.10 | 1.853 |
| 12.09.10 | 1.853 |
| 13.09.10 | 1.853 |
| 14.09.10 | 1.842 |
| 15.09.10 | 1.84 |
| 16.09.10 | 1.841 |
| 17.09.10 | 1.843 |
| 18.09.10 | 1.839 |
| 19.09.10 | 1.839 |
| 20.09.10 | 1.839 |
| 21.09.10 | 1.832 |
| 22.09.10 | 1.83 |
| 23.09.10 | 1.821 |
| 24.09.10 | 1.808 |
| 25.09.10 | 1.803 |
| 26.09.10 | 1.803 |
| 27.09.10 | 1.803 |
| 28.09.10 | 1.801 |
| 29.09.10 | 1.799 |
| 30.09.10 | 1.806 |
| 01.10.10 | 1.806 |
| 02.10.10 | 1.806 |
| 03.10.10 | 1.806 |
| 04.10.10 | 1.806 |
| 05.10.10 | 1.806 |
| 06.10.10 | 1.808 |
| 07.10.10 | 1.808 |
| 08.10.10 | 1.81 |
| 09.10.10 | 1.808 |
| 10.10.10 | 1.808 |
| 11.10.10 | 1.808 |
| 12.10.10 | 1.806 |
| 13.10.10 | 1.799 |
| 14.10.10 | 1.799 |
| 15.10.10 | 1.799 |
| 16.10.10 | 1.792 |
| 17.10.10 | 1.792 |
| 18.10.10 | 1.792 |
| 19.10.10 | 1.787 |
| 20.10.10 | 1.789 |
| 21.10.10 | 1.786 |
| 22.10.10 | 1.782 |
| 23.10.10 | 1.774 |
| 24.10.10 | 1.774 |
| 25.10.10 | 1.774 |
| 26.10.10 | 1.781 |
| 27.10.10 | 1.782 |
| 28.10.10 | 1.781 |
| 29.10.10 | 1.775 |
| 30.10.10 | 1.778 |
| 31.10.10 | 1.778 |
| 01.11.10 | 1.778 |
| 02.11.10 | 1.78 |
| 03.11.10 | 1.771 |
| 04.11.10 | 1.771 |
| 05.11.10 | 1.764 |
| 06.11.10 | 1.761 |
| 07.11.10 | 1.761 |
| 08.11.10 | 1.761 |
| 09.11.10 | 1.76 |
| 10.11.10 | 1.768 |
| 11.11.10 | 1.767 |
| 12.11.10 | 1.763 |
| 13.11.10 | 1.761 |
| 14.11.10 | 1.761 |
| 15.11.10 | 1.761 |
| 16.11.10 | 1.763 |
| 17.11.10 | 1.764 |
| 18.11.10 | 1.764 |
| 19.11.10 | 1.758 |
| 20.11.10 | 1.754 |
| 21.11.10 | 1.754 |
| 22.11.10 | 1.754 |
| 23.11.10 | 1.753 |
| 24.11.10 | 1.753 |
| 25.11.10 | 1.765 |
| 26.11.10 | 1.764 |
| 27.11.10 | 1.761 |
| 28.11.10 | 1.761 |
| 29.11.10 | 1.761 |
| 30.11.10 | 1.759 |
| 01.12.10 | 1.767 |
| 02.12.10 | 1.767 |
| 03.12.10 | 1.762 |
| 04.12.10 | 1.761 |
| 05.12.10 | 1.761 |
| 06.12.10 | 1.761 |
| 07.12.10 | 1.76 |
| 08.12.10 | 1.761 |
| 09.12.10 | 1.763 |
| 10.12.10 | 1.771 |
| 11.12.10 | 1.77 |
| 12.12.10 | 1.77 |
| 13.12.10 | 1.77 |
| 14.12.10 | 1.765 |
| 15.12.10 | 1.762 |
| 16.12.10 | 1.764 |
| 17.12.10 | 1.764 |
| 18.12.10 | 1.762 |
| 19.12.10 | 1.762 |
| 20.12.10 | 1.762 |
| 21.12.10 | 1.759 |
| 22.12.10 | 1.758 |
| 23.12.10 | 1.758 |
| 24.12.10 | 1.762 |
| 25.12.10 | 1.759 |
| 26.12.10 | 1.759 |
| 27.12.10 | 1.759 |
| 28.12.10 | 1.755 |
| 29.12.10 | 1.762 |
| 30.12.10 | 1.768 |
| 31.12.10 | 1.773 |
| 01.01.11 | 1.774 |
| 02.01.11 | 1.774 |
| 03.01.11 | 1.774 |
| 04.01.11 | 1.774 |
| 05.01.11 | 1.774 |
| 06.01.11 | 1.774 |
| 07.01.11 | 1.774 |
| 08.01.11 | 1.774 |
| 09.01.11 | 1.774 |
| 10.01.11 | 1.774 |
| 11.01.11 | 1.782 |
| 12.01.11 | 1.793 |
| 13.01.11 | 1.802 |
| 14.01.11 | 1.802 |
| 15.01.11 | 1.811 |
| 16.01.11 | 1.811 |
| 17.01.11 | 1.811 |
| 18.01.11 | 1.811 |
| 19.01.11 | 1.809 |
| 20.01.11 | 1.809 |
| 21.01.11 | 1.809 |
| 22.01.11 | 1.808 |
| 23.01.11 | 1.808 |
| 24.01.11 | 1.808 |
| 25.01.11 | 1.809 |
| 26.01.11 | 1.808 |
| 27.01.11 | 1.808 |
| 28.01.11 | 1.809 |
| 29.01.11 | 1.809 |
| 30.01.11 | 1.809 |
| 31.01.11 | 1.809 |
| 01.02.11 | 1.81 |
| 02.02.11 | 1.8 |
| 03.02.11 | 1.803 |
| 04.02.11 | 1.802 |
| 05.02.11 | 1.797 |
| 06.02.11 | 1.797 |
| 07.02.11 | 1.797 |
| 08.02.11 | 1.796 |
| 09.02.11 | 1.776 |
| 10.02.11 | 1.781 |
| 11.02.11 | 1.78 |
| 12.02.11 | 1.774 |
| 13.02.11 | 1.774 |
| 14.02.11 | 1.774 |
| 15.02.11 | 1.776 |
| 16.02.11 | 1.776 |
| 17.02.11 | 1.77 |
| 18.02.11 | 1.769 |
| 19.02.11 | 1.764 |
| 20.02.11 | 1.764 |
| 21.02.11 | 1.764 |
| 22.02.11 | 1.749 |
| 23.02.11 | 1.757 |
| 24.02.11 | 1.751 |
| 25.02.11 | 1.758 |
| 26.02.11 | 1.757 |
| 27.02.11 | 1.757 |
| 28.02.11 | 1.757 |
| 01.03.11 | 1.741 |
| 02.03.11 | 1.732 |
| 03.03.11 | 1.729 |
| 04.03.11 | 1.729 |
| 05.03.11 | 1.72 |
| 06.03.11 | 1.72 |
| 07.03.11 | 1.72 |
| 08.03.11 | 1.719 |
| 09.03.11 | 1.719 |
| 10.03.11 | 1.713 |
| 11.03.11 | 1.701 |
| 12.03.11 | 1.713 |
| 13.03.11 | 1.713 |
| 14.03.11 | 1.713 |
| 15.03.11 | 1.703 |
| 16.03.11 | 1.704 |
| 17.03.11 | 1.71 |
| 18.03.11 | 1.709 |
| 19.03.11 | 1.707 |
| 20.03.11 | 1.707 |
| 21.03.11 | 1.707 |
| 22.03.11 | 1.704 |
| 23.03.11 | 1.698 |
| 24.03.11 | 1.7 |
| 25.03.11 | 1.704 |
| 26.03.11 | 1.711 |
| 27.03.11 | 1.711 |
| 28.03.11 | 1.711 |
| 29.03.11 | 1.708 |
| 30.03.11 | 1.698 |
| 31.03.11 | 1.706 |
| 01.04.11 | 1.706 |
| 02.04.11 | 1.7 |
| 03.04.11 | 1.7 |
| 04.04.11 | 1.7 |
| 05.04.11 | 1.7 |
| 06.04.11 | 1.689 |
| 07.04.11 | 1.688 |
| 08.04.11 | 1.678 |
| 09.04.11 | 1.683 |
| 10.04.11 | 1.683 |
| 11.04.11 | 1.683 |
| 12.04.11 | 1.645 |
| 13.04.11 | 1.665 |
| 14.04.11 | 1.669 |
| 15.04.11 | 1.667 |
| 16.04.11 | 1.655 |
| 17.04.11 | 1.655 |
| 18.04.11 | 1.655 |
| 19.04.11 | 1.657 |
| 20.04.11 | 1.644 |
| 21.04.11 | 1.645 |
| 22.04.11 | 1.645 |
| 23.04.11 | 1.645 |
| 24.04.11 | 1.645 |
| 25.04.11 | 1.645 |
| 26.04.11 | 1.645 |
| 27.04.11 | 1.642 |
| 28.04.11 | 1.641 |
| 29.04.11 | 1.639 |
| 30.04.11 | 1.641 |
| 01.05.11 | 1.641 |
| 02.05.11 | 1.641 |
| 03.05.11 | 1.646 |
| 04.05.11 | 1.658 |
| 05.05.11 | 1.677 |
| 06.05.11 | 1.693 |
| 07.05.11 | 1.684 |
| 08.05.11 | 1.684 |
| 09.05.11 | 1.684 |
| 10.05.11 | 1.684 |
| 11.05.11 | 1.684 |
| 12.05.11 | 1.686 |
| 13.05.11 | 1.686 |
| 14.05.11 | 1.688 |
| 15.05.11 | 1.688 |
| 16.05.11 | 1.688 |
| 17.05.11 | 1.687 |
| 18.05.11 | 1.684 |
| 19.05.11 | 1.684 |
| 20.05.11 | 1.677 |
| 21.05.11 | 1.677 |
| 22.05.11 | 1.677 |
| 23.05.11 | 1.677 |
| 24.05.11 | 1.677 |
| 25.05.11 | 1.676 |
| 26.05.11 | 1.68 |
| 27.05.11 | 1.68 |
| 28.05.11 | 1.666 |
| 29.05.11 | 1.666 |
| 30.05.11 | 1.666 |
| 31.05.11 | 1.666 |
| 01.06.11 | 1.666 |
| 02.06.11 | 1.665 |
| 03.06.11 | 1.664 |
| 04.06.11 | 1.664 |
| 05.06.11 | 1.664 |
| 06.06.11 | 1.664 |
| 07.06.11 | 1.658 |
| 08.06.11 | 1.655 |
| 09.06.11 | 1.658 |
| 10.06.11 | 1.658 |
| 11.06.11 | 1.656 |
| 12.06.11 | 1.656 |
| 13.06.11 | 1.656 |
| 14.06.11 | 1.654 |
| 15.06.11 | 1.654 |
| 16.06.11 | 1.651 |
| 17.06.11 | 1.648 |
| 18.06.11 | 1.644 |
| 19.06.11 | 1.644 |
| 20.06.11 | 1.644 |
| 21.06.11 | 1.643 |
| 22.06.11 | 1.642 |
| 23.06.11 | 1.642 |
| 24.06.11 | 1.651 |
| 25.06.11 | 1.653 |
| 26.06.11 | 1.653 |
| 27.06.11 | 1.653 |
| 28.06.11 | 1.654 |
| 29.06.11 | 1.665 |
| 30.06.11 | 1.666 |
| 01.07.11 | 1.663 |
| 02.07.11 | 1.663 |
| 03.07.11 | 1.663 |
| 04.07.11 | 1.663 |
| 05.07.11 | 1.665 |
| 06.07.11 | 1.666 |
| 07.07.11 | 1.669 |
| 08.07.11 | 1.67 |
| 09.07.11 | 1.672 |
| 10.07.11 | 1.672 |
| 11.07.11 | 1.672 |
| 12.07.11 | 1.674 |
| 13.07.11 | 1.677 |
| 14.07.11 | 1.682 |
| 15.07.11 | 1.684 |
| 16.07.11 | 1.68 |
| 17.07.11 | 1.68 |
| 18.07.11 | 1.68 |
| 19.07.11 | 1.678 |
| 20.07.11 | 1.662 |
| 21.07.11 | 1.662 |
| 22.07.11 | 1.656 |
| 23.07.11 | 1.659 |
| 24.07.11 | 1.659 |
| 25.07.11 | 1.659 |
| 26.07.11 | 1.646 |
| 27.07.11 | 1.646 |
| 28.07.11 | 1.653 |
| 29.07.11 | 1.653 |
| 30.07.11 | 1.655 |
| 31.07.11 | 1.655 |
| 01.08.11 | 1.655 |
| 02.08.11 | 1.653 |
| 03.08.11 | 1.646 |
| 04.08.11 | 1.647 |
| 05.08.11 | 1.66 |
| 06.08.11 | 1.665 |
| 07.08.11 | 1.665 |
| 08.08.11 | 1.665 |
| 09.08.11 | 1.66 |
| 10.08.11 | 1.654 |
| 11.08.11 | 1.656 |
| 12.08.11 | 1.657 |
| 13.08.11 | 1.65 |
| 14.08.11 | 1.65 |
| 15.08.11 | 1.65 |
| 16.08.11 | 1.65 |
| 17.08.11 | 1.65 |
| 18.08.11 | 1.649 |
| 19.08.11 | 1.648 |
| 20.08.11 | 1.644 |
| 21.08.11 | 1.644 |
| 22.08.11 | 1.644 |
| 23.08.11 | 1.642 |
| 24.08.11 | 1.648 |
| 25.08.11 | 1.648 |
| 26.08.11 | 1.647 |
| 27.08.11 | 1.645 |
| 28.08.11 | 1.645 |
| 29.08.11 | 1.645 |
| 30.08.11 | 1.646 |
| 31.08.11 | 1.646 |
| 01.09.11 | 1.647 |
| 02.09.11 | 1.657 |
| 03.09.11 | 1.662 |
| 04.09.11 | 1.662 |
| 05.09.11 | 1.662 |
| 06.09.11 | 1.662 |
| 07.09.11 | 1.662 |
| 08.09.11 | 1.662 |
| 09.09.11 | 1.663 |
| 10.09.11 | 1.663 |
| 11.09.11 | 1.663 |
| 12.09.11 | 1.663 |
| 13.09.11 | 1.663 |
| 14.09.11 | 1.664 |
| 15.09.11 | 1.664 |
| 16.09.11 | 1.664 |
| 17.09.11 | 1.663 |
| 18.09.11 | 1.663 |
| 19.09.11 | 1.663 |
| 20.09.11 | 1.662 |
| 21.09.11 | 1.663 |
| 22.09.11 | 1.663 |
| 23.09.11 | 1.663 |
| 24.09.11 | 1.663 |
| 25.09.11 | 1.663 |
| 26.09.11 | 1.663 |
| 27.09.11 | 1.663 |
| 28.09.11 | 1.662 |
| 29.09.11 | 1.661 |
| 30.09.11 | 1.661 |
| 01.10.11 | 1.669 |
| 02.10.11 | 1.669 |
| 03.10.11 | 1.669 |
| 04.10.11 | 1.669 |
| 05.10.11 | 1.67 |
| 06.10.11 | 1.671 |
| 07.10.11 | 1.655 |
| 08.10.11 | 1.655 |
| 09.10.11 | 1.655 |
| 10.10.11 | 1.655 |
| 11.10.11 | 1.654 |
| 12.10.11 | 1.661 |
| 13.10.11 | 1.659 |
| 14.10.11 | 1.654 |
| 15.10.11 | 1.654 |
| 16.10.11 | 1.654 |
| 17.10.11 | 1.654 |
| 18.10.11 | 1.654 |
| 19.10.11 | 1.657 |
| 20.10.11 | 1.662 |
| 21.10.11 | 1.662 |
| 22.10.11 | 1.662 |
| 23.10.11 | 1.662 |
| 24.10.11 | 1.662 |
| 25.10.11 | 1.657 |
| 26.10.11 | 1.665 |
| 27.10.11 | 1.665 |
| 28.10.11 | 1.66 |
| 29.10.11 | 1.659 |
| 30.10.11 | 1.659 |
| 31.10.11 | 1.659 |
| 01.11.11 | 1.655 |
| 02.11.11 | 1.657 |
| 03.11.11 | 1.662 |
| 04.11.11 | 1.662 |
| 05.11.11 | 1.659 |
| 06.11.11 | 1.659 |
| 07.11.11 | 1.659 |
| 08.11.11 | 1.659 |
| 09.11.11 | 1.659 |
| 10.11.11 | 1.66 |
| 11.11.11 | 1.66 |
| 12.11.11 | 1.659 |
| 13.11.11 | 1.659 |
| 14.11.11 | 1.659 |
| 15.11.11 | 1.66 |
| 16.11.11 | 1.658 |
| 17.11.11 | 1.657 |
| 18.11.11 | 1.657 |
| 19.11.11 | 1.654 |
| 20.11.11 | 1.654 |
| 21.11.11 | 1.654 |
| 22.11.11 | 1.658 |
| 23.11.11 | 1.658 |
| 24.11.11 | 1.658 |
| 25.11.11 | 1.662 |
| 26.11.11 | 1.661 |
| 27.11.11 | 1.661 |
| 28.11.11 | 1.661 |
| 29.11.11 | 1.658 |
| 30.11.11 | 1.658 |
| 01.12.11 | 1.658 |
| 02.12.11 | 1.661 |
| 03.12.11 | 1.66 |
| 04.12.11 | 1.66 |
| 05.12.11 | 1.66 |
| 06.12.11 | 1.658 |
| 07.12.11 | 1.658 |
| 08.12.11 | 1.658 |
| 09.12.11 | 1.658 |
| 10.12.11 | 1.658 |
| 11.12.11 | 1.658 |
| 12.12.11 | 1.658 |
| 13.12.11 | 1.656 |
| 14.12.11 | 1.656 |
| 15.12.11 | 1.658 |
| 16.12.11 | 1.658 |
| 17.12.11 | 1.656 |
| 18.12.11 | 1.656 |
| 19.12.11 | 1.656 |
| 20.12.11 | 1.656 |
| 21.12.11 | 1.657 |
| 22.12.11 | 1.657 |
| 23.12.11 | 1.655 |
| 24.12.11 | 1.657 |
| 25.12.11 | 1.657 |
| 26.12.11 | 1.657 |
| 27.12.11 | 1.664 |
| 28.12.11 | 1.679 |
| 29.12.11 | 1.681 |
| 30.12.11 | 1.68 |
| 31.12.11 | 1.67 |
| 01.01.12 | 1.67 |
| 02.01.12 | 1.67 |
| 03.01.12 | 1.67 |
| 04.01.12 | 1.668 |
| 05.01.12 | 1.666 |
| 06.01.12 | 1.666 |
| 07.01.12 | 1.668 |
| 08.01.12 | 1.668 |
| 09.01.12 | 1.668 |
| 10.01.12 | 1.668 |
| 11.01.12 | 1.669 |
| 12.01.12 | 1.669 |
| 13.01.12 | 1.67 |
| 14.01.12 | 1.67 |
| 15.01.12 | 1.67 |
| 16.01.12 | 1.67 |
| 17.01.12 | 1.672 |
| 18.01.12 | 1.671 |
| 19.01.12 | 1.67 |
| 20.01.12 | 1.67 |
| 21.01.12 | 1.671 |
| 22.01.12 | 1.671 |
| 23.01.12 | 1.671 |
| 24.01.12 | 1.67 |
| 25.01.12 | 1.668 |
| 26.01.12 | 1.668 |
| 27.01.12 | 1.668 |
| 28.01.12 | 1.669 |
| 29.01.12 | 1.669 |
| 30.01.12 | 1.669 |
| 31.01.12 | 1.669 |
| 01.02.12 | 1.67 |
| 02.02.12 | 1.669 |
| 03.02.12 | 1.669 |
| 04.02.12 | 1.669 |
| 05.02.12 | 1.669 |
| 06.02.12 | 1.669 |
| 07.02.12 | 1.668 |
| 08.02.12 | 1.668 |
| 09.02.12 | 1.668 |
| 10.02.12 | 1.667 |
| 11.02.12 | 1.667 |
| 12.02.12 | 1.667 |
| 13.02.12 | 1.667 |
| 14.02.12 | 1.663 |
| 15.02.12 | 1.662 |
| 16.02.12 | 1.662 |
| 17.02.12 | 1.66 |
| 18.02.12 | 1.657 |
| 19.02.12 | 1.657 |
| 20.02.12 | 1.657 |
| 21.02.12 | 1.641 |
| 22.02.12 | 1.638 |
| 23.02.12 | 1.619 |
| 24.02.12 | 1.624 |
| 25.02.12 | 1.648 |
| 26.02.12 | 1.648 |
| 27.02.12 | 1.648 |
| 28.02.12 | 1.654 |
| 29.02.12 | 1.664 |
| 01.03.12 | 1.669 |
| 02.03.12 | 1.675 |
| 03.03.12 | 1.672 |
| 04.03.12 | 1.672 |
| 05.03.12 | 1.672 |
| 06.03.12 | 1.663 |
| 07.03.12 | 1.659 |
| 08.03.12 | 1.658 |
| 09.03.12 | 1.658 |
| 10.03.12 | 1.655 |
| 11.03.12 | 1.655 |
| 12.03.12 | 1.655 |
| 13.03.12 | 1.652 |
| 14.03.12 | 1.652 |
| 15.03.12 | 1.65 |
| 16.03.12 | 1.65 |
| 17.03.12 | 1.649 |
| 18.03.12 | 1.649 |
| 19.03.12 | 1.649 |
| 20.03.12 | 1.647 |
| 21.03.12 | 1.643 |
| 22.03.12 | 1.642 |
| 23.03.12 | 1.64 |
| 24.03.12 | 1.638 |
| 25.03.12 | 1.638 |
| 26.03.12 | 1.638 |
| 27.03.12 | 1.639 |
| 28.03.12 | 1.642 |
| 29.03.12 | 1.652 |
| 30.03.12 | 1.66 |
| 31.03.12 | 1.66 |
| 01.04.12 | 1.66 |
| 02.04.12 | 1.66 |
| 03.04.12 | 1.643 |
| 04.04.12 | 1.645 |
| 05.04.12 | 1.645 |
| 06.04.12 | 1.642 |
| 07.04.12 | 1.639 |
| 08.04.12 | 1.639 |
| 09.04.12 | 1.639 |
| 10.04.12 | 1.639 |
| 11.04.12 | 1.637 |
| 12.04.12 | 1.639 |
| 13.04.12 | 1.638 |
| 14.04.12 | 1.638 |
| 15.04.12 | 1.638 |
| 16.04.12 | 1.638 |
| 17.04.12 | 1.638 |
| 18.04.12 | 1.634 |
| 19.04.12 | 1.633 |
| 20.04.12 | 1.633 |
| 21.04.12 | 1.63 |
| 22.04.12 | 1.63 |
| 23.04.12 | 1.63 |
| 24.04.12 | 1.628 |
| 25.04.12 | 1.628 |
| 26.04.12 | 1.628 |
| 27.04.12 | 1.628 |
| 28.04.12 | 1.627 |
| 29.04.12 | 1.627 |
| 30.04.12 | 1.627 |
| 01.05.12 | 1.628 |
| 02.05.12 | 1.633 |
| 03.05.12 | 1.632 |
| 04.05.12 | 1.631 |
| 05.05.12 | 1.63 |
| 06.05.12 | 1.63 |
| 07.05.12 | 1.63 |
| 08.05.12 | 1.626 |
| 09.05.12 | 1.626 |
| 10.05.12 | 1.626 |
| 11.05.12 | 1.622 |
| 12.05.12 | 1.62 |
| 13.05.12 | 1.62 |
| 14.05.12 | 1.62 |
| 15.05.12 | 1.621 |
| 16.05.12 | 1.621 |
| 17.05.12 | 1.628 |
| 18.05.12 | 1.628 |
| 19.05.12 | 1.622 |
| 20.05.12 | 1.622 |
| 21.05.12 | 1.622 |
| 22.05.12 | 1.621 |
| 23.05.12 | 1.631 |
| 24.05.12 | 1.634 |
| 25.05.12 | 1.63 |
| 26.05.12 | 1.629 |
| 27.05.12 | 1.629 |
| 28.05.12 | 1.629 |
| 29.05.12 | 1.626 |
| 30.05.12 | 1.626 |
| 31.05.12 | 1.626 |
| 01.06.12 | 1.627 |
| 02.06.12 | 1.633 |
| 03.06.12 | 1.633 |
| 04.06.12 | 1.633 |
| 05.06.12 | 1.632 |
| 06.06.12 | 1.632 |
| 07.06.12 | 1.632 |
| 08.06.12 | 1.631 |
| 09.06.12 | 1.634 |
| 10.06.12 | 1.634 |
| 11.06.12 | 1.634 |
| 12.06.12 | 1.634 |
| 13.06.12 | 1.634 |
| 14.06.12 | 1.634 |
| 15.06.12 | 1.637 |
| 16.06.12 | 1.636 |
| 17.06.12 | 1.636 |
| 18.06.12 | 1.636 |
| 19.06.12 | 1.63 |
| 20.06.12 | 1.629 |
| 21.06.12 | 1.629 |
| 22.06.12 | 1.634 |
| 23.06.12 | 1.642 |
| 24.06.12 | 1.642 |
| 25.06.12 | 1.642 |
| 26.06.12 | 1.638 |
| 27.06.12 | 1.638 |
| 28.06.12 | 1.637 |
| 29.06.12 | 1.642 |
| 30.06.12 | 1.645 |
| 01.07.12 | 1.645 |
| 02.07.12 | 1.645 |
| 03.07.12 | 1.644 |
| 04.07.12 | 1.645 |
| 05.07.12 | 1.645 |
| 06.07.12 | 1.645 |
| 07.07.12 | 1.647 |
| 08.07.12 | 1.647 |
| 09.07.12 | 1.647 |
| 10.07.12 | 1.648 |
| 11.07.12 | 1.649 |
| 12.07.12 | 1.654 |
| 13.07.12 | 1.656 |
| 14.07.12 | 1.651 |
| 15.07.12 | 1.651 |
| 16.07.12 | 1.651 |
| 17.07.12 | 1.642 |
| 18.07.12 | 1.642 |
| 19.07.12 | 1.652 |
| 20.07.12 | 1.656 |
| 21.07.12 | 1.659 |
| 22.07.12 | 1.659 |
| 23.07.12 | 1.659 |
| 24.07.12 | 1.659 |
| 25.07.12 | 1.662 |
| 26.07.12 | 1.66 |
| 27.07.12 | 1.662 |
| 28.07.12 | 1.659 |
| 29.07.12 | 1.659 |
| 30.07.12 | 1.659 |
| 31.07.12 | 1.659 |
| 01.08.12 | 1.659 |
| 02.08.12 | 1.652 |
| 03.08.12 | 1.652 |
| 04.08.12 | 1.65 |
| 05.08.12 | 1.65 |
| 06.08.12 | 1.65 |
| 07.08.12 | 1.65 |
| 08.08.12 | 1.646 |
| 09.08.12 | 1.644 |
| 10.08.12 | 1.644 |
| 11.08.12 | 1.643 |
| 12.08.12 | 1.643 |
| 13.08.12 | 1.643 |
| 14.08.12 | 1.643 |
| 15.08.12 | 1.642 |
| 16.08.12 | 1.642 |
| 17.08.12 | 1.645 |
| 18.08.12 | 1.645 |
| 19.08.12 | 1.645 |
| 20.08.12 | 1.645 |
| 21.08.12 | 1.644 |
| 22.08.12 | 1.643 |
| 23.08.12 | 1.644 |
| 24.08.12 | 1.647 |
| 25.08.12 | 1.649 |
| 26.08.12 | 1.649 |
| 27.08.12 | 1.649 |
| 28.08.12 | 1.651 |
| 29.08.12 | 1.651 |
| 30.08.12 | 1.655 |
| 31.08.12 | 1.661 |
| 01.09.12 | 1.657 |
| 02.09.12 | 1.657 |
| 03.09.12 | 1.657 |
| 04.09.12 | 1.656 |
| 05.09.12 | 1.655 |
| 06.09.12 | 1.656 |
| 07.09.12 | 1.656 |
| 08.09.12 | 1.656 |
| 09.09.12 | 1.656 |
| 10.09.12 | 1.656 |
| 11.09.12 | 1.652 |
| 12.09.12 | 1.645 |
| 13.09.12 | 1.646 |
| 14.09.12 | 1.649 |
| 15.09.12 | 1.647 |
| 16.09.12 | 1.647 |
| 17.09.12 | 1.647 |
| 18.09.12 | 1.647 |
| 19.09.12 | 1.646 |
| 20.09.12 | 1.651 |
| 21.09.12 | 1.655 |
| 22.09.12 | 1.658 |
| 23.09.12 | 1.658 |
| 24.09.12 | 1.658 |
| 25.09.12 | 1.659 |
| 26.09.12 | 1.662 |
| 27.09.12 | 1.655 |
| 28.09.12 | 1.655 |
| 29.09.12 | 1.659 |
| 30.09.12 | 1.659 |
| 01.10.12 | 1.659 |
| 02.10.12 | 1.659 |
| 03.10.12 | 1.66 |
| 04.10.12 | 1.661 |
| 05.10.12 | 1.661 |
| 06.10.12 | 1.661 |
| 07.10.12 | 1.661 |
| 08.10.12 | 1.661 |
| 09.10.12 | 1.661 |
| 10.10.12 | 1.66 |
| 11.10.12 | 1.66 |
| 12.10.12 | 1.663 |
| 13.10.12 | 1.663 |
| 14.10.12 | 1.663 |
| 15.10.12 | 1.663 |
| 16.10.12 | 1.661 |
| 17.10.12 | 1.661 |
| 18.10.12 | 1.659 |
| 19.10.12 | 1.658 |
| 20.10.12 | 1.658 |
| 21.10.12 | 1.658 |
| 22.10.12 | 1.658 |
| 23.10.12 | 1.656 |
| 24.10.12 | 1.656 |
| 25.10.12 | 1.657 |
| 26.10.12 | 1.659 |
| 27.10.12 | 1.659 |
| 28.10.12 | 1.659 |
| 29.10.12 | 1.659 |
| 30.10.12 | 1.66 |
| 31.10.12 | 1.661 |
| 01.11.12 | 1.66 |
| 02.11.12 | 1.66 |
| 03.11.12 | 1.66 |
| 04.11.12 | 1.66 |
| 05.11.12 | 1.66 |
| 06.11.12 | 1.659 |
| 07.11.12 | 1.659 |
| 08.11.12 | 1.66 |
| 09.11.12 | 1.661 |
| 10.11.12 | 1.664 |
| 11.11.12 | 1.664 |
| 12.11.12 | 1.664 |
| 13.11.12 | 1.664 |
| 14.11.12 | 1.665 |
| 15.11.12 | 1.666 |
| 16.11.12 | 1.67 |
| 17.11.12 | 1.671 |
| 18.11.12 | 1.671 |
| 19.11.12 | 1.671 |
| 20.11.12 | 1.671 |
| 21.11.12 | 1.664 |
| 22.11.12 | 1.662 |
| 23.11.12 | 1.66 |
| 24.11.12 | 1.66 |
| 25.11.12 | 1.66 |
| 26.11.12 | 1.66 |
| 27.11.12 | 1.657 |
| 28.11.12 | 1.656 |
| 29.11.12 | 1.656 |
| 30.11.12 | 1.656 |
| 01.12.12 | 1.66 |
| 02.12.12 | 1.66 |
| 03.12.12 | 1.66 |
| 04.12.12 | 1.66 |
| 05.12.12 | 1.66 |
| 06.12.12 | 1.664 |
| 07.12.12 | 1.664 |
| 08.12.12 | 1.664 |
| 09.12.12 | 1.664 |
| 10.12.12 | 1.664 |
| 11.12.12 | 1.664 |
| 12.12.12 | 1.664 |
| 13.12.12 | 1.665 |
| 14.12.12 | 1.665 |
| 15.12.12 | 1.663 |
| 16.12.12 | 1.663 |
| 17.12.12 | 1.663 |
| 18.12.12 | 1.656 |
| 19.12.12 | 1.657 |
| 20.12.12 | 1.656 |
| 21.12.12 | 1.655 |
| 22.12.12 | 1.654 |
| 23.12.12 | 1.654 |
| 24.12.12 | 1.654 |
| 25.12.12 | 1.658 |
| 26.12.12 | 1.658 |
| 27.12.12 | 1.66 |
| 28.12.12 | 1.658 |
| 29.12.12 | 1.657 |
| 30.12.12 | 1.657 |
| 31.12.12 | 1.657 |
| 01.01.13 | 1.656 |
| 02.01.13 | 1.656 |
| 03.01.13 | 1.656 |
| 04.01.13 | 1.656 |
| 05.01.13 | 1.657 |
| 06.01.13 | 1.657 |
| 07.01.13 | 1.657 |
| 08.01.13 | 1.657 |
| 09.01.13 | 1.66 |
| 10.01.13 | 1.658 |
| 11.01.13 | 1.658 |
| 12.01.13 | 1.658 |
| 13.01.13 | 1.658 |
| 14.01.13 | 1.658 |
| 15.01.13 | 1.657 |
| 16.01.13 | 1.656 |
| 17.01.13 | 1.656 |
| 18.01.13 | 1.656 |
| 19.01.13 | 1.66 |
| 20.01.13 | 1.66 |
| 21.01.13 | 1.66 |
| 22.01.13 | 1.66 |
| 23.01.13 | 1.668 |
| 24.01.13 | 1.667 |
| 25.01.13 | 1.66 |
| 26.01.13 | 1.66 |
| 27.01.13 | 1.66 |
| 28.01.13 | 1.66 |
| 29.01.13 | 1.66 |
| 30.01.13 | 1.658 |
| 31.01.13 | 1.657 |
| 01.02.13 | 1.658 |
| 02.02.13 | 1.657 |
| 03.02.13 | 1.657 |
| 04.02.13 | 1.657 |
| 05.02.13 | 1.656 |
| 06.02.13 | 1.656 |
| 07.02.13 | 1.656 |
| 08.02.13 | 1.656 |
| 09.02.13 | 1.656 |
| 10.02.13 | 1.656 |
| 11.02.13 | 1.656 |
| 12.02.13 | 1.661 |
| 13.02.13 | 1.661 |
| 14.02.13 | 1.66 |
| 15.02.13 | 1.657 |
| 16.02.13 | 1.657 |
| 17.02.13 | 1.657 |
| 18.02.13 | 1.657 |
| 19.02.13 | 1.656 |
| 20.02.13 | 1.654 |
| 21.02.13 | 1.656 |
| 22.02.13 | 1.655 |
| 23.02.13 | 1.656 |
| 24.02.13 | 1.656 |
| 25.02.13 | 1.656 |
| 26.02.13 | 1.658 |
| 27.02.13 | 1.653 |
| 28.02.13 | 1.654 |
| 01.03.13 | 1.657 |
| 02.03.13 | 1.657 |
| 03.03.13 | 1.657 |
| 04.03.13 | 1.657 |
| 05.03.13 | 1.659 |
| 06.03.13 | 1.659 |
| 07.03.13 | 1.658 |
| 08.03.13 | 1.66 |
| 09.03.13 | 1.66 |
| 10.03.13 | 1.66 |
| 11.03.13 | 1.66 |
| 12.03.13 | 1.659 |
| 13.03.13 | 1.659 |
| 14.03.13 | 1.659 |
| 15.03.13 | 1.66 |
| 16.03.13 | 1.658 |
| 17.03.13 | 1.658 |
| 18.03.13 | 1.658 |
| 19.03.13 | 1.662 |
| 20.03.13 | 1.661 |
| 21.03.13 | 1.66 |
| 22.03.13 | 1.659 |
| 23.03.13 | 1.659 |
| 24.03.13 | 1.659 |
| 25.03.13 | 1.659 |
| 26.03.13 | 1.658 |
| 27.03.13 | 1.658 |
| 28.03.13 | 1.66 |
| 29.03.13 | 1.66 |
| 30.03.13 | 1.658 |
| 31.03.13 | 1.658 |
| 01.04.13 | 1.658 |
| 02.04.13 | 1.657 |
| 03.04.13 | 1.654 |
| 04.04.13 | 1.656 |
| 05.04.13 | 1.656 |
| 06.04.13 | 1.651 |
| 07.04.13 | 1.651 |
| 08.04.13 | 1.651 |
| 09.04.13 | 1.65 |
| 10.04.13 | 1.65 |
| 11.04.13 | 1.648 |
| 12.04.13 | 1.652 |
| 13.04.13 | 1.654 |
| 14.04.13 | 1.654 |
| 15.04.13 | 1.654 |
| 16.04.13 | 1.652 |
| 17.04.13 | 1.654 |
| 18.04.13 | 1.657 |
| 19.04.13 | 1.657 |
| 20.04.13 | 1.657 |
| 21.04.13 | 1.657 |
| 22.04.13 | 1.657 |
| 23.04.13 | 1.656 |
| 24.04.13 | 1.657 |
| 25.04.13 | 1.658 |
| 26.04.13 | 1.651 |
| 27.04.13 | 1.65 |
| 28.04.13 | 1.65 |
| 29.04.13 | 1.65 |
| 30.04.13 | 1.651 |
| 01.05.13 | 1.652 |
| 02.05.13 | 1.65 |
| 03.05.13 | 1.648 |
| 04.05.13 | 1.648 |
| 05.05.13 | 1.648 |
| 06.05.13 | 1.648 |
| 07.05.13 | 1.648 |
| 08.05.13 | 1.647 |
| 09.05.13 | 1.645 |
| 10.05.13 | 1.645 |
| 11.05.13 | 1.644 |
| 12.05.13 | 1.644 |
| 13.05.13 | 1.644 |
| 14.05.13 | 1.641 |
| 15.05.13 | 1.641 |
| 16.05.13 | 1.639 |
| 17.05.13 | 1.639 |
| 18.05.13 | 1.636 |
| 19.05.13 | 1.636 |
| 20.05.13 | 1.636 |
| 21.05.13 | 1.635 |
| 22.05.13 | 1.636 |
| 23.05.13 | 1.636 |
| 24.05.13 | 1.635 |
| 25.05.13 | 1.635 |
| 26.05.13 | 1.635 |
| 27.05.13 | 1.635 |
| 28.05.13 | 1.635 |
| 29.05.13 | 1.642 |
| 30.05.13 | 1.642 |
| 31.05.13 | 1.641 |
| 01.06.13 | 1.65 |
| 02.06.13 | 1.65 |
| 03.06.13 | 1.65 |
| 04.06.13 | 1.65 |
| 05.06.13 | 1.658 |
| 06.06.13 | 1.665 |
| 07.06.13 | 1.668 |
| 08.06.13 | 1.672 |
| 09.06.13 | 1.672 |
| 10.06.13 | 1.672 |
| 11.06.13 | 1.657 |
| 12.06.13 | 1.657 |
| 13.06.13 | 1.656 |
| 14.06.13 | 1.654 |
| 15.06.13 | 1.653 |
| 16.06.13 | 1.653 |
| 17.06.13 | 1.653 |
| 18.06.13 | 1.656 |
| 19.06.13 | 1.655 |
| 20.06.13 | 1.648 |
| 21.06.13 | 1.655 |
| 22.06.13 | 1.655 |
| 23.06.13 | 1.655 |
| 24.06.13 | 1.655 |
| 25.06.13 | 1.652 |
| 26.06.13 | 1.651 |
| 27.06.13 | 1.651 |
| 28.06.13 | 1.652 |
| 29.06.13 | 1.651 |
| 30.06.13 | 1.651 |
| 01.07.13 | 1.651 |
| 02.07.13 | 1.656 |
| 03.07.13 | 1.654 |
| 04.07.13 | 1.654 |
| 05.07.13 | 1.655 |
| 06.07.13 | 1.655 |
| 07.07.13 | 1.655 |
| 08.07.13 | 1.655 |
| 09.07.13 | 1.655 |
| 10.07.13 | 1.656 |
| 11.07.13 | 1.656 |
| 12.07.13 | 1.656 |
| 13.07.13 | 1.656 |
| 14.07.13 | 1.656 |
| 15.07.13 | 1.656 |
| 16.07.13 | 1.654 |
| 17.07.13 | 1.654 |
| 18.07.13 | 1.654 |
| 19.07.13 | 1.656 |
| 20.07.13 | 1.656 |
| 21.07.13 | 1.656 |
| 22.07.13 | 1.656 |
| 23.07.13 | 1.653 |
| 24.07.13 | 1.657 |
| 25.07.13 | 1.656 |
| 26.07.13 | 1.654 |
| 27.07.13 | 1.655 |
| 28.07.13 | 1.655 |
| 29.07.13 | 1.655 |
| 30.07.13 | 1.654 |
| 31.07.13 | 1.654 |
| 01.08.13 | 1.654 |
| 02.08.13 | 1.656 |
| 03.08.13 | 1.665 |
| 04.08.13 | 1.665 |
| 05.08.13 | 1.665 |
| 06.08.13 | 1.669 |
| 07.08.13 | 1.667 |
| 08.08.13 | 1.662 |
| 09.08.13 | 1.662 |
| 10.08.13 | 1.66 |
| 11.08.13 | 1.66 |
| 12.08.13 | 1.66 |
| 13.08.13 | 1.659 |
| 14.08.13 | 1.659 |
| 15.08.13 | 1.664 |
| 16.08.13 | 1.664 |
| 17.08.13 | 1.662 |
| 18.08.13 | 1.662 |
| 19.08.13 | 1.662 |
| 20.08.13 | 1.66 |
| 21.08.13 | 1.66 |
| 22.08.13 | 1.66 |
| 23.08.13 | 1.661 |
| 24.08.13 | 1.662 |
| 25.08.13 | 1.662 |
| 26.08.13 | 1.662 |
| 27.08.13 | 1.661 |
| 28.08.13 | 1.661 |
| 29.08.13 | 1.661 |
| 30.08.13 | 1.661 |
| 31.08.13 | 1.662 |
| 01.09.13 | 1.662 |
| 02.09.13 | 1.662 |
| 03.09.13 | 1.661 |
| 04.09.13 | 1.661 |
| 05.09.13 | 1.661 |
| 06.09.13 | 1.661 |
| 07.09.13 | 1.662 |
| 08.09.13 | 1.662 |
| 09.09.13 | 1.662 |
| 10.09.13 | 1.662 |
| 11.09.13 | 1.661 |
| 12.09.13 | 1.661 |
| 13.09.13 | 1.66 |
| 14.09.13 | 1.656 |
| 15.09.13 | 1.656 |
| 16.09.13 | 1.656 |
| 17.09.13 | 1.658 |
| 18.09.13 | 1.664 |
| 19.09.13 | 1.664 |
| 20.09.13 | 1.656 |
| 21.09.13 | 1.663 |
| 22.09.13 | 1.663 |
| 23.09.13 | 1.663 |
| 24.09.13 | 1.668 |
| 25.09.13 | 1.668 |
| 26.09.13 | 1.668 |
| 27.09.13 | 1.662 |
| 28.09.13 | 1.664 |
| 29.09.13 | 1.664 |
| 30.09.13 | 1.664 |
| 01.10.13 | 1.664 |
| 02.10.13 | 1.662 |
| 03.10.13 | 1.662 |
| 04.10.13 | 1.663 |
| 05.10.13 | 1.662 |
| 06.10.13 | 1.662 |
| 07.10.13 | 1.662 |
| 08.10.13 | 1.662 |
| 09.10.13 | 1.663 |
| 10.10.13 | 1.662 |
| 11.10.13 | 1.664 |
| 12.10.13 | 1.668 |
| 13.10.13 | 1.668 |
| 14.10.13 | 1.668 |
| 15.10.13 | 1.668 |
| 16.10.13 | 1.668 |
| 17.10.13 | 1.665 |
| 18.10.13 | 1.664 |
| 19.10.13 | 1.664 |
| 20.10.13 | 1.664 |
| 21.10.13 | 1.664 |
| 22.10.13 | 1.664 |
| 23.10.13 | 1.665 |
| 24.10.13 | 1.667 |
| 25.10.13 | 1.668 |
| 26.10.13 | 1.668 |
| 27.10.13 | 1.668 |
| 28.10.13 | 1.668 |
| 29.10.13 | 1.668 |
| 30.10.13 | 1.669 |
| 31.10.13 | 1.671 |
| 01.11.13 | 1.672 |
| 02.11.13 | 1.672 |
| 03.11.13 | 1.672 |
| 04.11.13 | 1.672 |
| 05.11.13 | 1.672 |
| 06.11.13 | 1.672 |
| 07.11.13 | 1.674 |
| 08.11.13 | 1.679 |
| 09.11.13 | 1.679 |
| 10.11.13 | 1.679 |
| 11.11.13 | 1.679 |
| 12.11.13 | 1.679 |
| 13.11.13 | 1.678 |
| 14.11.13 | 1.678 |
| 15.11.13 | 1.676 |
| 16.11.13 | 1.676 |
| 17.11.13 | 1.676 |
| 18.11.13 | 1.676 |
| 19.11.13 | 1.676 |
| 20.11.13 | 1.675 |
| 21.11.13 | 1.675 |
| 22.11.13 | 1.676 |
| 23.11.13 | 1.682 |
| 24.11.13 | 1.682 |
| 25.11.13 | 1.682 |
| 26.11.13 | 1.686 |
| 27.11.13 | 1.687 |
| 28.11.13 | 1.688 |
| 29.11.13 | 1.692 |
| 30.11.13 | 1.692 |
| 01.12.13 | 1.692 |
| 02.12.13 | 1.692 |
| 03.12.13 | 1.697 |
| 04.12.13 | 1.7 |
| 05.12.13 | 1.705 |
| 06.12.13 | 1.701 |
| 07.12.13 | 1.701 |
| 08.12.13 | 1.701 |
| 09.12.13 | 1.701 |
| 10.12.13 | 1.706 |
| 11.12.13 | 1.72 |
| 12.12.13 | 1.712 |
| 13.12.13 | 1.712 |
| 14.12.13 | 1.709 |
| 15.12.13 | 1.709 |
| 16.12.13 | 1.709 |
| 17.12.13 | 1.708 |
| 18.12.13 | 1.705 |
| 19.12.13 | 1.709 |
| 20.12.13 | 1.711 |
| 21.12.13 | 1.717 |
| 22.12.13 | 1.717 |
| 23.12.13 | 1.717 |
| 24.12.13 | 1.717 |
| 25.12.13 | 1.723 |
| 26.12.13 | 1.729 |
| 27.12.13 | 1.733 |
| 28.12.13 | 1.738 |
| 29.12.13 | 1.738 |
| 30.12.13 | 1.738 |
| 31.12.13 | 1.736 |
| 01.01.14 | 1.737 |
| 02.01.14 | 1.737 |
| 03.01.14 | 1.737 |
| 04.01.14 | 1.738 |
| 05.01.14 | 1.738 |
| 06.01.14 | 1.738 |
| 07.01.14 | 1.747 |
| 08.01.14 | 1.747 |
| 09.01.14 | 1.742 |
| 10.01.14 | 1.742 |
| 11.01.14 | 1.745 |
| 12.01.14 | 1.745 |
| 13.01.14 | 1.745 |
| 14.01.14 | 1.748 |
| 15.01.14 | 1.753 |
| 16.01.14 | 1.757 |
| 17.01.14 | 1.768 |
| 18.01.14 | 1.774 |
| 19.01.14 | 1.774 |
| 20.01.14 | 1.774 |
| 21.01.14 | 1.77 |
| 22.01.14 | 1.776 |
| 23.01.14 | 1.782 |
| 24.01.14 | 1.78 |
| 25.01.14 | 1.773 |
| 26.01.14 | 1.773 |
| 27.01.14 | 1.773 |
| 28.01.14 | 1.779 |
| 29.01.14 | 1.78 |
| 30.01.14 | 1.782 |
| 31.01.14 | 1.782 |
| 01.02.14 | 1.782 |
| 02.02.14 | 1.782 |
| 03.02.14 | 1.782 |
| 04.02.14 | 1.782 |
| 05.02.14 | 1.781 |
| 06.02.14 | 1.77 |
| 07.02.14 | 1.765 |
| 08.02.14 | 1.749 |
| 09.02.14 | 1.749 |
| 10.02.14 | 1.749 |
| 11.02.14 | 1.749 |
| 12.02.14 | 1.731 |
| 13.02.14 | 1.727 |
| 14.02.14 | 1.727 |
| 15.02.14 | 1.73 |
| 16.02.14 | 1.73 |
| 17.02.14 | 1.73 |
| 18.02.14 | 1.73 |
| 19.02.14 | 1.733 |
| 20.02.14 | 1.733 |
| 21.02.14 | 1.733 |
| 22.02.14 | 1.739 |
| 23.02.14 | 1.739 |
| 24.02.14 | 1.739 |
| 25.02.14 | 1.739 |
| 26.02.14 | 1.745 |
| 27.02.14 | 1.748 |
| 28.02.14 | 1.75 |
| 01.03.14 | 1.749 |
| 02.03.14 | 1.749 |
| 03.03.14 | 1.749 |
| 04.03.14 | 1.749 |
| 05.03.14 | 1.747 |
| 06.03.14 | 1.738 |
| 07.03.14 | 1.738 |
| 08.03.14 | 1.738 |
| 09.03.14 | 1.738 |
| 10.03.14 | 1.738 |
| 11.03.14 | 1.739 |
| 12.03.14 | 1.738 |
| 13.03.14 | 1.736 |
| 14.03.14 | 1.734 |
| 15.03.14 | 1.732 |
| 16.03.14 | 1.732 |
| 17.03.14 | 1.732 |
| 18.03.14 | 1.727 |
| 19.03.14 | 1.728 |
| 20.03.14 | 1.732 |
| 21.03.14 | 1.743 |
| 22.03.14 | 1.743 |
| 23.03.14 | 1.743 |
| 24.03.14 | 1.743 |
| 25.03.14 | 1.746 |
| 26.03.14 | 1.747 |
| 27.03.14 | 1.749 |
| 28.03.14 | 1.755 |
| 29.03.14 | 1.748 |
| 30.03.14 | 1.748 |
| 31.03.14 | 1.748 |
| 01.04.14 | 1.746 |
| 02.04.14 | 1.748 |
| 03.04.14 | 1.752 |
| 04.04.14 | 1.751 |
| 05.04.14 | 1.75 |
| 06.04.14 | 1.75 |
| 07.04.14 | 1.75 |
| 08.04.14 | 1.748 |
| 09.04.14 | 1.75 |
| 10.04.14 | 1.75 |
| 11.04.14 | 1.75 |
| 12.04.14 | 1.752 |
| 13.04.14 | 1.752 |
| 14.04.14 | 1.752 |
| 15.04.14 | 1.751 |
| 16.04.14 | 1.752 |
| 17.04.14 | 1.753 |
| 18.04.14 | 1.755 |
| 19.04.14 | 1.755 |
| 20.04.14 | 1.755 |
| 21.04.14 | 1.755 |
| 22.04.14 | 1.755 |
| 23.04.14 | 1.756 |
| 24.04.14 | 1.757 |
| 25.04.14 | 1.762 |
| 26.04.14 | 1.766 |
| 27.04.14 | 1.766 |
| 28.04.14 | 1.766 |
| 29.04.14 | 1.766 |
| 30.04.14 | 1.771 |
| 01.05.14 | 1.771 |
| 02.05.14 | 1.77 |
| 03.05.14 | 1.764 |
| 04.05.14 | 1.764 |
| 05.05.14 | 1.764 |
| 06.05.14 | 1.764 |
| 07.05.14 | 1.76 |
| 08.05.14 | 1.76 |
| 09.05.14 | 1.763 |
| 10.05.14 | 1.763 |
| 11.05.14 | 1.763 |
| 12.05.14 | 1.763 |
| 13.05.14 | 1.763 |
| 14.05.14 | 1.761 |
| 15.05.14 | 1.759 |
| 16.05.14 | 1.756 |
| 17.05.14 | 1.752 |
| 18.05.14 | 1.752 |
| 19.05.14 | 1.752 |
| 20.05.14 | 1.752 |
| 21.05.14 | 1.753 |
| 22.05.14 | 1.757 |
| 23.05.14 | 1.763 |
| 24.05.14 | 1.771 |
| 25.05.14 | 1.771 |
| 26.05.14 | 1.771 |
| 27.05.14 | 1.771 |
| 28.05.14 | 1.772 |
| 29.05.14 | 1.772 |
| 30.05.14 | 1.774 |
| 31.05.14 | 1.772 |
| 01.06.14 | 1.772 |
| 02.06.14 | 1.772 |
| 03.06.14 | 1.771 |
| 04.06.14 | 1.772 |
| 05.06.14 | 1.772 |
| 06.06.14 | 1.772 |
| 07.06.14 | 1.773 |
| 08.06.14 | 1.773 |
| 09.06.14 | 1.773 |
| 10.06.14 | 1.762 |
| 11.06.14 | 1.756 |
| 12.06.14 | 1.756 |
| 13.06.14 | 1.772 |
| 14.06.14 | 1.77 |
| 15.06.14 | 1.77 |
| 16.06.14 | 1.77 |
| 17.06.14 | 1.769 |
| 18.06.14 | 1.768 |
| 19.06.14 | 1.77 |
| 20.06.14 | 1.77 |
| 21.06.14 | 1.772 |
| 22.06.14 | 1.772 |
| 23.06.14 | 1.772 |
| 24.06.14 | 1.769 |
| 25.06.14 | 1.769 |
| 26.06.14 | 1.77 |
| 27.06.14 | 1.77 |
| 28.06.14 | 1.769 |
| 29.06.14 | 1.769 |
| 30.06.14 | 1.769 |
| 01.07.14 | 1.766 |
| 02.07.14 | 1.765 |
| 03.07.14 | 1.765 |
| 04.07.14 | 1.769 |
| 05.07.14 | 1.769 |
| 06.07.14 | 1.769 |
| 07.07.14 | 1.769 |
| 08.07.14 | 1.769 |
| 09.07.14 | 1.769 |
| 10.07.14 | 1.77 |
| 11.07.14 | 1.77 |
| 12.07.14 | 1.768 |
| 13.07.14 | 1.768 |
| 14.07.14 | 1.768 |
| 15.07.14 | 1.761 |
| 16.07.14 | 1.759 |
| 17.07.14 | 1.758 |
| 18.07.14 | 1.757 |
| 19.07.14 | 1.754 |
| 20.07.14 | 1.754 |
| 21.07.14 | 1.754 |
| 22.07.14 | 1.75 |
| 23.07.14 | 1.75 |
| 24.07.14 | 1.75 |
| 25.07.14 | 1.756 |
| 26.07.14 | 1.753 |
| 27.07.14 | 1.753 |
| 28.07.14 | 1.753 |
| 29.07.14 | 1.751 |
| 30.07.14 | 1.745 |
| 31.07.14 | 1.742 |
| 01.08.14 | 1.739 |
| 02.08.14 | 1.736 |
| 03.08.14 | 1.736 |
| 04.08.14 | 1.736 |
| 05.08.14 | 1.735 |
| 06.08.14 | 1.732 |
| 07.08.14 | 1.731 |
| 08.08.14 | 1.727 |
| 09.08.14 | 1.727 |
| 10.08.14 | 1.727 |
| 11.08.14 | 1.727 |
| 12.08.14 | 1.729 |
| 13.08.14 | 1.729 |
| 14.08.14 | 1.73 |
| 15.08.14 | 1.729 |
| 16.08.14 | 1.728 |
| 17.08.14 | 1.728 |
| 18.08.14 | 1.728 |
| 19.08.14 | 1.724 |
| 20.08.14 | 1.725 |
| 21.08.14 | 1.728 |
| 22.08.14 | 1.728 |
| 23.08.14 | 1.725 |
| 24.08.14 | 1.725 |
| 25.08.14 | 1.725 |
| 26.08.14 | 1.725 |
| 27.08.14 | 1.732 |
| 28.08.14 | 1.736 |
| 29.08.14 | 1.736 |
| 30.08.14 | 1.736 |
| 31.08.14 | 1.736 |
| 01.09.14 | 1.736 |
| 02.09.14 | 1.736 |
| 03.09.14 | 1.736 |
| 04.09.14 | 1.74 |
| 05.09.14 | 1.747 |
| 06.09.14 | 1.747 |
| 07.09.14 | 1.747 |
| 08.09.14 | 1.747 |
| 09.09.14 | 1.746 |
| 10.09.14 | 1.744 |
| 11.09.14 | 1.742 |
| 12.09.14 | 1.742 |
| 13.09.14 | 1.74 |
| 14.09.14 | 1.74 |
| 15.09.14 | 1.74 |
| 16.09.14 | 1.736 |
| 17.09.14 | 1.738 |
| 18.09.14 | 1.745 |
| 19.09.14 | 1.749 |
| 20.09.14 | 1.749 |
| 21.09.14 | 1.749 |
| 22.09.14 | 1.749 |
| 23.09.14 | 1.749 |
| 24.09.14 | 1.749 |
| 25.09.14 | 1.751 |
| 26.09.14 | 1.757 |
| 27.09.14 | 1.756 |
| 28.09.14 | 1.756 |
| 29.09.14 | 1.756 |
| 30.09.14 | 1.752 |
| 01.10.14 | 1.753 |
| 02.10.14 | 1.756 |
| 03.10.14 | 1.757 |
| 04.10.14 | 1.757 |
| 05.10.14 | 1.757 |
| 06.10.14 | 1.757 |
| 07.10.14 | 1.756 |
| 08.10.14 | 1.754 |
| 09.10.14 | 1.755 |
| 10.10.14 | 1.755 |
| 11.10.14 | 1.756 |
| 12.10.14 | 1.756 |
| 13.10.14 | 1.756 |
| 14.10.14 | 1.756 |
| 15.10.14 | 1.756 |
| 16.10.14 | 1.756 |
| 17.10.14 | 1.752 |
| 18.10.14 | 1.752 |
| 19.10.14 | 1.752 |
| 20.10.14 | 1.752 |
| 21.10.14 | 1.752 |
| 22.10.14 | 1.752 |
| 23.10.14 | 1.752 |
| 24.10.14 | 1.752 |
| 25.10.14 | 1.752 |
| 26.10.14 | 1.752 |
| 27.10.14 | 1.752 |
| 28.10.14 | 1.753 |
| 29.10.14 | 1.756 |
| 30.10.14 | 1.755 |
| 31.10.14 | 1.754 |
| 01.11.14 | 1.754 |
| 02.11.14 | 1.754 |
| 03.11.14 | 1.754 |
| 04.11.14 | 1.753 |
| 05.11.14 | 1.754 |
| 06.11.14 | 1.756 |
| 07.11.14 | 1.756 |
| 08.11.14 | 1.756 |
| 09.11.14 | 1.756 |
| 10.11.14 | 1.756 |
| 11.11.14 | 1.756 |
| 12.11.14 | 1.758 |
| 13.11.14 | 1.762 |
| 14.11.14 | 1.765 |
| 15.11.14 | 1.765 |
| 16.11.14 | 1.765 |
| 17.11.14 | 1.765 |
| 18.11.14 | 1.764 |
| 19.11.14 | 1.764 |
| 20.11.14 | 1.768 |
| 21.11.14 | 1.778 |
| 22.11.14 | 1.794 |
| 23.11.14 | 1.794 |
| 24.11.14 | 1.794 |
| 25.11.14 | 1.822 |
| 26.11.14 | 1.819 |
| 27.11.14 | 1.837 |
| 28.11.14 | 1.837 |
| 29.11.14 | 1.837 |
| 30.11.14 | 1.837 |
| 01.12.14 | 1.837 |
| 02.12.14 | 1.842 |
| 03.12.14 | 1.86 |
| 04.12.14 | 1.862 |
| 05.12.14 | 1.898 |
| 06.12.14 | 1.953 |
| 07.12.14 | 1.953 |
| 08.12.14 | 1.953 |
| 09.12.14 | 1.946 |
| 10.12.14 | 1.926 |
| 11.12.14 | 1.892 |
| 12.12.14 | 1.842 |
| 13.12.14 | 1.832 |
| 14.12.14 | 1.832 |
| 15.12.14 | 1.832 |
| 16.12.14 | 1.841 |
| 17.12.14 | 1.859 |
| 18.12.14 | 1.911 |
| 19.12.14 | 1.917 |
| 20.12.14 | 1.916 |
| 21.12.14 | 1.916 |
| 22.12.14 | 1.916 |
| 23.12.14 | 1.902 |
| 24.12.14 | 1.898 |
| 25.12.14 | 1.89 |
| 26.12.14 | 1.879 |
| 27.12.14 | 1.866 |
| 28.12.14 | 1.866 |
| 29.12.14 | 1.866 |
| 30.12.14 | 1.87 |
| 31.12.14 | 1.864 |
| 01.01.15 | 1.882 |
| 02.01.15 | 1.882 |
| 03.01.15 | 1.882 |
| 04.01.15 | 1.882 |
| 05.01.15 | 1.882 |
| 06.01.15 | 1.878 |
| 07.01.15 | 1.883 |
| 08.01.15 | 1.883 |
| 09.01.15 | 1.909 |
| 10.01.15 | 1.909 |
| 11.01.15 | 1.909 |
| 12.01.15 | 1.909 |
| 13.01.15 | 1.918 |
| 14.01.15 | 1.923 |
| 15.01.15 | 1.928 |
| 16.01.15 | 1.931 |
| 17.01.15 | 1.943 |
| 18.01.15 | 1.943 |
| 19.01.15 | 1.943 |
| 20.01.15 | 1.943 |
| 21.01.15 | 1.943 |
| 22.01.15 | 1.954 |
| 23.01.15 | 1.985 |
| 24.01.15 | 1.994 |
| 25.01.15 | 1.994 |
| 26.01.15 | 1.994 |
| 27.01.15 | 1.996 |
| 28.01.15 | 2.014 |
| 29.01.15 | 2.031 |
| 30.01.15 | 2.058 |
| 31.01.15 | 2.056 |
| 01.02.15 | 2.056 |
| 02.02.15 | 2.056 |
| 03.02.15 | 1.997 |
| 04.02.15 | 1.993 |
| 05.02.15 | 1.998 |
| 06.02.15 | 2.01 |
| 07.02.15 | 2.031 |
| 08.02.15 | 2.031 |
| 09.02.15 | 2.031 |
| 10.02.15 | 2.035 |
| 11.02.15 | 2.042 |
| 12.02.15 | 2.025 |
| 13.02.15 | 2.025 |
| 14.02.15 | 2.031 |
| 15.02.15 | 2.031 |
| 16.02.15 | 2.031 |
| 17.02.15 | 2.051 |
| 18.02.15 | 2.073 |
| 19.02.15 | 2.084 |
| 20.02.15 | 2.147 |
| 21.02.15 | 2.177 |
| 22.02.15 | 2.177 |
| 23.02.15 | 2.177 |
| 24.02.15 | 2.197 |
| 25.02.15 | 2.262 |
| 26.02.15 | 2.264 |
| 27.02.15 | 2.249 |
| 28.02.15 | 2.165 |
| 01.03.15 | 2.165 |
| 02.03.15 | 2.165 |
| 03.03.15 | 2.14 |
| 04.03.15 | 2.14 |
| 05.03.15 | 2.108 |
| 06.03.15 | 2.142 |
| 07.03.15 | 2.174 |
| 08.03.15 | 2.174 |
| 09.03.15 | 2.174 |
| 10.03.15 | 2.174 |
| 11.03.15 | 2.184 |
| 12.03.15 | 2.185 |
| 13.03.15 | 2.191 |
| 14.03.15 | 2.185 |
| 15.03.15 | 2.185 |
| 16.03.15 | 2.185 |
| 17.03.15 | 2.178 |
| 18.03.15 | 2.194 |
| 19.03.15 | 2.2 |
| 20.03.15 | 2.223 |
| 21.03.15 | 2.223 |
| 22.03.15 | 2.223 |
| 23.03.15 | 2.223 |
| 24.03.15 | 2.226 |
| 25.03.15 | 2.229 |
| 26.03.15 | 2.226 |
| 27.03.15 | 2.223 |
| 28.03.15 | 2.224 |
| 29.03.15 | 2.224 |
| 30.03.15 | 2.224 |
| 31.03.15 | 2.228 |
| 01.04.15 | 2.235 |
| 02.04.15 | 2.244 |
| 03.04.15 | 2.245 |
| 04.04.15 | 2.257 |
| 05.04.15 | 2.257 |
| 06.04.15 | 2.257 |
| 07.04.15 | 2.25 |
| 08.04.15 | 2.249 |
| 09.04.15 | 2.243 |
| 10.04.15 | 2.243 |
| 11.04.15 | 2.243 |
| 12.04.15 | 2.243 |
| 13.04.15 | 2.243 |
| 14.04.15 | 2.243 |
| 15.04.15 | 2.244 |
| 16.04.15 | 2.249 |
| 17.04.15 | 2.251 |
| 18.04.15 | 2.254 |
| 19.04.15 | 2.254 |
| 20.04.15 | 2.254 |
| 21.04.15 | 2.253 |
| 22.04.15 | 2.253 |
| 23.04.15 | 2.254 |
| 24.04.15 | 2.259 |
| 25.04.15 | 2.284 |
| 26.04.15 | 2.284 |
| 27.04.15 | 2.284 |
| 28.04.15 | 2.285 |
| 29.04.15 | 2.309 |
| 30.04.15 | 2.309 |
| 01.05.15 | 2.333 |
| 02.05.15 | 2.33 |
| 03.05.15 | 2.33 |
| 04.05.15 | 2.33 |
| 05.05.15 | 2.322 |
| 06.05.15 | 2.321 |
| 07.05.15 | 2.326 |
| 08.05.15 | 2.329 |
| 09.05.15 | 2.334 |
| 10.05.15 | 2.334 |
| 11.05.15 | 2.334 |
| 12.05.15 | 2.343 |
| 13.05.15 | 2.343 |
| 14.05.15 | 2.362 |
| 15.05.15 | 2.363 |
| 16.05.15 | 2.364 |
| 17.05.15 | 2.364 |
| 18.05.15 | 2.364 |
| 19.05.15 | 2.357 |
| 20.05.15 | 2.338 |
| 21.05.15 | 2.323 |
| 22.05.15 | 2.254 |
| 23.05.15 | 2.277 |
| 24.05.15 | 2.277 |
| 25.05.15 | 2.277 |
| 26.05.15 | 2.279 |
| 27.05.15 | 2.279 |
| 28.05.15 | 2.29 |
| 29.05.15 | 2.303 |
| 30.05.15 | 2.311 |
| 31.05.15 | 2.311 |
| 01.06.15 | 2.311 |
| 02.06.15 | 2.31 |
| 03.06.15 | 2.305 |
| 04.06.15 | 2.301 |
| 05.06.15 | 2.297 |
| 06.06.15 | 2.294 |
| 07.06.15 | 2.294 |
| 08.06.15 | 2.294 |
| 09.06.15 | 2.283 |
| 10.06.15 | 2.271 |
| 11.06.15 | 2.255 |
| 12.06.15 | 2.255 |
| 13.06.15 | 2.249 |
| 14.06.15 | 2.249 |
| 15.06.15 | 2.249 |
| 16.06.15 | 2.238 |
| 17.06.15 | 2.24 |
| 18.06.15 | 2.242 |
| 19.06.15 | 2.243 |
| 20.06.15 | 2.243 |
| 21.06.15 | 2.243 |
| 22.06.15 | 2.243 |
| 23.06.15 | 2.243 |
| 24.06.15 | 2.249 |
| 25.06.15 | 2.249 |
| 26.06.15 | 2.247 |
| 27.06.15 | 2.248 |
| 28.06.15 | 2.248 |
| 29.06.15 | 2.248 |
| 30.06.15 | 2.248 |
| 01.07.15 | 2.246 |
| 02.07.15 | 2.246 |
| 03.07.15 | 2.247 |
| 04.07.15 | 2.247 |
| 05.07.15 | 2.247 |
| 06.07.15 | 2.247 |
| 07.07.15 | 2.246 |
| 08.07.15 | 2.246 |
| 09.07.15 | 2.246 |
| 10.07.15 | 2.247 |
| 11.07.15 | 2.248 |
| 12.07.15 | 2.248 |
| 13.07.15 | 2.248 |
| 14.07.15 | 2.252 |
| 15.07.15 | 2.262 |
| 16.07.15 | 2.27 |
| 17.07.15 | 2.272 |
| 18.07.15 | 2.272 |
| 19.07.15 | 2.272 |
| 20.07.15 | 2.272 |
| 21.07.15 | 2.263 |
| 22.07.15 | 2.257 |
| 23.07.15 | 2.256 |
| 24.07.15 | 2.256 |
| 25.07.15 | 2.256 |
| 26.07.15 | 2.256 |
| 27.07.15 | 2.256 |
| 28.07.15 | 2.256 |
| 29.07.15 | 2.265 |
| 30.07.15 | 2.27 |
| 31.07.15 | 2.279 |
| 01.08.15 | 2.271 |
| 02.08.15 | 2.271 |
| 03.08.15 | 2.271 |
| 04.08.15 | 2.272 |
| 05.08.15 | 2.28 |
| 06.08.15 | 2.292 |
| 07.08.15 | 2.304 |
| 08.08.15 | 2.306 |
| 09.08.15 | 2.306 |
| 10.08.15 | 2.306 |
| 11.08.15 | 2.302 |
| 12.08.15 | 2.298 |
| 13.08.15 | 2.309 |
| 14.08.15 | 2.324 |
| 15.08.15 | 2.323 |
| 16.08.15 | 2.323 |
| 17.08.15 | 2.323 |
| 18.08.15 | 2.321 |
| 19.08.15 | 2.321 |
| 20.08.15 | 2.324 |
| 21.08.15 | 2.327 |
| 22.08.15 | 2.334 |
| 23.08.15 | 2.334 |
| 24.08.15 | 2.334 |
| 25.08.15 | 2.364 |
| 26.08.15 | 2.416 |
| 27.08.15 | 2.377 |
| 28.08.15 | 2.346 |
| 29.08.15 | 2.346 |
| 30.08.15 | 2.346 |
| 31.08.15 | 2.346 |
| 01.09.15 | 2.349 |
| 02.09.15 | 2.364 |
| 03.09.15 | 2.363 |
| 04.09.15 | 2.359 |
| 05.09.15 | 2.38 |
| 06.09.15 | 2.38 |
| 07.09.15 | 2.38 |
| 08.09.15 | 2.38 |
| 09.09.15 | 2.379 |
| 10.09.15 | 2.388 |
| 11.09.15 | 2.401 |
| 12.09.15 | 2.405 |
| 13.09.15 | 2.405 |
| 14.09.15 | 2.405 |
| 15.09.15 | 2.402 |
| 16.09.15 | 2.417 |
| 17.09.15 | 2.431 |
| 18.09.15 | 2.441 |
| 19.09.15 | 2.449 |
| 20.09.15 | 2.449 |
| 21.09.15 | 2.449 |
| 22.09.15 | 2.45 |
| 23.09.15 | 2.409 |
| 24.09.15 | 2.408 |
| 25.09.15 | 2.388 |
| 26.09.15 | 2.385 |
| 27.09.15 | 2.385 |
| 28.09.15 | 2.385 |
| 29.09.15 | 2.383 |
| 30.09.15 | 2.382 |
| 01.10.15 | 2.386 |
| 02.10.15 | 2.393 |
| 03.10.15 | 2.395 |
| 04.10.15 | 2.395 |
| 05.10.15 | 2.395 |
| 06.10.15 | 2.391 |
| 07.10.15 | 2.392 |
| 08.10.15 | 2.4 |
| 09.10.15 | 2.399 |
| 10.10.15 | 2.398 |
| 11.10.15 | 2.398 |
| 12.10.15 | 2.398 |
| 13.10.15 | 2.393 |
| 14.10.15 | 2.392 |
| 15.10.15 | 2.392 |
| 16.10.15 | 2.388 |
| 17.10.15 | 2.378 |
| 18.10.15 | 2.378 |
| 19.10.15 | 2.378 |
| 20.10.15 | 2.378 |
| 21.10.15 | 2.384 |
| 22.10.15 | 2.386 |
| 23.10.15 | 2.394 |
| 24.10.15 | 2.405 |
| 25.10.15 | 2.405 |
| 26.10.15 | 2.405 |
| 27.10.15 | 2.407 |
| 28.10.15 | 2.384 |
| 29.10.15 | 2.396 |
| 30.10.15 | 2.397 |
| 31.10.15 | 2.398 |
| 01.11.15 | 2.398 |
| 02.11.15 | 2.398 |
| 03.11.15 | 2.399 |
| 04.11.15 | 2.399 |
| 05.11.15 | 2.397 |
| 06.11.15 | 2.396 |
| 07.11.15 | 2.4 |
| 08.11.15 | 2.4 |
| 09.11.15 | 2.4 |
| 10.11.15 | 2.399 |
| 11.11.15 | 2.397 |
| 12.11.15 | 2.398 |
| 13.11.15 | 2.402 |
| 14.11.15 | 2.402 |
| 15.11.15 | 2.402 |
| 16.11.15 | 2.402 |
| 17.11.15 | 2.401 |
| 18.11.15 | 2.401 |
| 19.11.15 | 2.4 |
| 20.11.15 | 2.408 |
| 21.11.15 | 2.408 |
| 22.11.15 | 2.408 |
| 23.11.15 | 2.408 |
| 24.11.15 | 2.408 |
| 25.11.15 | 2.407 |
| 26.11.15 | 2.396 |
| 27.11.15 | 2.405 |
| 28.11.15 | 2.405 |
| 29.11.15 | 2.405 |
| 30.11.15 | 2.405 |
| 01.12.15 | 2.405 |
| 02.12.15 | 2.402 |
| 03.12.15 | 2.4 |
| 04.12.15 | 2.398 |
| 05.12.15 | 2.394 |
| 06.12.15 | 2.394 |
| 07.12.15 | 2.394 |
| 08.12.15 | 2.386 |
| 09.12.15 | 2.385 |
| 10.12.15 | 2.395 |
| 11.12.15 | 2.397 |
| 12.12.15 | 2.403 |
| 13.12.15 | 2.403 |
| 14.12.15 | 2.403 |
| 15.12.15 | 2.401 |
| 16.12.15 | 2.398 |
| 17.12.15 | 2.398 |
| 18.12.15 | 2.398 |
| 19.12.15 | 2.398 |
| 20.12.15 | 2.398 |
| 21.12.15 | 2.398 |
| 22.12.15 | 2.398 |
| 23.12.15 | 2.403 |
| 24.12.15 | 2.411 |
| 25.12.15 | 2.402 |
| 26.12.15 | 2.402 |
| 27.12.15 | 2.402 |
| 28.12.15 | 2.402 |
| 29.12.15 | 2.406 |
| 30.12.15 | 2.407 |
| 31.12.15 | 2.395 |
| 01.01.16 | 2.397 |
| 02.01.16 | 2.397 |
| 03.01.16 | 2.397 |
| 04.01.16 | 2.397 |
| 05.01.16 | 2.405 |
| 06.01.16 | 2.416 |
| 07.01.16 | 2.418 |
| 08.01.16 | 2.418 |
| 09.01.16 | 2.417 |
| 10.01.16 | 2.417 |
| 11.01.16 | 2.417 |
| 12.01.16 | 2.42 |
| 13.01.16 | 2.416 |
| 14.01.16 | 2.416 |
| 15.01.16 | 2.425 |
| 16.01.16 | 2.425 |
| 17.01.16 | 2.425 |
| 18.01.16 | 2.425 |
| 19.01.16 | 2.428 |
| 20.01.16 | 2.428 |
| 21.01.16 | 2.432 |
| 22.01.16 | 2.444 |
| 23.01.16 | 2.469 |
| 24.01.16 | 2.469 |
| 25.01.16 | 2.469 |
| 26.01.16 | 2.492 |
| 27.01.16 | 2.498 |
| 28.01.16 | 2.498 |
| 29.01.16 | 2.497 |
| 30.01.16 | 2.472 |
| 31.01.16 | 2.472 |
| 01.02.16 | 2.472 |
| 02.02.16 | 2.47 |
| 03.02.16 | 2.476 |
| 04.02.16 | 2.494 |
| 05.02.16 | 2.495 |
| 06.02.16 | 2.489 |
| 07.02.16 | 2.489 |
| 08.02.16 | 2.489 |
| 09.02.16 | 2.487 |
| 10.02.16 | 2.486 |
| 11.02.16 | 2.482 |
| 12.02.16 | 2.474 |
| 13.02.16 | 2.481 |
| 14.02.16 | 2.481 |
| 15.02.16 | 2.481 |
| 16.02.16 | 2.492 |
| 17.02.16 | 2.491 |
| 18.02.16 | 2.492 |
| 19.02.16 | 2.481 |
| 20.02.16 | 2.48 |
| 21.02.16 | 2.48 |
| 22.02.16 | 2.48 |
| 23.02.16 | 2.48 |
| 24.02.16 | 2.483 |
| 25.02.16 | 2.485 |
| 26.02.16 | 2.484 |
| 27.02.16 | 2.478 |
| 28.02.16 | 2.478 |
| 29.02.16 | 2.478 |
| 01.03.16 | 2.471 |
| 02.03.16 | 2.467 |
| 03.03.16 | 2.47 |
| 04.03.16 | 2.47 |
| 05.03.16 | 2.472 |
| 06.03.16 | 2.472 |
| 07.03.16 | 2.472 |
| 08.03.16 | 2.463 |
| 09.03.16 | 2.463 |
| 10.03.16 | 2.451 |
| 11.03.16 | 2.442 |
| 12.03.16 | 2.426 |
| 13.03.16 | 2.426 |
| 14.03.16 | 2.426 |
| 15.03.16 | 2.418 |
| 16.03.16 | 2.358 |
| 17.03.16 | 2.324 |
| 18.03.16 | 2.316 |
| 19.03.16 | 2.316 |
| 20.03.16 | 2.316 |
| 21.03.16 | 2.316 |
| 22.03.16 | 2.295 |
| 23.03.16 | 2.295 |
| 24.03.16 | 2.306 |
| 25.03.16 | 2.32 |
| 26.03.16 | 2.334 |
| 27.03.16 | 2.334 |
| 28.03.16 | 2.334 |
| 29.03.16 | 2.358 |
| 30.03.16 | 2.374 |
| 31.03.16 | 2.368 |
| 01.04.16 | 2.318 |
| 02.04.16 | 2.316 |
| 03.04.16 | 2.316 |
| 04.04.16 | 2.316 |
| 05.04.16 | 2.301 |
| 06.04.16 | 2.292 |
| 07.04.16 | 2.305 |
| 08.04.16 | 2.299 |
| 09.04.16 | 2.287 |
| 10.04.16 | 2.287 |
| 11.04.16 | 2.287 |
| 12.04.16 | 2.278 |
| 13.04.16 | 2.273 |
| 14.04.16 | 2.267 |
| 15.04.16 | 2.252 |
| 16.04.16 | 2.252 |
| 17.04.16 | 2.252 |
| 18.04.16 | 2.252 |
| 19.04.16 | 2.245 |
| 20.04.16 | 2.242 |
| 21.04.16 | 2.234 |
| 22.04.16 | 2.232 |
| 23.04.16 | 2.232 |
| 24.04.16 | 2.232 |
| 25.04.16 | 2.232 |
| 26.04.16 | 2.233 |
| 27.04.16 | 2.232 |
| 28.04.16 | 2.231 |
| 29.04.16 | 2.231 |
| 30.04.16 | 2.231 |
| 01.05.16 | 2.231 |
| 02.05.16 | 2.231 |
| 03.05.16 | 2.231 |
| 04.05.16 | 2.224 |
| 05.05.16 | 2.216 |
| 06.05.16 | 2.214 |
| 07.05.16 | 2.213 |
| 08.05.16 | 2.213 |
| 09.05.16 | 2.213 |
| 10.05.16 | 2.213 |
| 11.05.16 | 2.213 |
| 12.05.16 | 2.213 |
| 13.05.16 | 2.213 |
| 14.05.16 | 2.207 |
| 15.05.16 | 2.207 |
| 16.05.16 | 2.207 |
| 17.05.16 | 2.2 |
| 18.05.16 | 2.188 |
| 19.05.16 | 2.163 |
| 20.05.16 | 2.147 |
| 21.05.16 | 2.146 |
| 22.05.16 | 2.146 |
| 23.05.16 | 2.146 |
| 24.05.16 | 2.146 |
| 25.05.16 | 2.147 |
| 26.05.16 | 2.147 |
| 27.05.16 | 2.147 |
| 28.05.16 | 2.146 |
| 29.05.16 | 2.146 |
| 30.05.16 | 2.146 |
| 31.05.16 | 2.147 |
| 01.06.16 | 2.146 |
| 02.06.16 | 2.142 |
| 03.06.16 | 2.142 |
| 04.06.16 | 2.142 |
| 05.06.16 | 2.142 |
| 06.06.16 | 2.142 |
| 07.06.16 | 2.138 |
| 08.06.16 | 2.132 |
| 09.06.16 | 2.128 |
| 10.06.16 | 2.127 |
| 11.06.16 | 2.127 |
| 12.06.16 | 2.127 |
| 13.06.16 | 2.127 |
| 14.06.16 | 2.129 |
| 15.06.16 | 2.132 |
| 16.06.16 | 2.132 |
| 17.06.16 | 2.136 |
| 18.06.16 | 2.179 |
| 19.06.16 | 2.179 |
| 20.06.16 | 2.179 |
| 21.06.16 | 2.18 |
| 22.06.16 | 2.213 |
| 23.06.16 | 2.224 |
| 24.06.16 | 2.243 |
| 25.06.16 | 2.294 |
| 26.06.16 | 2.294 |
| 27.06.16 | 2.294 |
| 28.06.16 | 2.344 |
| 29.06.16 | 2.371 |
| 30.06.16 | 2.342 |
| 01.07.16 | 2.32 |
| 02.07.16 | 2.309 |
| 03.07.16 | 2.309 |
| 04.07.16 | 2.309 |
| 05.07.16 | 2.308 |
| 06.07.16 | 2.31 |
| 07.07.16 | 2.319 |
| 08.07.16 | 2.33 |
| 09.07.16 | 2.339 |
| 10.07.16 | 2.339 |
| 11.07.16 | 2.339 |
| 12.07.16 | 2.339 |
| 13.07.16 | 2.341 |
| 14.07.16 | 2.353 |
| 15.07.16 | 2.345 |
| 16.07.16 | 2.341 |
| 17.07.16 | 2.341 |
| 18.07.16 | 2.341 |
| 19.07.16 | 2.341 |
| 20.07.16 | 2.346 |
| 21.07.16 | 2.348 |
| 22.07.16 | 2.348 |
| 23.07.16 | 2.348 |
| 24.07.16 | 2.348 |
| 25.07.16 | 2.348 |
| 26.07.16 | 2.347 |
| 27.07.16 | 2.345 |
| 28.07.16 | 2.345 |
| 29.07.16 | 2.346 |
| 30.07.16 | 2.348 |
| 31.07.16 | 2.348 |
| 01.08.16 | 2.348 |
| 02.08.16 | 2.349 |
| 03.08.16 | 2.348 |
| 04.08.16 | 2.347 |
| 05.08.16 | 2.347 |
| 06.08.16 | 2.348 |
| 07.08.16 | 2.348 |
| 08.08.16 | 2.348 |
| 09.08.16 | 2.349 |
| 10.08.16 | 2.342 |
| 11.08.16 | 2.34 |
| 12.08.16 | 2.341 |
| 13.08.16 | 2.34 |
| 14.08.16 | 2.34 |
| 15.08.16 | 2.34 |
| 16.08.16 | 2.335 |
| 17.08.16 | 2.323 |
| 18.08.16 | 2.317 |
| 19.08.16 | 2.293 |
| 20.08.16 | 2.281 |
| 21.08.16 | 2.281 |
| 22.08.16 | 2.281 |
| 23.08.16 | 2.279 |
| 24.08.16 | 2.279 |
| 25.08.16 | 2.298 |
| 26.08.16 | 2.286 |
| 27.08.16 | 2.286 |
| 28.08.16 | 2.286 |
| 29.08.16 | 2.286 |
| 30.08.16 | 2.291 |
| 31.08.16 | 2.306 |
| 01.09.16 | 2.306 |
| 02.09.16 | 2.293 |
| 03.09.16 | 2.294 |
| 04.09.16 | 2.294 |
| 05.09.16 | 2.294 |
| 06.09.16 | 2.297 |
| 07.09.16 | 2.303 |
| 08.09.16 | 2.306 |
| 09.09.16 | 2.307 |
| 10.09.16 | 2.312 |
| 11.09.16 | 2.312 |
| 12.09.16 | 2.312 |
| 13.09.16 | 2.314 |
| 14.09.16 | 2.313 |
| 15.09.16 | 2.31 |
| 16.09.16 | 2.31 |
| 17.09.16 | 2.311 |
| 18.09.16 | 2.311 |
| 19.09.16 | 2.311 |
| 20.09.16 | 2.317 |
| 21.09.16 | 2.319 |
| 22.09.16 | 2.32 |
| 23.09.16 | 2.312 |
| 24.09.16 | 2.313 |
| 25.09.16 | 2.313 |
| 26.09.16 | 2.313 |
| 27.09.16 | 2.334 |
| 28.09.16 | 2.328 |
| 29.09.16 | 2.329 |
| 30.09.16 | 2.33 |
| 01.10.16 | 2.33 |
| 02.10.16 | 2.33 |
| 03.10.16 | 2.33 |
| 04.10.16 | 2.328 |
| 05.10.16 | 2.334 |
| 06.10.16 | 2.334 |
| 07.10.16 | 2.336 |
| 08.10.16 | 2.334 |
| 09.10.16 | 2.334 |
| 10.10.16 | 2.334 |
| 11.10.16 | 2.334 |
| 12.10.16 | 2.336 |
| 13.10.16 | 2.353 |
| 14.10.16 | 2.354 |
| 15.10.16 | 2.354 |
| 16.10.16 | 2.354 |
| 17.10.16 | 2.354 |
| 18.10.16 | 2.375 |
| 19.10.16 | 2.368 |
| 20.10.16 | 2.367 |
| 21.10.16 | 2.37 |
| 22.10.16 | 2.368 |
| 23.10.16 | 2.368 |
| 24.10.16 | 2.368 |
| 25.10.16 | 2.38 |
| 26.10.16 | 2.389 |
| 27.10.16 | 2.408 |
| 28.10.16 | 2.408 |
| 29.10.16 | 2.409 |
| 30.10.16 | 2.409 |
| 31.10.16 | 2.409 |
| 01.11.16 | 2.409 |
| 02.11.16 | 2.412 |
| 03.11.16 | 2.42 |
| 04.11.16 | 2.437 |
| 05.11.16 | 2.452 |
| 06.11.16 | 2.452 |
| 07.11.16 | 2.452 |
| 08.11.16 | 2.447 |
| 09.11.16 | 2.446 |
| 10.11.16 | 2.455 |
| 11.11.16 | 2.477 |
| 12.11.16 | 2.49 |
| 13.11.16 | 2.49 |
| 14.11.16 | 2.49 |
| 15.11.16 | 2.489 |
| 16.11.16 | 2.496 |
| 17.11.16 | 2.493 |
| 18.11.16 | 2.486 |
| 19.11.16 | 2.489 |
| 20.11.16 | 2.489 |
| 21.11.16 | 2.489 |
| 22.11.16 | 2.49 |
| 23.11.16 | 2.498 |
| 24.11.16 | 2.498 |
| 25.11.16 | 2.485 |
| 26.11.16 | 2.503 |
| 27.11.16 | 2.503 |
| 28.11.16 | 2.503 |
| 29.11.16 | 2.508 |
| 30.11.16 | 2.531 |
| 01.12.16 | 2.535 |
| 02.12.16 | 2.587 |
| 03.12.16 | 2.56 |
| 04.12.16 | 2.56 |
| 05.12.16 | 2.56 |
| 06.12.16 | 2.56 |
| 07.12.16 | 2.574 |
| 08.12.16 | 2.574 |
| 09.12.16 | 2.574 |
| 10.12.16 | 2.589 |
| 11.12.16 | 2.589 |
| 12.12.16 | 2.589 |
| 13.12.16 | 2.615 |
| 14.12.16 | 2.66 |
| 15.12.16 | 2.66 |
| 16.12.16 | 2.669 |
| 17.12.16 | 2.684 |
| 18.12.16 | 2.684 |
| 19.12.16 | 2.684 |
| 20.12.16 | 2.741 |
| 21.12.16 | 2.783 |
| 22.12.16 | 2.785 |
| 23.12.16 | 2.771 |
| 24.12.16 | 2.751 |
| 25.12.16 | 2.751 |
| 26.12.16 | 2.751 |
| 27.12.16 | 2.73 |
| 28.12.16 | 2.668 |
| 29.12.16 | 2.644 |
| 30.12.16 | 2.656 |
| 31.12.16 | 2.647 |
| 01.01.17 | 2.647 |
| 02.01.17 | 2.647 |
| 03.01.17 | 2.647 |
| 04.01.17 | 2.648 |
| 05.01.17 | 2.669 |
| 06.01.17 | 2.73 |
| 07.01.17 | 2.767 |
| 08.01.17 | 2.767 |
| 09.01.17 | 2.767 |
| 10.01.17 | 2.755 |
| 11.01.17 | 2.74 |
| 12.01.17 | 2.74 |
| 13.01.17 | 2.737 |
| 14.01.17 | 2.721 |
| 15.01.17 | 2.721 |
| 16.01.17 | 2.721 |
| 17.01.17 | 2.708 |
| 18.01.17 | 2.654 |
| 19.01.17 | 2.662 |
| 20.01.17 | 2.662 |
| 21.01.17 | 2.676 |
| 22.01.17 | 2.676 |
| 23.01.17 | 2.676 |
| 24.01.17 | 2.687 |
| 25.01.17 | 2.689 |
| 26.01.17 | 2.692 |
| 27.01.17 | 2.699 |
| 28.01.17 | 2.702 |
| 29.01.17 | 2.702 |
| 30.01.17 | 2.702 |
| 31.01.17 | 2.706 |
| 01.02.17 | 2.708 |
| 02.02.17 | 2.709 |
| 03.02.17 | 2.705 |
| 04.02.17 | 2.682 |
| 05.02.17 | 2.682 |
| 06.02.17 | 2.682 |
| 07.02.17 | 2.68 |
| 08.02.17 | 2.666 |
| 09.02.17 | 2.663 |
| 10.02.17 | 2.645 |
| 11.02.17 | 2.622 |
| 12.02.17 | 2.622 |
| 13.02.17 | 2.622 |
| 14.02.17 | 2.629 |
| 15.02.17 | 2.647 |
| 16.02.17 | 2.645 |
| 17.02.17 | 2.642 |
| 18.02.17 | 2.643 |
| 19.02.17 | 2.643 |
| 20.02.17 | 2.643 |
| 21.02.17 | 2.639 |
| 22.02.17 | 2.632 |
| 23.02.17 | 2.603 |
| 24.02.17 | 2.601 |
| 25.02.17 | 2.588 |
| 26.02.17 | 2.588 |
| 27.02.17 | 2.588 |
| 28.02.17 | 2.584 |
| 01.03.17 | 2.549 |
| 02.03.17 | 2.483 |
| 03.03.17 | 2.429 |
| 04.03.17 | 2.429 |
| 05.03.17 | 2.429 |
| 06.03.17 | 2.429 |
| 07.03.17 | 2.46 |
| 08.03.17 | 2.46 |
| 09.03.17 | 2.46 |
| 10.03.17 | 2.477 |
| 11.03.17 | 2.511 |
| 12.03.17 | 2.511 |
| 13.03.17 | 2.511 |
| 14.03.17 | 2.505 |
| 15.03.17 | 2.485 |
| 16.03.17 | 2.491 |
| 17.03.17 | 2.504 |
| 18.03.17 | 2.482 |
| 19.03.17 | 2.482 |
| 20.03.17 | 2.482 |
| 21.03.17 | 2.482 |
| 22.03.17 | 2.449 |
| 23.03.17 | 2.45 |
| 24.03.17 | 2.451 |
| 25.03.17 | 2.451 |
| 26.03.17 | 2.451 |
| 27.03.17 | 2.451 |
| 28.03.17 | 2.446 |
| 29.03.17 | 2.443 |
| 30.03.17 | 2.447 |
| 31.03.17 | 2.445 |
| 01.04.17 | 2.431 |
| 02.04.17 | 2.431 |
| 03.04.17 | 2.431 |
| 04.04.17 | 2.435 |
| 05.04.17 | 2.422 |
| 06.04.17 | 2.428 |
| 07.04.17 | 2.427 |
| 08.04.17 | 2.415 |
| 09.04.17 | 2.415 |
| 10.04.17 | 2.415 |
| 11.04.17 | 2.416 |
| 12.04.17 | 2.41 |
| 13.04.17 | 2.392 |
| 14.04.17 | 2.39 |
| 15.04.17 | 2.39 |
| 16.04.17 | 2.39 |
| 17.04.17 | 2.39 |
| 18.04.17 | 2.39 |
| 19.04.17 | 2.382 |
| 20.04.17 | 2.396 |
| 21.04.17 | 2.394 |
| 22.04.17 | 2.404 |
| 23.04.17 | 2.404 |
| 24.04.17 | 2.404 |
| 25.04.17 | 2.41 |
| 26.04.17 | 2.444 |
| 27.04.17 | 2.477 |
| 28.04.17 | 2.475 |
| 29.04.17 | 2.442 |
| 30.04.17 | 2.442 |
| 01.05.17 | 2.442 |
| 02.05.17 | 2.441 |
| 03.05.17 | 2.442 |
| 04.05.17 | 2.442 |
| 05.05.17 | 2.44 |
| 06.05.17 | 2.438 |
| 07.05.17 | 2.438 |
| 08.05.17 | 2.438 |
| 09.05.17 | 2.437 |
| 10.05.17 | 2.437 |
| 11.05.17 | 2.436 |
| 12.05.17 | 2.442 |
| 13.05.17 | 2.442 |
| 14.05.17 | 2.442 |
| 15.05.17 | 2.442 |
| 16.05.17 | 2.431 |
| 17.05.17 | 2.424 |
| 18.05.17 | 2.412 |
| 19.05.17 | 2.409 |
| 20.05.17 | 2.41 |
| 21.05.17 | 2.41 |
| 22.05.17 | 2.41 |
| 23.05.17 | 2.422 |
| 24.05.17 | 2.414 |
| 25.05.17 | 2.408 |
| 26.05.17 | 2.417 |
| 27.05.17 | 2.417 |
| 28.05.17 | 2.417 |
| 29.05.17 | 2.417 |
| 30.05.17 | 2.426 |
| 31.05.17 | 2.427 |
| 01.06.17 | 2.418 |
| 02.06.17 | 2.418 |
| 03.06.17 | 2.425 |
| 04.06.17 | 2.425 |
| 05.06.17 | 2.425 |
| 06.06.17 | 2.423 |
| 07.06.17 | 2.409 |
| 08.06.17 | 2.409 |
| 09.06.17 | 2.408 |
| 10.06.17 | 2.408 |
| 11.06.17 | 2.408 |
| 12.06.17 | 2.408 |
| 13.06.17 | 2.406 |
| 14.06.17 | 2.41 |
| 15.06.17 | 2.41 |
| 16.06.17 | 2.408 |
| 17.06.17 | 2.411 |
| 18.06.17 | 2.411 |
| 19.06.17 | 2.411 |
| 20.06.17 | 2.409 |
| 21.06.17 | 2.408 |
| 22.06.17 | 2.408 |
| 23.06.17 | 2.408 |
| 24.06.17 | 2.411 |
| 25.06.17 | 2.411 |
| 26.06.17 | 2.411 |
| 27.06.17 | 2.408 |
| 28.06.17 | 2.408 |
| 29.06.17 | 2.407 |
| 30.06.17 | 2.407 |
| 01.07.17 | 2.404 |
| 02.07.17 | 2.404 |
| 03.07.17 | 2.404 |
| 04.07.17 | 2.4 |
| 05.07.17 | 2.399 |
| 06.07.17 | 2.398 |
| 07.07.17 | 2.397 |
| 08.07.17 | 2.397 |
| 09.07.17 | 2.397 |
| 10.07.17 | 2.397 |
| 11.07.17 | 2.395 |
| 12.07.17 | 2.394 |
| 13.07.17 | 2.394 |
| 14.07.17 | 2.397 |
| 15.07.17 | 2.402 |
| 16.07.17 | 2.402 |
| 17.07.17 | 2.402 |
| 18.07.17 | 2.405 |
| 19.07.17 | 2.404 |
| 20.07.17 | 2.401 |
| 21.07.17 | 2.4 |
| 22.07.17 | 2.398 |
| 23.07.17 | 2.398 |
| 24.07.17 | 2.398 |
| 25.07.17 | 2.399 |
| 26.07.17 | 2.399 |
| 27.07.17 | 2.399 |
| 28.07.17 | 2.402 |
| 29.07.17 | 2.401 |
| 30.07.17 | 2.401 |
| 31.07.17 | 2.401 |
| 01.08.17 | 2.396 |
| 02.08.17 | 2.395 |
| 03.08.17 | 2.395 |
| 04.08.17 | 2.393 |
| 05.08.17 | 2.391 |
| 06.08.17 | 2.391 |
| 07.08.17 | 2.391 |
| 08.08.17 | 2.39 |
| 09.08.17 | 2.39 |
| 10.08.17 | 2.39 |
| 11.08.17 | 2.39 |
| 12.08.17 | 2.39 |
| 13.08.17 | 2.39 |
| 14.08.17 | 2.39 |
| 15.08.17 | 2.39 |
| 16.08.17 | 2.389 |
| 17.08.17 | 2.388 |
| 18.08.17 | 2.388 |
| 19.08.17 | 2.39 |
| 20.08.17 | 2.39 |
| 21.08.17 | 2.39 |
| 22.08.17 | 2.391 |
| 23.08.17 | 2.391 |
| 24.08.17 | 2.395 |
| 25.08.17 | 2.417 |
| 26.08.17 | 2.416 |
| 27.08.17 | 2.416 |
| 28.08.17 | 2.416 |
| 29.08.17 | 2.416 |
| 30.08.17 | 2.418 |
| 31.08.17 | 2.427 |
| 01.09.17 | 2.43 |
| 02.09.17 | 2.439 |
| 03.09.17 | 2.439 |
| 04.09.17 | 2.439 |
| 05.09.17 | 2.45 |
| 06.09.17 | 2.493 |
| 07.09.17 | 2.48 |
| 08.09.17 | 2.463 |
| 09.09.17 | 2.462 |
| 10.09.17 | 2.462 |
| 11.09.17 | 2.462 |
| 12.09.17 | 2.462 |
| 13.09.17 | 2.459 |
| 14.09.17 | 2.459 |
| 15.09.17 | 2.46 |
| 16.09.17 | 2.466 |
| 17.09.17 | 2.466 |
| 18.09.17 | 2.466 |
| 19.09.17 | 2.473 |
| 20.09.17 | 2.474 |
| 21.09.17 | 2.478 |
| 22.09.17 | 2.481 |
| 23.09.17 | 2.48 |
| 24.09.17 | 2.48 |
| 25.09.17 | 2.48 |
| 26.09.17 | 2.483 |
| 27.09.17 | 2.481 |
| 28.09.17 | 2.482 |
| 29.09.17 | 2.484 |
| 30.09.17 | 2.477 |
| 01.10.17 | 2.477 |
| 02.10.17 | 2.477 |
| 03.10.17 | 2.476 |
| 04.10.17 | 2.473 |
| 05.10.17 | 2.469 |
| 06.10.17 | 2.479 |
| 07.10.17 | 2.479 |
| 08.10.17 | 2.479 |
| 09.10.17 | 2.479 |
| 10.10.17 | 2.479 |
| 11.10.17 | 2.48 |
| 12.10.17 | 2.483 |
| 13.10.17 | 2.483 |
| 14.10.17 | 2.481 |
| 15.10.17 | 2.481 |
| 16.10.17 | 2.481 |
| 17.10.17 | 2.483 |
| 18.10.17 | 2.484 |
| 19.10.17 | 2.484 |
| 20.10.17 | 2.486 |
| 21.10.17 | 2.486 |
| 22.10.17 | 2.486 |
| 23.10.17 | 2.486 |
| 24.10.17 | 2.489 |
| 25.10.17 | 2.521 |
| 26.10.17 | 2.532 |
| 27.10.17 | 2.55 |
| 28.10.17 | 2.561 |
| 29.10.17 | 2.561 |
| 30.10.17 | 2.561 |
| 31.10.17 | 2.587 |
| 01.11.17 | 2.611 |
| 02.11.17 | 2.611 |
| 03.11.17 | 2.63 |
| 04.11.17 | 2.628 |
| 05.11.17 | 2.628 |
| 06.11.17 | 2.628 |
| 07.11.17 | 2.611 |
| 08.11.17 | 2.601 |
| 09.11.17 | 2.627 |
| 10.11.17 | 2.637 |
| 11.11.17 | 2.65 |
| 12.11.17 | 2.65 |
| 13.11.17 | 2.65 |
| 14.11.17 | 2.654 |
| 15.11.17 | 2.683 |
| 16.11.17 | 2.696 |
| 17.11.17 | 2.704 |
| 18.11.17 | 2.727 |
| 19.11.17 | 2.727 |
| 20.11.17 | 2.727 |
| 21.11.17 | 2.689 |
| 22.11.17 | 2.706 |
| 23.11.17 | 2.714 |
| 24.11.17 | 2.714 |
| 25.11.17 | 2.706 |
| 26.11.17 | 2.706 |
| 27.11.17 | 2.706 |
| 28.11.17 | 2.718 |
| 29.11.17 | 2.723 |
| 30.11.17 | 2.722 |
| 01.12.17 | 2.719 |
| 02.12.17 | 2.708 |
| 03.12.17 | 2.708 |
| 04.12.17 | 2.708 |
| 05.12.17 | 2.706 |
| 06.12.17 | 2.703 |
| 07.12.17 | 2.698 |
| 08.12.17 | 2.701 |
| 09.12.17 | 2.679 |
| 10.12.17 | 2.679 |
| 11.12.17 | 2.679 |
| 12.12.17 | 2.667 |
| 13.12.17 | 2.626 |
| 14.12.17 | 2.577 |
| 15.12.17 | 2.56 |
| 16.12.17 | 2.54 |
| 17.12.17 | 2.54 |
| 18.12.17 | 2.54 |
| 19.12.17 | 2.545 |
| 20.12.17 | 2.547 |
| 21.12.17 | 2.528 |
| 22.12.17 | 2.527 |
| 23.12.17 | 2.534 |
| 24.12.17 | 2.534 |
| 25.12.17 | 2.534 |
| 26.12.17 | 2.537 |
| 27.12.17 | 2.575 |
| 28.12.17 | 2.588 |
| 29.12.17 | 2.613 |
| 30.12.17 | 2.592 |
| 31.12.17 | 2.592 |
| 01.01.18 | 2.592 |
| 02.01.18 | 2.592 |
| 03.01.18 | 2.592 |
| 04.01.18 | 2.59 |
| 05.01.18 | 2.585 |
| 06.01.18 | 2.597 |
| 07.01.18 | 2.597 |
| 08.01.18 | 2.597 |
| 09.01.18 | 2.59 |
| 10.01.18 | 2.58 |
| 11.01.18 | 2.578 |
| 12.01.18 | 2.567 |
| 13.01.18 | 2.562 |
| 14.01.18 | 2.562 |
| 15.01.18 | 2.562 |
| 16.01.18 | 2.542 |
| 17.01.18 | 2.545 |
| 18.01.18 | 2.546 |
| 19.01.18 | 2.543 |
| 20.01.18 | 2.543 |
| 21.01.18 | 2.543 |
| 22.01.18 | 2.543 |
| 23.01.18 | 2.534 |
| 24.01.18 | 2.512 |
| 25.01.18 | 2.51 |
| 26.01.18 | 2.5 |
| 27.01.18 | 2.458 |
| 28.01.18 | 2.458 |
| 29.01.18 | 2.458 |
| 30.01.18 | 2.495 |
| 31.01.18 | 2.497 |
| 01.02.18 | 2.496 |
| 02.02.18 | 2.475 |
| 03.02.18 | 2.464 |
| 04.02.18 | 2.464 |
| 05.02.18 | 2.464 |
| 06.02.18 | 2.464 |
| 07.02.18 | 2.469 |
| 08.02.18 | 2.468 |
| 09.02.18 | 2.462 |
| 10.02.18 | 2.45 |
| 11.02.18 | 2.45 |
| 12.02.18 | 2.45 |
| 13.02.18 | 2.449 |
| 14.02.18 | 2.443 |
| 15.02.18 | 2.448 |
| 16.02.18 | 2.459 |
| 17.02.18 | 2.464 |
| 18.02.18 | 2.464 |
| 19.02.18 | 2.464 |
| 20.02.18 | 2.464 |
| 21.02.18 | 2.477 |
| 22.02.18 | 2.469 |
| 23.02.18 | 2.467 |
| 24.02.18 | 2.467 |
| 25.02.18 | 2.467 |
| 26.02.18 | 2.467 |
| 27.02.18 | 2.476 |
| 28.02.18 | 2.48 |
| 01.03.18 | 2.469 |
| 02.03.18 | 2.465 |
| 03.03.18 | 2.463 |
| 04.03.18 | 2.463 |
| 05.03.18 | 2.463 |
| 06.03.18 | 2.458 |
| 07.03.18 | 2.446 |
| 08.03.18 | 2.446 |
| 09.03.18 | 2.446 |
| 10.03.18 | 2.446 |
| 11.03.18 | 2.446 |
| 12.03.18 | 2.446 |
| 13.03.18 | 2.433 |
| 14.03.18 | 2.44 |
| 15.03.18 | 2.439 |
| 16.03.18 | 2.444 |
| 17.03.18 | 2.446 |
| 18.03.18 | 2.446 |
| 19.03.18 | 2.446 |
| 20.03.18 | 2.44 |
| 21.03.18 | 2.438 |
| 22.03.18 | 2.432 |
| 23.03.18 | 2.436 |
| 24.03.18 | 2.431 |
| 25.03.18 | 2.431 |
| 26.03.18 | 2.431 |
| 27.03.18 | 2.43 |
| 28.03.18 | 2.427 |
| 29.03.18 | 2.427 |
| 30.03.18 | 2.426 |
| 31.03.18 | 2.414 |
| 01.04.18 | 2.414 |
| 02.04.18 | 2.414 |
| 03.04.18 | 2.405 |
| 04.04.18 | 2.393 |
| 05.04.18 | 2.391 |
| 06.04.18 | 2.401 |
| 07.04.18 | 2.401 |
| 08.04.18 | 2.401 |
| 09.04.18 | 2.401 |
| 10.04.18 | 2.401 |
| 11.04.18 | 2.404 |
| 12.04.18 | 2.401 |
| 13.04.18 | 2.407 |
| 14.04.18 | 2.416 |
| 15.04.18 | 2.416 |
| 16.04.18 | 2.416 |
| 17.04.18 | 2.417 |
| 18.04.18 | 2.429 |
| 19.04.18 | 2.428 |
| 20.04.18 | 2.435 |
| 21.04.18 | 2.44 |
| 22.04.18 | 2.44 |
| 23.04.18 | 2.44 |
| 24.04.18 | 2.449 |
| 25.04.18 | 2.479 |
| 26.04.18 | 2.479 |
| 27.04.18 | 2.464 |
| 28.04.18 | 2.462 |
| 29.04.18 | 2.462 |
| 30.04.18 | 2.462 |
| 01.05.18 | 2.457 |
| 02.05.18 | 2.455 |
| 03.05.18 | 2.456 |
| 04.05.18 | 2.461 |
| 05.05.18 | 2.458 |
| 06.05.18 | 2.458 |
| 07.05.18 | 2.458 |
| 08.05.18 | 2.451 |
| 09.05.18 | 2.45 |
| 10.05.18 | 2.45 |
| 11.05.18 | 2.45 |
| 12.05.18 | 2.45 |
| 13.05.18 | 2.45 |
| 14.05.18 | 2.45 |
| 15.05.18 | 2.443 |
| 16.05.18 | 2.434 |
| 17.05.18 | 2.432 |
| 18.05.18 | 2.44 |
| 19.05.18 | 2.442 |
| 20.05.18 | 2.442 |
| 21.05.18 | 2.442 |
| 22.05.18 | 2.436 |
| 23.05.18 | 2.444 |
| 24.05.18 | 2.449 |
| 25.05.18 | 2.473 |
| 26.05.18 | 2.48 |
| 27.05.18 | 2.48 |
| 28.05.18 | 2.48 |
| 29.05.18 | 2.466 |
| 30.05.18 | 2.472 |
| 31.05.18 | 2.472 |
| 01.06.18 | 2.466 |
| 02.06.18 | 2.474 |
| 03.06.18 | 2.474 |
| 04.06.18 | 2.474 |
| 05.06.18 | 2.456 |
| 06.06.18 | 2.451 |
| 07.06.18 | 2.446 |
| 08.06.18 | 2.451 |
| 09.06.18 | 2.454 |
| 10.06.18 | 2.454 |
| 11.06.18 | 2.454 |
| 12.06.18 | 2.447 |
| 13.06.18 | 2.457 |
| 14.06.18 | 2.462 |
| 15.06.18 | 2.463 |
| 16.06.18 | 2.46 |
| 17.06.18 | 2.46 |
| 18.06.18 | 2.46 |
| 19.06.18 | 2.459 |
| 20.06.18 | 2.456 |
| 21.06.18 | 2.457 |
| 22.06.18 | 2.458 |
| 23.06.18 | 2.458 |
| 24.06.18 | 2.458 |
| 25.06.18 | 2.458 |
| 26.06.18 | 2.453 |
| 27.06.18 | 2.456 |
| 28.06.18 | 2.455 |